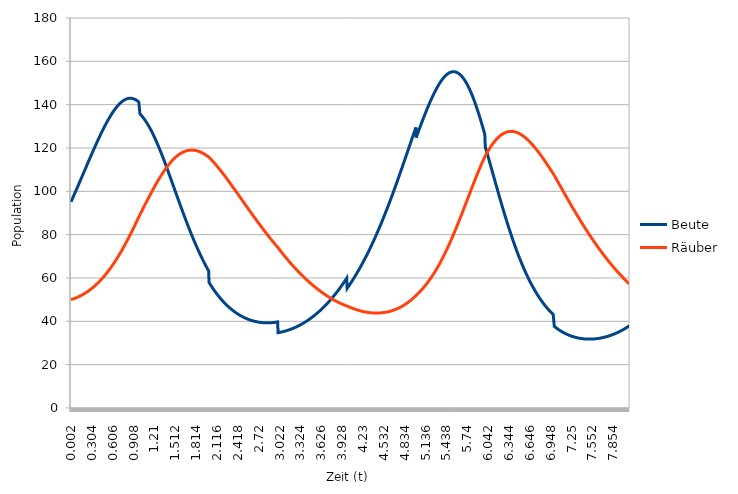
| Category | Beute | Räuber |
|---|---|---|
| 0.002 | 95.142 | 50.019 |
| 0.004 | 95.285 | 50.038 |
| 0.006 | 95.428 | 50.057 |
| 0.008 | 95.571 | 50.076 |
| 0.01 | 95.714 | 50.096 |
| 0.012 | 95.857 | 50.115 |
| 0.014 | 96 | 50.135 |
| 0.016 | 96.143 | 50.155 |
| 0.018 | 96.287 | 50.175 |
| 0.02 | 96.43 | 50.196 |
| 0.022 | 96.574 | 50.216 |
| 0.024 | 96.718 | 50.237 |
| 0.026 | 96.862 | 50.258 |
| 0.028 | 97.006 | 50.279 |
| 0.03 | 97.15 | 50.301 |
| 0.032 | 97.294 | 50.322 |
| 0.034 | 97.439 | 50.344 |
| 0.036 | 97.583 | 50.366 |
| 0.038 | 97.728 | 50.388 |
| 0.04 | 97.873 | 50.411 |
| 0.042 | 98.017 | 50.433 |
| 0.044 | 98.162 | 50.456 |
| 0.046 | 98.307 | 50.479 |
| 0.048 | 98.452 | 50.502 |
| 0.05 | 98.598 | 50.525 |
| 0.052 | 98.743 | 50.549 |
| 0.054 | 98.888 | 50.572 |
| 0.056 | 99.034 | 50.596 |
| 0.058 | 99.179 | 50.62 |
| 0.06 | 99.325 | 50.645 |
| 0.062 | 99.471 | 50.669 |
| 0.064 | 99.617 | 50.694 |
| 0.066 | 99.763 | 50.719 |
| 0.068 | 99.909 | 50.744 |
| 0.07 | 100.055 | 50.769 |
| 0.072 | 100.201 | 50.794 |
| 0.074 | 100.347 | 50.82 |
| 0.076 | 100.494 | 50.846 |
| 0.078 | 100.64 | 50.872 |
| 0.08 | 100.787 | 50.898 |
| 0.082 | 100.934 | 50.925 |
| 0.084 | 101.08 | 50.951 |
| 0.086 | 101.227 | 50.978 |
| 0.088 | 101.374 | 51.005 |
| 0.09 | 101.521 | 51.032 |
| 0.092 | 101.668 | 51.06 |
| 0.094 | 101.815 | 51.088 |
| 0.096 | 101.962 | 51.115 |
| 0.098 | 102.11 | 51.143 |
| 0.1 | 102.257 | 51.172 |
| 0.102 | 102.404 | 51.2 |
| 0.104 | 102.552 | 51.229 |
| 0.106 | 102.699 | 51.258 |
| 0.108 | 102.847 | 51.287 |
| 0.11 | 102.995 | 51.316 |
| 0.112 | 103.142 | 51.346 |
| 0.114 | 103.29 | 51.375 |
| 0.116 | 103.438 | 51.405 |
| 0.118 | 103.586 | 51.435 |
| 0.12 | 103.734 | 51.466 |
| 0.122 | 103.882 | 51.496 |
| 0.124 | 104.03 | 51.527 |
| 0.126 | 104.178 | 51.558 |
| 0.128 | 104.326 | 51.589 |
| 0.13 | 104.474 | 51.62 |
| 0.132 | 104.622 | 51.652 |
| 0.134 | 104.771 | 51.684 |
| 0.136 | 104.919 | 51.716 |
| 0.138 | 105.067 | 51.748 |
| 0.14 | 105.216 | 51.78 |
| 0.142 | 105.364 | 51.813 |
| 0.144 | 105.513 | 51.846 |
| 0.146 | 105.661 | 51.879 |
| 0.148 | 105.81 | 51.912 |
| 0.15 | 105.959 | 51.946 |
| 0.152 | 106.107 | 51.98 |
| 0.154 | 106.256 | 52.013 |
| 0.156 | 106.404 | 52.048 |
| 0.158 | 106.553 | 52.082 |
| 0.16 | 106.702 | 52.117 |
| 0.162 | 106.851 | 52.151 |
| 0.164 | 106.999 | 52.186 |
| 0.166 | 107.148 | 52.222 |
| 0.168 | 107.297 | 52.257 |
| 0.17 | 107.446 | 52.293 |
| 0.172 | 107.595 | 52.329 |
| 0.174 | 107.744 | 52.365 |
| 0.176 | 107.893 | 52.401 |
| 0.178 | 108.041 | 52.438 |
| 0.18 | 108.19 | 52.474 |
| 0.182 | 108.339 | 52.511 |
| 0.184 | 108.488 | 52.548 |
| 0.186 | 108.637 | 52.586 |
| 0.188 | 108.786 | 52.624 |
| 0.19 | 108.935 | 52.661 |
| 0.192 | 109.084 | 52.699 |
| 0.194 | 109.233 | 52.738 |
| 0.196 | 109.382 | 52.776 |
| 0.198 | 109.53 | 52.815 |
| 0.2 | 109.679 | 52.854 |
| 0.202 | 109.828 | 52.893 |
| 0.204 | 109.977 | 52.933 |
| 0.206 | 110.126 | 52.972 |
| 0.208 | 110.275 | 53.012 |
| 0.21 | 110.424 | 53.052 |
| 0.212 | 110.572 | 53.093 |
| 0.214 | 110.721 | 53.133 |
| 0.216 | 110.87 | 53.174 |
| 0.218 | 111.018 | 53.215 |
| 0.22 | 111.167 | 53.257 |
| 0.222 | 111.316 | 53.298 |
| 0.224 | 111.464 | 53.34 |
| 0.226 | 111.613 | 53.382 |
| 0.228 | 111.762 | 53.424 |
| 0.23 | 111.91 | 53.466 |
| 0.232 | 112.059 | 53.509 |
| 0.234 | 112.207 | 53.552 |
| 0.236 | 112.355 | 53.595 |
| 0.238 | 112.504 | 53.638 |
| 0.24 | 112.652 | 53.682 |
| 0.242 | 112.8 | 53.726 |
| 0.244 | 112.948 | 53.77 |
| 0.246 | 113.097 | 53.814 |
| 0.248 | 113.245 | 53.859 |
| 0.25 | 113.393 | 53.903 |
| 0.252 | 113.541 | 53.948 |
| 0.254 | 113.688 | 53.994 |
| 0.256 | 113.836 | 54.039 |
| 0.258 | 113.984 | 54.085 |
| 0.26 | 114.132 | 54.131 |
| 0.262 | 114.279 | 54.177 |
| 0.264 | 114.427 | 54.223 |
| 0.266 | 114.574 | 54.27 |
| 0.268 | 114.722 | 54.317 |
| 0.27 | 114.869 | 54.364 |
| 0.272 | 115.016 | 54.411 |
| 0.274 | 115.164 | 54.459 |
| 0.276 | 115.311 | 54.507 |
| 0.278 | 115.458 | 54.555 |
| 0.28 | 115.604 | 54.603 |
| 0.282 | 115.751 | 54.652 |
| 0.284 | 115.898 | 54.701 |
| 0.286 | 116.045 | 54.75 |
| 0.288 | 116.191 | 54.799 |
| 0.29 | 116.338 | 54.849 |
| 0.292 | 116.484 | 54.899 |
| 0.294 | 116.63 | 54.949 |
| 0.296 | 116.776 | 54.999 |
| 0.298 | 116.922 | 55.05 |
| 0.3 | 117.068 | 55.1 |
| 0.302 | 117.214 | 55.152 |
| 0.304 | 117.359 | 55.203 |
| 0.306 | 117.505 | 55.254 |
| 0.308 | 117.65 | 55.306 |
| 0.31 | 117.795 | 55.358 |
| 0.312 | 117.941 | 55.411 |
| 0.314 | 118.086 | 55.463 |
| 0.316 | 118.23 | 55.516 |
| 0.318 | 118.375 | 55.569 |
| 0.32 | 118.52 | 55.622 |
| 0.322 | 118.664 | 55.676 |
| 0.324 | 118.809 | 55.73 |
| 0.326 | 118.953 | 55.784 |
| 0.328 | 119.097 | 55.838 |
| 0.33 | 119.241 | 55.893 |
| 0.332 | 119.384 | 55.948 |
| 0.334 | 119.528 | 56.003 |
| 0.336 | 119.671 | 56.058 |
| 0.338 | 119.815 | 56.114 |
| 0.34 | 119.958 | 56.169 |
| 0.342 | 120.101 | 56.226 |
| 0.344 | 120.243 | 56.282 |
| 0.346 | 120.386 | 56.338 |
| 0.348 | 120.528 | 56.395 |
| 0.35 | 120.671 | 56.453 |
| 0.352 | 120.813 | 56.51 |
| 0.354 | 120.955 | 56.568 |
| 0.356 | 121.096 | 56.625 |
| 0.358 | 121.238 | 56.684 |
| 0.36 | 121.379 | 56.742 |
| 0.362 | 121.52 | 56.801 |
| 0.364 | 121.661 | 56.86 |
| 0.366 | 121.802 | 56.919 |
| 0.368 | 121.943 | 56.978 |
| 0.37 | 122.083 | 57.038 |
| 0.372 | 122.223 | 57.098 |
| 0.374 | 122.363 | 57.159 |
| 0.376 | 122.503 | 57.219 |
| 0.378 | 122.642 | 57.28 |
| 0.38 | 122.782 | 57.341 |
| 0.382 | 122.921 | 57.402 |
| 0.384 | 123.06 | 57.464 |
| 0.386 | 123.198 | 57.526 |
| 0.388 | 123.337 | 57.588 |
| 0.39 | 123.475 | 57.65 |
| 0.392 | 123.613 | 57.713 |
| 0.394 | 123.751 | 57.776 |
| 0.396 | 123.888 | 57.839 |
| 0.398 | 124.026 | 57.902 |
| 0.4 | 124.163 | 57.966 |
| 0.402 | 124.299 | 58.03 |
| 0.404 | 124.436 | 58.094 |
| 0.406 | 124.572 | 58.159 |
| 0.408 | 124.708 | 58.224 |
| 0.41 | 124.844 | 58.289 |
| 0.412 | 124.98 | 58.354 |
| 0.414 | 125.115 | 58.42 |
| 0.416 | 125.25 | 58.486 |
| 0.418 | 125.385 | 58.552 |
| 0.42 | 125.519 | 58.618 |
| 0.422 | 125.653 | 58.685 |
| 0.424 | 125.787 | 58.752 |
| 0.426 | 125.921 | 58.819 |
| 0.428 | 126.054 | 58.887 |
| 0.43 | 126.187 | 58.955 |
| 0.432 | 126.32 | 59.023 |
| 0.434 | 126.453 | 59.091 |
| 0.436 | 126.585 | 59.16 |
| 0.438 | 126.717 | 59.229 |
| 0.44 | 126.848 | 59.298 |
| 0.442 | 126.98 | 59.367 |
| 0.444 | 127.111 | 59.437 |
| 0.446 | 127.241 | 59.507 |
| 0.448 | 127.372 | 59.577 |
| 0.45 | 127.502 | 59.648 |
| 0.452 | 127.631 | 59.719 |
| 0.454 | 127.761 | 59.79 |
| 0.456 | 127.89 | 59.861 |
| 0.458 | 128.019 | 59.933 |
| 0.46 | 128.147 | 60.005 |
| 0.462 | 128.275 | 60.077 |
| 0.464 | 128.403 | 60.149 |
| 0.466 | 128.531 | 60.222 |
| 0.468 | 128.658 | 60.295 |
| 0.47 | 128.784 | 60.369 |
| 0.472 | 128.911 | 60.442 |
| 0.474 | 129.037 | 60.516 |
| 0.476 | 129.163 | 60.59 |
| 0.478 | 129.288 | 60.665 |
| 0.48 | 129.413 | 60.74 |
| 0.482 | 129.538 | 60.815 |
| 0.484 | 129.662 | 60.89 |
| 0.486 | 129.786 | 60.965 |
| 0.488 | 129.909 | 61.041 |
| 0.49 | 130.032 | 61.118 |
| 0.492 | 130.155 | 61.194 |
| 0.494 | 130.278 | 61.271 |
| 0.496 | 130.4 | 61.348 |
| 0.498 | 130.521 | 61.425 |
| 0.5 | 130.642 | 61.503 |
| 0.502 | 130.763 | 61.58 |
| 0.504 | 130.884 | 61.659 |
| 0.506 | 131.004 | 61.737 |
| 0.508 | 131.123 | 61.816 |
| 0.51 | 131.242 | 61.895 |
| 0.512 | 131.361 | 61.974 |
| 0.514 | 131.48 | 62.054 |
| 0.516 | 131.598 | 62.133 |
| 0.518 | 131.715 | 62.214 |
| 0.52 | 131.832 | 62.294 |
| 0.522 | 131.949 | 62.375 |
| 0.524 | 132.065 | 62.456 |
| 0.526 | 132.181 | 62.537 |
| 0.528 | 132.297 | 62.619 |
| 0.53 | 132.412 | 62.701 |
| 0.532 | 132.526 | 62.783 |
| 0.534 | 132.64 | 62.865 |
| 0.536 | 132.754 | 62.948 |
| 0.538 | 132.867 | 63.031 |
| 0.54 | 132.98 | 63.114 |
| 0.542 | 133.092 | 63.198 |
| 0.544 | 133.204 | 63.282 |
| 0.546 | 133.315 | 63.366 |
| 0.548 | 133.426 | 63.45 |
| 0.55 | 133.537 | 63.535 |
| 0.552 | 133.646 | 63.62 |
| 0.554 | 133.756 | 63.705 |
| 0.556 | 133.865 | 63.791 |
| 0.558 | 133.973 | 63.877 |
| 0.56 | 134.081 | 63.963 |
| 0.562 | 134.189 | 64.05 |
| 0.564 | 134.296 | 64.136 |
| 0.566 | 134.402 | 64.223 |
| 0.568 | 134.508 | 64.311 |
| 0.57 | 134.614 | 64.398 |
| 0.572 | 134.719 | 64.486 |
| 0.574 | 134.823 | 64.575 |
| 0.576 | 134.927 | 64.663 |
| 0.578 | 135.031 | 64.752 |
| 0.58 | 135.134 | 64.841 |
| 0.582 | 135.236 | 64.93 |
| 0.584 | 135.338 | 65.02 |
| 0.586 | 135.44 | 65.11 |
| 0.588 | 135.54 | 65.2 |
| 0.59 | 135.641 | 65.291 |
| 0.592 | 135.74 | 65.382 |
| 0.594 | 135.84 | 65.473 |
| 0.596 | 135.938 | 65.564 |
| 0.598 | 136.036 | 65.656 |
| 0.6 | 136.134 | 65.748 |
| 0.602 | 136.231 | 65.84 |
| 0.604 | 136.327 | 65.933 |
| 0.606 | 136.423 | 66.025 |
| 0.608 | 136.519 | 66.119 |
| 0.61 | 136.613 | 66.212 |
| 0.612 | 136.708 | 66.306 |
| 0.614 | 136.801 | 66.4 |
| 0.616 | 136.894 | 66.494 |
| 0.618 | 136.987 | 66.589 |
| 0.62 | 137.079 | 66.683 |
| 0.622 | 137.17 | 66.779 |
| 0.624 | 137.261 | 66.874 |
| 0.626 | 137.351 | 66.97 |
| 0.628 | 137.44 | 67.066 |
| 0.63 | 137.529 | 67.162 |
| 0.632 | 137.617 | 67.259 |
| 0.634 | 137.705 | 67.356 |
| 0.636 | 137.792 | 67.453 |
| 0.638 | 137.878 | 67.55 |
| 0.64 | 137.964 | 67.648 |
| 0.642 | 138.049 | 67.746 |
| 0.644 | 138.134 | 67.844 |
| 0.646 | 138.218 | 67.943 |
| 0.648 | 138.301 | 68.042 |
| 0.65 | 138.384 | 68.141 |
| 0.652 | 138.466 | 68.24 |
| 0.654 | 138.547 | 68.34 |
| 0.656 | 138.628 | 68.44 |
| 0.658 | 138.708 | 68.54 |
| 0.66 | 138.788 | 68.641 |
| 0.662 | 138.867 | 68.742 |
| 0.664 | 138.945 | 68.843 |
| 0.666 | 139.022 | 68.945 |
| 0.668 | 139.099 | 69.046 |
| 0.67 | 139.175 | 69.148 |
| 0.672 | 139.251 | 69.251 |
| 0.674 | 139.326 | 69.353 |
| 0.676 | 139.4 | 69.456 |
| 0.678 | 139.473 | 69.559 |
| 0.68 | 139.546 | 69.663 |
| 0.682 | 139.618 | 69.766 |
| 0.684 | 139.69 | 69.87 |
| 0.686 | 139.761 | 69.975 |
| 0.688 | 139.831 | 70.079 |
| 0.69 | 139.9 | 70.184 |
| 0.692 | 139.969 | 70.289 |
| 0.694 | 140.037 | 70.394 |
| 0.696 | 140.104 | 70.5 |
| 0.698 | 140.17 | 70.606 |
| 0.7 | 140.236 | 70.712 |
| 0.702 | 140.301 | 70.819 |
| 0.704 | 140.366 | 70.925 |
| 0.706 | 140.429 | 71.032 |
| 0.708 | 140.492 | 71.14 |
| 0.71 | 140.555 | 71.247 |
| 0.712 | 140.616 | 71.355 |
| 0.714 | 140.677 | 71.463 |
| 0.716 | 140.737 | 71.572 |
| 0.718 | 140.796 | 71.68 |
| 0.72 | 140.855 | 71.789 |
| 0.722 | 140.913 | 71.899 |
| 0.724 | 140.97 | 72.008 |
| 0.726 | 141.026 | 72.118 |
| 0.728 | 141.082 | 72.228 |
| 0.73 | 141.137 | 72.338 |
| 0.732 | 141.191 | 72.449 |
| 0.734 | 141.244 | 72.56 |
| 0.736 | 141.296 | 72.671 |
| 0.738 | 141.348 | 72.782 |
| 0.74 | 141.399 | 72.894 |
| 0.742 | 141.449 | 73.006 |
| 0.744 | 141.499 | 73.118 |
| 0.746 | 141.548 | 73.23 |
| 0.748 | 141.596 | 73.343 |
| 0.75 | 141.643 | 73.456 |
| 0.752 | 141.689 | 73.569 |
| 0.754 | 141.735 | 73.682 |
| 0.756 | 141.779 | 73.796 |
| 0.758 | 141.823 | 73.91 |
| 0.76 | 141.867 | 74.024 |
| 0.762 | 141.909 | 74.139 |
| 0.764 | 141.951 | 74.254 |
| 0.766 | 141.991 | 74.369 |
| 0.768 | 142.031 | 74.484 |
| 0.77 | 142.07 | 74.599 |
| 0.772 | 142.109 | 74.715 |
| 0.774 | 142.146 | 74.831 |
| 0.776 | 142.183 | 74.947 |
| 0.778 | 142.219 | 75.064 |
| 0.78 | 142.254 | 75.181 |
| 0.782 | 142.288 | 75.298 |
| 0.784 | 142.322 | 75.415 |
| 0.786 | 142.354 | 75.532 |
| 0.788 | 142.386 | 75.65 |
| 0.79 | 142.417 | 75.768 |
| 0.792 | 142.447 | 75.886 |
| 0.794 | 142.477 | 76.005 |
| 0.796 | 142.505 | 76.124 |
| 0.798 | 142.533 | 76.242 |
| 0.8 | 142.56 | 76.362 |
| 0.802 | 142.585 | 76.481 |
| 0.804 | 142.611 | 76.601 |
| 0.806 | 142.635 | 76.721 |
| 0.808 | 142.658 | 76.841 |
| 0.81 | 142.681 | 76.961 |
| 0.812 | 142.702 | 77.082 |
| 0.814 | 142.723 | 77.203 |
| 0.816 | 142.743 | 77.324 |
| 0.818 | 142.762 | 77.445 |
| 0.82 | 142.781 | 77.566 |
| 0.822 | 142.798 | 77.688 |
| 0.824 | 142.814 | 77.81 |
| 0.826 | 142.83 | 77.932 |
| 0.828 | 142.845 | 78.055 |
| 0.83 | 142.859 | 78.177 |
| 0.832 | 142.872 | 78.3 |
| 0.834 | 142.884 | 78.423 |
| 0.836 | 142.895 | 78.547 |
| 0.838 | 142.906 | 78.67 |
| 0.84 | 142.915 | 78.794 |
| 0.842 | 142.924 | 78.918 |
| 0.844 | 142.931 | 79.042 |
| 0.846 | 142.938 | 79.166 |
| 0.848 | 142.944 | 79.291 |
| 0.85 | 142.949 | 79.416 |
| 0.852 | 142.953 | 79.541 |
| 0.854 | 142.957 | 79.666 |
| 0.856 | 142.959 | 79.791 |
| 0.858 | 142.961 | 79.917 |
| 0.86 | 142.961 | 80.043 |
| 0.862 | 142.961 | 80.169 |
| 0.864 | 142.96 | 80.295 |
| 0.866 | 142.958 | 80.421 |
| 0.868 | 142.955 | 80.548 |
| 0.87 | 142.951 | 80.674 |
| 0.872 | 142.946 | 80.801 |
| 0.874 | 142.94 | 80.929 |
| 0.876 | 142.933 | 81.056 |
| 0.878 | 142.926 | 81.183 |
| 0.88 | 142.917 | 81.311 |
| 0.882 | 142.908 | 81.439 |
| 0.884 | 142.898 | 81.567 |
| 0.886 | 142.887 | 81.695 |
| 0.888 | 142.875 | 81.824 |
| 0.89 | 142.861 | 81.952 |
| 0.892 | 142.848 | 82.081 |
| 0.894 | 142.833 | 82.21 |
| 0.896 | 142.817 | 82.339 |
| 0.898 | 142.8 | 82.469 |
| 0.9 | 142.783 | 82.598 |
| 0.902 | 142.764 | 82.728 |
| 0.904 | 142.745 | 82.858 |
| 0.906 | 142.724 | 82.988 |
| 0.908 | 142.703 | 83.118 |
| 0.91 | 142.681 | 83.248 |
| 0.912 | 142.657 | 83.378 |
| 0.914 | 142.633 | 83.509 |
| 0.916 | 142.608 | 83.64 |
| 0.918 | 142.582 | 83.771 |
| 0.92 | 142.555 | 83.902 |
| 0.922 | 142.528 | 84.033 |
| 0.924 | 142.499 | 84.164 |
| 0.926 | 142.469 | 84.296 |
| 0.928 | 142.439 | 84.427 |
| 0.93 | 142.407 | 84.559 |
| 0.932 | 142.375 | 84.691 |
| 0.934 | 142.341 | 84.823 |
| 0.936 | 142.307 | 84.955 |
| 0.938 | 142.272 | 85.088 |
| 0.94 | 142.235 | 85.22 |
| 0.942 | 142.198 | 85.353 |
| 0.944 | 142.16 | 85.486 |
| 0.946 | 142.121 | 85.618 |
| 0.948 | 142.081 | 85.751 |
| 0.95 | 142.04 | 85.884 |
| 0.952 | 141.999 | 86.018 |
| 0.954 | 141.956 | 86.151 |
| 0.956 | 141.912 | 86.284 |
| 0.958 | 141.868 | 86.418 |
| 0.96 | 141.822 | 86.552 |
| 0.962 | 141.776 | 86.685 |
| 0.964 | 141.728 | 86.819 |
| 0.966 | 141.68 | 86.953 |
| 0.968 | 141.631 | 87.087 |
| 0.97 | 141.581 | 87.222 |
| 0.972 | 141.529 | 87.356 |
| 0.974 | 141.477 | 87.49 |
| 0.976 | 141.424 | 87.625 |
| 0.978 | 141.371 | 87.759 |
| 0.98 | 141.316 | 87.894 |
| 0.982 | 141.26 | 88.029 |
| 0.984 | 141.203 | 88.163 |
| 0.986 | 141.146 | 88.298 |
| 0.988 | 141.087 | 88.433 |
| 0.99 | 141.027 | 88.568 |
| 0.992 | 140.967 | 88.703 |
| 0.994 | 140.906 | 88.839 |
| 0.996 | 140.843 | 88.974 |
| 0.998 | 140.78 | 89.109 |
| 1.0 | 135.716 | 89.245 |
| 1.002 | 135.653 | 89.369 |
| 1.004 | 135.59 | 89.493 |
| 1.006 | 135.525 | 89.618 |
| 1.008 | 135.46 | 89.742 |
| 1.01 | 135.394 | 89.867 |
| 1.012 | 135.328 | 89.991 |
| 1.014 | 135.26 | 90.115 |
| 1.016 | 135.192 | 90.24 |
| 1.018 | 135.122 | 90.364 |
| 1.02 | 135.052 | 90.489 |
| 1.022 | 134.981 | 90.614 |
| 1.024 | 134.91 | 90.738 |
| 1.026 | 134.837 | 90.863 |
| 1.028 | 134.764 | 90.987 |
| 1.03 | 134.69 | 91.112 |
| 1.032 | 134.615 | 91.236 |
| 1.034 | 134.54 | 91.361 |
| 1.036 | 134.463 | 91.485 |
| 1.038 | 134.386 | 91.61 |
| 1.04 | 134.308 | 91.735 |
| 1.042 | 134.229 | 91.859 |
| 1.044 | 134.15 | 91.984 |
| 1.046 | 134.069 | 92.108 |
| 1.048 | 133.988 | 92.233 |
| 1.05 | 133.906 | 92.357 |
| 1.052 | 133.823 | 92.482 |
| 1.054 | 133.74 | 92.606 |
| 1.056 | 133.656 | 92.731 |
| 1.058 | 133.57 | 92.855 |
| 1.06 | 133.485 | 92.979 |
| 1.062 | 133.398 | 93.104 |
| 1.064 | 133.311 | 93.228 |
| 1.066 | 133.222 | 93.352 |
| 1.068 | 133.134 | 93.476 |
| 1.07 | 133.044 | 93.601 |
| 1.072 | 132.953 | 93.725 |
| 1.074 | 132.862 | 93.849 |
| 1.076 | 132.77 | 93.973 |
| 1.078 | 132.677 | 94.097 |
| 1.08 | 132.584 | 94.221 |
| 1.082 | 132.49 | 94.344 |
| 1.084 | 132.395 | 94.468 |
| 1.086 | 132.299 | 94.592 |
| 1.088 | 132.202 | 94.716 |
| 1.09 | 132.105 | 94.839 |
| 1.092 | 132.007 | 94.963 |
| 1.094 | 131.908 | 95.086 |
| 1.096 | 131.809 | 95.21 |
| 1.098 | 131.708 | 95.333 |
| 1.1 | 131.607 | 95.456 |
| 1.102 | 131.506 | 95.579 |
| 1.104 | 131.403 | 95.703 |
| 1.106 | 131.3 | 95.825 |
| 1.108 | 131.196 | 95.948 |
| 1.11 | 131.092 | 96.071 |
| 1.112 | 130.986 | 96.194 |
| 1.114 | 130.88 | 96.317 |
| 1.116 | 130.773 | 96.439 |
| 1.118 | 130.666 | 96.561 |
| 1.12 | 130.558 | 96.684 |
| 1.122 | 130.449 | 96.806 |
| 1.124 | 130.339 | 96.928 |
| 1.126 | 130.229 | 97.05 |
| 1.128 | 130.118 | 97.172 |
| 1.13 | 130.006 | 97.294 |
| 1.132 | 129.894 | 97.415 |
| 1.134 | 129.781 | 97.537 |
| 1.136 | 129.667 | 97.658 |
| 1.138 | 129.552 | 97.779 |
| 1.14 | 129.437 | 97.901 |
| 1.142 | 129.321 | 98.022 |
| 1.144 | 129.205 | 98.142 |
| 1.146 | 129.088 | 98.263 |
| 1.148 | 128.97 | 98.384 |
| 1.15 | 128.851 | 98.504 |
| 1.152 | 128.732 | 98.625 |
| 1.154 | 128.612 | 98.745 |
| 1.156 | 128.492 | 98.865 |
| 1.158 | 128.37 | 98.985 |
| 1.16 | 128.249 | 99.104 |
| 1.162 | 128.126 | 99.224 |
| 1.164 | 128.003 | 99.343 |
| 1.166 | 127.879 | 99.462 |
| 1.168 | 127.755 | 99.581 |
| 1.17 | 127.63 | 99.7 |
| 1.172 | 127.504 | 99.819 |
| 1.174 | 127.377 | 99.938 |
| 1.176 | 127.25 | 100.056 |
| 1.178 | 127.123 | 100.174 |
| 1.18 | 126.995 | 100.292 |
| 1.182 | 126.866 | 100.41 |
| 1.184 | 126.736 | 100.528 |
| 1.186 | 126.606 | 100.645 |
| 1.188 | 126.476 | 100.762 |
| 1.19 | 126.344 | 100.879 |
| 1.192 | 126.212 | 100.996 |
| 1.194 | 126.08 | 101.113 |
| 1.196 | 125.947 | 101.229 |
| 1.198 | 125.813 | 101.346 |
| 1.2 | 125.679 | 101.462 |
| 1.202 | 125.544 | 101.578 |
| 1.204 | 125.408 | 101.693 |
| 1.206 | 125.272 | 101.809 |
| 1.208 | 125.136 | 101.924 |
| 1.21 | 124.999 | 102.039 |
| 1.212 | 124.861 | 102.154 |
| 1.214 | 124.723 | 102.268 |
| 1.216 | 124.584 | 102.383 |
| 1.218 | 124.444 | 102.497 |
| 1.22 | 124.304 | 102.611 |
| 1.222 | 124.164 | 102.724 |
| 1.224 | 124.023 | 102.838 |
| 1.226 | 123.881 | 102.951 |
| 1.228 | 123.739 | 103.064 |
| 1.23 | 123.596 | 103.177 |
| 1.232 | 123.453 | 103.289 |
| 1.234 | 123.309 | 103.401 |
| 1.236 | 123.165 | 103.513 |
| 1.238 | 123.02 | 103.625 |
| 1.24 | 122.875 | 103.736 |
| 1.242 | 122.729 | 103.848 |
| 1.244 | 122.583 | 103.958 |
| 1.246 | 122.436 | 104.069 |
| 1.248 | 122.289 | 104.18 |
| 1.25 | 122.141 | 104.29 |
| 1.252 | 121.992 | 104.4 |
| 1.254 | 121.844 | 104.509 |
| 1.256 | 121.694 | 104.619 |
| 1.258 | 121.544 | 104.728 |
| 1.26 | 121.394 | 104.836 |
| 1.262 | 121.243 | 104.945 |
| 1.264 | 121.092 | 105.053 |
| 1.266 | 120.94 | 105.161 |
| 1.268 | 120.788 | 105.269 |
| 1.27 | 120.636 | 105.376 |
| 1.272 | 120.483 | 105.483 |
| 1.274 | 120.329 | 105.59 |
| 1.276 | 120.175 | 105.696 |
| 1.278 | 120.021 | 105.802 |
| 1.28 | 119.866 | 105.908 |
| 1.282 | 119.711 | 106.014 |
| 1.284 | 119.555 | 106.119 |
| 1.286 | 119.399 | 106.224 |
| 1.288 | 119.242 | 106.329 |
| 1.29 | 119.085 | 106.433 |
| 1.292 | 118.928 | 106.537 |
| 1.294 | 118.77 | 106.641 |
| 1.296 | 118.612 | 106.744 |
| 1.298 | 118.453 | 106.847 |
| 1.3 | 118.294 | 106.95 |
| 1.302 | 118.135 | 107.052 |
| 1.304 | 117.975 | 107.154 |
| 1.306 | 117.815 | 107.256 |
| 1.308 | 117.654 | 107.357 |
| 1.31 | 117.493 | 107.458 |
| 1.312 | 117.332 | 107.559 |
| 1.314 | 117.17 | 107.659 |
| 1.316 | 117.008 | 107.759 |
| 1.318 | 116.846 | 107.859 |
| 1.32 | 116.683 | 107.959 |
| 1.322 | 116.52 | 108.058 |
| 1.324 | 116.357 | 108.156 |
| 1.326 | 116.193 | 108.254 |
| 1.328 | 116.029 | 108.352 |
| 1.33 | 115.864 | 108.45 |
| 1.332 | 115.699 | 108.547 |
| 1.334 | 115.534 | 108.644 |
| 1.336 | 115.369 | 108.741 |
| 1.338 | 115.203 | 108.837 |
| 1.34 | 115.037 | 108.933 |
| 1.342 | 114.871 | 109.028 |
| 1.344 | 114.704 | 109.123 |
| 1.346 | 114.537 | 109.218 |
| 1.348 | 114.369 | 109.312 |
| 1.35 | 114.202 | 109.406 |
| 1.352 | 114.034 | 109.5 |
| 1.354 | 113.866 | 109.593 |
| 1.356 | 113.697 | 109.685 |
| 1.358 | 113.528 | 109.778 |
| 1.36 | 113.359 | 109.87 |
| 1.362 | 113.19 | 109.962 |
| 1.364 | 113.021 | 110.053 |
| 1.366 | 112.851 | 110.144 |
| 1.368 | 112.681 | 110.234 |
| 1.37 | 112.51 | 110.324 |
| 1.372 | 112.34 | 110.414 |
| 1.374 | 112.169 | 110.503 |
| 1.376 | 111.998 | 110.592 |
| 1.378 | 111.826 | 110.68 |
| 1.38 | 111.655 | 110.768 |
| 1.382 | 111.483 | 110.856 |
| 1.384 | 111.311 | 110.943 |
| 1.386 | 111.139 | 111.03 |
| 1.388 | 110.967 | 111.117 |
| 1.39 | 110.794 | 111.203 |
| 1.392 | 110.621 | 111.288 |
| 1.394 | 110.448 | 111.373 |
| 1.396 | 110.275 | 111.458 |
| 1.398 | 110.101 | 111.543 |
| 1.4 | 109.928 | 111.627 |
| 1.402 | 109.754 | 111.71 |
| 1.404 | 109.58 | 111.793 |
| 1.406 | 109.406 | 111.876 |
| 1.408 | 109.231 | 111.958 |
| 1.41 | 109.057 | 112.04 |
| 1.412 | 108.882 | 112.121 |
| 1.414 | 108.707 | 112.202 |
| 1.416 | 108.532 | 112.283 |
| 1.418 | 108.357 | 112.363 |
| 1.42 | 108.182 | 112.443 |
| 1.422 | 108.006 | 112.522 |
| 1.424 | 107.83 | 112.601 |
| 1.426 | 107.655 | 112.679 |
| 1.428 | 107.479 | 112.757 |
| 1.43 | 107.303 | 112.834 |
| 1.432 | 107.127 | 112.911 |
| 1.434 | 106.95 | 112.988 |
| 1.436 | 106.774 | 113.064 |
| 1.438 | 106.597 | 113.14 |
| 1.44 | 106.421 | 113.215 |
| 1.442 | 106.244 | 113.29 |
| 1.444 | 106.067 | 113.364 |
| 1.446 | 105.89 | 113.438 |
| 1.448 | 105.713 | 113.511 |
| 1.45 | 105.536 | 113.584 |
| 1.452 | 105.359 | 113.657 |
| 1.454 | 105.182 | 113.729 |
| 1.456 | 105.004 | 113.8 |
| 1.458 | 104.827 | 113.872 |
| 1.46 | 104.649 | 113.942 |
| 1.462 | 104.472 | 114.012 |
| 1.464 | 104.294 | 114.082 |
| 1.466 | 104.116 | 114.151 |
| 1.468 | 103.938 | 114.22 |
| 1.47 | 103.761 | 114.289 |
| 1.472 | 103.583 | 114.357 |
| 1.474 | 103.405 | 114.424 |
| 1.476 | 103.227 | 114.491 |
| 1.478 | 103.049 | 114.557 |
| 1.48 | 102.871 | 114.623 |
| 1.482 | 102.693 | 114.689 |
| 1.484 | 102.514 | 114.754 |
| 1.486 | 102.336 | 114.819 |
| 1.488 | 102.158 | 114.883 |
| 1.49 | 101.98 | 114.946 |
| 1.492 | 101.802 | 115.01 |
| 1.494 | 101.624 | 115.072 |
| 1.496 | 101.445 | 115.134 |
| 1.498 | 101.267 | 115.196 |
| 1.5 | 101.089 | 115.257 |
| 1.502 | 100.911 | 115.318 |
| 1.504 | 100.733 | 115.378 |
| 1.506 | 100.554 | 115.438 |
| 1.508 | 100.376 | 115.498 |
| 1.51 | 100.198 | 115.556 |
| 1.512 | 100.02 | 115.615 |
| 1.514 | 99.842 | 115.673 |
| 1.516 | 99.664 | 115.73 |
| 1.518 | 99.486 | 115.787 |
| 1.52 | 99.308 | 115.843 |
| 1.522 | 99.13 | 115.899 |
| 1.524 | 98.952 | 115.955 |
| 1.526 | 98.774 | 116.01 |
| 1.528 | 98.596 | 116.064 |
| 1.53 | 98.418 | 116.118 |
| 1.532 | 98.24 | 116.171 |
| 1.534 | 98.063 | 116.224 |
| 1.536 | 97.885 | 116.277 |
| 1.538 | 97.708 | 116.329 |
| 1.54 | 97.53 | 116.38 |
| 1.542 | 97.353 | 116.431 |
| 1.544 | 97.175 | 116.482 |
| 1.546 | 96.998 | 116.532 |
| 1.548 | 96.821 | 116.581 |
| 1.55 | 96.644 | 116.63 |
| 1.552 | 96.467 | 116.679 |
| 1.554 | 96.29 | 116.727 |
| 1.556 | 96.113 | 116.775 |
| 1.558 | 95.936 | 116.822 |
| 1.56 | 95.76 | 116.868 |
| 1.562 | 95.583 | 116.914 |
| 1.564 | 95.407 | 116.96 |
| 1.566 | 95.231 | 117.005 |
| 1.568 | 95.054 | 117.049 |
| 1.57 | 94.878 | 117.093 |
| 1.572 | 94.702 | 117.137 |
| 1.574 | 94.526 | 117.18 |
| 1.576 | 94.351 | 117.223 |
| 1.578 | 94.175 | 117.265 |
| 1.58 | 94 | 117.306 |
| 1.582 | 93.824 | 117.347 |
| 1.584 | 93.649 | 117.388 |
| 1.586 | 93.474 | 117.428 |
| 1.588 | 93.299 | 117.467 |
| 1.59 | 93.124 | 117.506 |
| 1.592 | 92.95 | 117.545 |
| 1.594 | 92.775 | 117.583 |
| 1.596 | 92.601 | 117.621 |
| 1.598 | 92.427 | 117.658 |
| 1.6 | 92.253 | 117.694 |
| 1.602 | 92.079 | 117.73 |
| 1.604 | 91.905 | 117.766 |
| 1.606 | 91.732 | 117.801 |
| 1.608 | 91.558 | 117.835 |
| 1.61 | 91.385 | 117.869 |
| 1.612 | 91.212 | 117.903 |
| 1.614 | 91.039 | 117.936 |
| 1.616 | 90.866 | 117.969 |
| 1.618 | 90.694 | 118.001 |
| 1.62 | 90.522 | 118.032 |
| 1.622 | 90.349 | 118.063 |
| 1.624 | 90.177 | 118.094 |
| 1.626 | 90.006 | 118.124 |
| 1.628 | 89.834 | 118.153 |
| 1.63 | 89.663 | 118.182 |
| 1.632 | 89.492 | 118.211 |
| 1.634 | 89.321 | 118.239 |
| 1.636 | 89.15 | 118.267 |
| 1.638 | 88.979 | 118.294 |
| 1.64 | 88.809 | 118.32 |
| 1.642 | 88.639 | 118.346 |
| 1.644 | 88.469 | 118.372 |
| 1.646 | 88.299 | 118.397 |
| 1.648 | 88.13 | 118.421 |
| 1.65 | 87.96 | 118.445 |
| 1.652 | 87.791 | 118.469 |
| 1.654 | 87.622 | 118.492 |
| 1.656 | 87.454 | 118.515 |
| 1.658 | 87.285 | 118.537 |
| 1.66 | 87.117 | 118.558 |
| 1.662 | 86.949 | 118.579 |
| 1.664 | 86.781 | 118.6 |
| 1.666 | 86.614 | 118.62 |
| 1.668 | 86.447 | 118.64 |
| 1.67 | 86.28 | 118.659 |
| 1.672 | 86.113 | 118.678 |
| 1.674 | 85.946 | 118.696 |
| 1.676 | 85.78 | 118.713 |
| 1.678 | 85.614 | 118.73 |
| 1.68 | 85.448 | 118.747 |
| 1.682 | 85.283 | 118.763 |
| 1.684 | 85.117 | 118.779 |
| 1.686 | 84.952 | 118.794 |
| 1.688 | 84.788 | 118.809 |
| 1.69 | 84.623 | 118.823 |
| 1.692 | 84.459 | 118.837 |
| 1.694 | 84.295 | 118.85 |
| 1.696 | 84.131 | 118.863 |
| 1.698 | 83.968 | 118.875 |
| 1.7 | 83.804 | 118.887 |
| 1.702 | 83.641 | 118.898 |
| 1.704 | 83.479 | 118.909 |
| 1.706 | 83.316 | 118.919 |
| 1.708 | 83.154 | 118.929 |
| 1.71 | 82.992 | 118.939 |
| 1.712 | 82.831 | 118.948 |
| 1.714 | 82.669 | 118.956 |
| 1.716 | 82.508 | 118.964 |
| 1.718 | 82.348 | 118.971 |
| 1.72 | 82.187 | 118.978 |
| 1.722 | 82.027 | 118.985 |
| 1.724 | 81.867 | 118.991 |
| 1.726 | 81.708 | 118.996 |
| 1.728 | 81.548 | 119.002 |
| 1.73 | 81.389 | 119.006 |
| 1.732 | 81.23 | 119.01 |
| 1.734 | 81.072 | 119.014 |
| 1.736 | 80.914 | 119.017 |
| 1.738 | 80.756 | 119.02 |
| 1.74 | 80.598 | 119.022 |
| 1.742 | 80.441 | 119.024 |
| 1.744 | 80.284 | 119.025 |
| 1.746 | 80.128 | 119.026 |
| 1.748 | 79.971 | 119.026 |
| 1.75 | 79.815 | 119.026 |
| 1.752 | 79.659 | 119.026 |
| 1.754 | 79.504 | 119.025 |
| 1.756 | 79.349 | 119.023 |
| 1.758 | 79.194 | 119.021 |
| 1.76 | 79.04 | 119.019 |
| 1.762 | 78.885 | 119.016 |
| 1.764 | 78.731 | 119.013 |
| 1.766 | 78.578 | 119.009 |
| 1.768 | 78.425 | 119.005 |
| 1.77 | 78.272 | 119 |
| 1.772 | 78.119 | 118.995 |
| 1.774 | 77.967 | 118.989 |
| 1.776 | 77.815 | 118.983 |
| 1.778 | 77.663 | 118.977 |
| 1.78 | 77.512 | 118.97 |
| 1.782 | 77.361 | 118.962 |
| 1.784 | 77.21 | 118.955 |
| 1.786 | 77.06 | 118.946 |
| 1.788 | 76.909 | 118.938 |
| 1.79 | 76.76 | 118.928 |
| 1.792 | 76.61 | 118.919 |
| 1.794 | 76.461 | 118.909 |
| 1.796 | 76.313 | 118.898 |
| 1.798 | 76.164 | 118.887 |
| 1.8 | 76.016 | 118.876 |
| 1.802 | 75.868 | 118.864 |
| 1.804 | 75.721 | 118.852 |
| 1.806 | 75.574 | 118.839 |
| 1.808 | 75.427 | 118.826 |
| 1.81 | 75.281 | 118.812 |
| 1.812 | 75.134 | 118.798 |
| 1.814 | 74.989 | 118.784 |
| 1.816 | 74.843 | 118.769 |
| 1.818 | 74.698 | 118.754 |
| 1.82 | 74.553 | 118.738 |
| 1.822 | 74.409 | 118.722 |
| 1.824 | 74.265 | 118.705 |
| 1.826 | 74.121 | 118.688 |
| 1.828 | 73.978 | 118.671 |
| 1.83 | 73.835 | 118.653 |
| 1.832 | 73.692 | 118.634 |
| 1.834 | 73.55 | 118.616 |
| 1.836 | 73.408 | 118.597 |
| 1.838 | 73.266 | 118.577 |
| 1.84 | 73.125 | 118.557 |
| 1.842 | 72.984 | 118.537 |
| 1.844 | 72.843 | 118.516 |
| 1.846 | 72.703 | 118.495 |
| 1.848 | 72.563 | 118.473 |
| 1.85 | 72.423 | 118.451 |
| 1.852 | 72.284 | 118.429 |
| 1.854 | 72.145 | 118.406 |
| 1.856 | 72.007 | 118.383 |
| 1.858 | 71.869 | 118.359 |
| 1.86 | 71.731 | 118.335 |
| 1.862 | 71.593 | 118.31 |
| 1.864 | 71.456 | 118.285 |
| 1.866 | 71.319 | 118.26 |
| 1.868 | 71.183 | 118.235 |
| 1.87 | 71.047 | 118.208 |
| 1.872 | 70.911 | 118.182 |
| 1.874 | 70.776 | 118.155 |
| 1.876 | 70.641 | 118.128 |
| 1.878 | 70.506 | 118.1 |
| 1.88 | 70.372 | 118.072 |
| 1.882 | 70.238 | 118.044 |
| 1.884 | 70.104 | 118.015 |
| 1.886 | 69.971 | 117.986 |
| 1.888 | 69.838 | 117.956 |
| 1.89 | 69.705 | 117.926 |
| 1.892 | 69.573 | 117.896 |
| 1.894 | 69.441 | 117.865 |
| 1.896 | 69.31 | 117.834 |
| 1.898 | 69.179 | 117.803 |
| 1.9 | 69.048 | 117.771 |
| 1.902 | 68.918 | 117.738 |
| 1.904 | 68.788 | 117.706 |
| 1.906 | 68.658 | 117.673 |
| 1.908 | 68.529 | 117.639 |
| 1.91 | 68.4 | 117.606 |
| 1.912 | 68.271 | 117.572 |
| 1.914 | 68.143 | 117.537 |
| 1.916 | 68.015 | 117.502 |
| 1.918 | 67.887 | 117.467 |
| 1.92 | 67.76 | 117.432 |
| 1.922 | 67.633 | 117.396 |
| 1.924 | 67.507 | 117.359 |
| 1.926 | 67.381 | 117.323 |
| 1.928 | 67.255 | 117.286 |
| 1.93 | 67.13 | 117.248 |
| 1.932 | 67.005 | 117.211 |
| 1.934 | 66.88 | 117.172 |
| 1.936 | 66.756 | 117.134 |
| 1.938 | 66.632 | 117.095 |
| 1.94 | 66.508 | 117.056 |
| 1.942 | 66.385 | 117.017 |
| 1.944 | 66.262 | 116.977 |
| 1.946 | 66.14 | 116.937 |
| 1.948 | 66.017 | 116.896 |
| 1.95 | 65.896 | 116.855 |
| 1.952 | 65.774 | 116.814 |
| 1.954 | 65.653 | 116.773 |
| 1.956 | 65.532 | 116.731 |
| 1.958 | 65.412 | 116.688 |
| 1.96 | 65.292 | 116.646 |
| 1.962 | 65.172 | 116.603 |
| 1.964 | 65.053 | 116.56 |
| 1.966 | 64.934 | 116.516 |
| 1.968 | 64.816 | 116.472 |
| 1.97 | 64.697 | 116.428 |
| 1.972 | 64.58 | 116.384 |
| 1.974 | 64.462 | 116.339 |
| 1.976 | 64.345 | 116.293 |
| 1.978 | 64.228 | 116.248 |
| 1.98 | 64.112 | 116.202 |
| 1.982 | 63.996 | 116.156 |
| 1.984 | 63.88 | 116.11 |
| 1.986 | 63.765 | 116.063 |
| 1.988 | 63.65 | 116.016 |
| 1.99 | 63.535 | 115.968 |
| 1.992 | 63.421 | 115.92 |
| 1.994 | 63.307 | 115.872 |
| 1.996 | 63.193 | 115.824 |
| 1.998 | 63.08 | 115.775 |
| 2.0 | 57.967 | 115.726 |
| 2.002 | 57.864 | 115.663 |
| 2.004 | 57.761 | 115.599 |
| 2.006 | 57.658 | 115.534 |
| 2.008 | 57.555 | 115.47 |
| 2.01 | 57.453 | 115.405 |
| 2.012 | 57.352 | 115.34 |
| 2.014 | 57.25 | 115.275 |
| 2.016 | 57.149 | 115.209 |
| 2.018 | 57.049 | 115.143 |
| 2.02 | 56.949 | 115.077 |
| 2.022 | 56.849 | 115.011 |
| 2.024 | 56.749 | 114.944 |
| 2.026 | 56.65 | 114.878 |
| 2.028 | 56.551 | 114.811 |
| 2.03 | 56.453 | 114.743 |
| 2.032 | 56.355 | 114.676 |
| 2.034 | 56.257 | 114.608 |
| 2.036 | 56.16 | 114.54 |
| 2.038 | 56.063 | 114.472 |
| 2.04 | 55.966 | 114.403 |
| 2.042 | 55.87 | 114.334 |
| 2.044 | 55.774 | 114.265 |
| 2.046 | 55.678 | 114.196 |
| 2.048 | 55.583 | 114.127 |
| 2.05 | 55.488 | 114.057 |
| 2.052 | 55.394 | 113.987 |
| 2.054 | 55.3 | 113.917 |
| 2.056 | 55.206 | 113.847 |
| 2.058 | 55.112 | 113.776 |
| 2.06 | 55.019 | 113.705 |
| 2.062 | 54.927 | 113.634 |
| 2.064 | 54.834 | 113.563 |
| 2.066 | 54.742 | 113.492 |
| 2.068 | 54.651 | 113.42 |
| 2.07 | 54.559 | 113.348 |
| 2.072 | 54.468 | 113.276 |
| 2.074 | 54.378 | 113.204 |
| 2.076 | 54.287 | 113.131 |
| 2.078 | 54.197 | 113.058 |
| 2.08 | 54.108 | 112.986 |
| 2.082 | 54.019 | 112.912 |
| 2.084 | 53.93 | 112.839 |
| 2.086 | 53.841 | 112.766 |
| 2.088 | 53.753 | 112.692 |
| 2.09 | 53.665 | 112.618 |
| 2.092 | 53.578 | 112.544 |
| 2.094 | 53.49 | 112.469 |
| 2.096 | 53.404 | 112.395 |
| 2.098 | 53.317 | 112.32 |
| 2.1 | 53.231 | 112.245 |
| 2.102 | 53.145 | 112.17 |
| 2.104 | 53.06 | 112.095 |
| 2.106 | 52.974 | 112.019 |
| 2.108 | 52.89 | 111.944 |
| 2.11 | 52.805 | 111.868 |
| 2.112 | 52.721 | 111.792 |
| 2.114 | 52.637 | 111.715 |
| 2.116 | 52.554 | 111.639 |
| 2.118 | 52.471 | 111.562 |
| 2.12 | 52.388 | 111.486 |
| 2.122 | 52.305 | 111.409 |
| 2.124 | 52.223 | 111.331 |
| 2.126 | 52.141 | 111.254 |
| 2.128 | 52.06 | 111.177 |
| 2.13 | 51.979 | 111.099 |
| 2.132 | 51.898 | 111.021 |
| 2.134 | 51.817 | 110.943 |
| 2.136 | 51.737 | 110.865 |
| 2.138 | 51.657 | 110.787 |
| 2.14 | 51.578 | 110.708 |
| 2.142 | 51.499 | 110.63 |
| 2.144 | 51.42 | 110.551 |
| 2.146 | 51.341 | 110.472 |
| 2.148 | 51.263 | 110.393 |
| 2.15 | 51.185 | 110.313 |
| 2.152 | 51.108 | 110.234 |
| 2.154 | 51.03 | 110.154 |
| 2.156 | 50.953 | 110.074 |
| 2.158 | 50.877 | 109.994 |
| 2.16 | 50.8 | 109.914 |
| 2.162 | 50.724 | 109.834 |
| 2.164 | 50.649 | 109.754 |
| 2.166 | 50.573 | 109.673 |
| 2.168 | 50.498 | 109.593 |
| 2.17 | 50.424 | 109.512 |
| 2.172 | 50.349 | 109.431 |
| 2.174 | 50.275 | 109.35 |
| 2.176 | 50.201 | 109.268 |
| 2.178 | 50.128 | 109.187 |
| 2.18 | 50.055 | 109.105 |
| 2.182 | 49.982 | 109.024 |
| 2.184 | 49.909 | 108.942 |
| 2.186 | 49.837 | 108.86 |
| 2.188 | 49.765 | 108.778 |
| 2.19 | 49.694 | 108.696 |
| 2.192 | 49.622 | 108.613 |
| 2.194 | 49.551 | 108.531 |
| 2.196 | 49.481 | 108.448 |
| 2.198 | 49.41 | 108.365 |
| 2.2 | 49.34 | 108.283 |
| 2.202 | 49.27 | 108.2 |
| 2.204 | 49.201 | 108.116 |
| 2.206 | 49.132 | 108.033 |
| 2.208 | 49.063 | 107.95 |
| 2.21 | 48.994 | 107.866 |
| 2.212 | 48.926 | 107.783 |
| 2.214 | 48.858 | 107.699 |
| 2.216 | 48.79 | 107.615 |
| 2.218 | 48.723 | 107.531 |
| 2.22 | 48.656 | 107.447 |
| 2.222 | 48.589 | 107.363 |
| 2.224 | 48.523 | 107.279 |
| 2.226 | 48.457 | 107.194 |
| 2.228 | 48.391 | 107.11 |
| 2.23 | 48.325 | 107.025 |
| 2.232 | 48.26 | 106.94 |
| 2.234 | 48.195 | 106.855 |
| 2.236 | 48.13 | 106.77 |
| 2.238 | 48.066 | 106.685 |
| 2.24 | 48.002 | 106.6 |
| 2.242 | 47.938 | 106.515 |
| 2.244 | 47.874 | 106.43 |
| 2.246 | 47.811 | 106.344 |
| 2.248 | 47.748 | 106.258 |
| 2.25 | 47.685 | 106.173 |
| 2.252 | 47.623 | 106.087 |
| 2.254 | 47.561 | 106.001 |
| 2.256 | 47.499 | 105.915 |
| 2.258 | 47.437 | 105.829 |
| 2.26 | 47.376 | 105.743 |
| 2.262 | 47.315 | 105.657 |
| 2.264 | 47.254 | 105.57 |
| 2.266 | 47.194 | 105.484 |
| 2.268 | 47.134 | 105.397 |
| 2.27 | 47.074 | 105.311 |
| 2.272 | 47.014 | 105.224 |
| 2.274 | 46.955 | 105.137 |
| 2.276 | 46.896 | 105.051 |
| 2.278 | 46.837 | 104.964 |
| 2.28 | 46.779 | 104.877 |
| 2.282 | 46.721 | 104.789 |
| 2.284 | 46.663 | 104.702 |
| 2.286 | 46.605 | 104.615 |
| 2.288 | 46.548 | 104.528 |
| 2.29 | 46.491 | 104.44 |
| 2.292 | 46.434 | 104.353 |
| 2.294 | 46.377 | 104.265 |
| 2.296 | 46.321 | 104.178 |
| 2.298 | 46.265 | 104.09 |
| 2.3 | 46.209 | 104.002 |
| 2.302 | 46.154 | 103.914 |
| 2.304 | 46.099 | 103.826 |
| 2.306 | 46.044 | 103.738 |
| 2.308 | 45.989 | 103.65 |
| 2.31 | 45.935 | 103.562 |
| 2.312 | 45.881 | 103.474 |
| 2.314 | 45.827 | 103.386 |
| 2.316 | 45.773 | 103.297 |
| 2.318 | 45.72 | 103.209 |
| 2.32 | 45.667 | 103.12 |
| 2.322 | 45.614 | 103.032 |
| 2.324 | 45.562 | 102.943 |
| 2.326 | 45.509 | 102.855 |
| 2.328 | 45.457 | 102.766 |
| 2.33 | 45.406 | 102.677 |
| 2.332 | 45.354 | 102.589 |
| 2.334 | 45.303 | 102.5 |
| 2.336 | 45.252 | 102.411 |
| 2.338 | 45.201 | 102.322 |
| 2.34 | 45.151 | 102.233 |
| 2.342 | 45.101 | 102.144 |
| 2.344 | 45.051 | 102.055 |
| 2.346 | 45.001 | 101.965 |
| 2.348 | 44.951 | 101.876 |
| 2.35 | 44.902 | 101.787 |
| 2.352 | 44.853 | 101.698 |
| 2.354 | 44.805 | 101.608 |
| 2.356 | 44.756 | 101.519 |
| 2.358 | 44.708 | 101.429 |
| 2.36 | 44.66 | 101.34 |
| 2.362 | 44.613 | 101.25 |
| 2.364 | 44.565 | 101.161 |
| 2.366 | 44.518 | 101.071 |
| 2.368 | 44.471 | 100.982 |
| 2.37 | 44.425 | 100.892 |
| 2.372 | 44.378 | 100.802 |
| 2.374 | 44.332 | 100.712 |
| 2.376 | 44.286 | 100.623 |
| 2.378 | 44.24 | 100.533 |
| 2.38 | 44.195 | 100.443 |
| 2.382 | 44.15 | 100.353 |
| 2.384 | 44.105 | 100.263 |
| 2.386 | 44.06 | 100.173 |
| 2.388 | 44.016 | 100.083 |
| 2.39 | 43.972 | 99.993 |
| 2.392 | 43.928 | 99.903 |
| 2.394 | 43.884 | 99.813 |
| 2.396 | 43.84 | 99.723 |
| 2.398 | 43.797 | 99.633 |
| 2.4 | 43.754 | 99.542 |
| 2.402 | 43.711 | 99.452 |
| 2.404 | 43.669 | 99.362 |
| 2.406 | 43.627 | 99.272 |
| 2.408 | 43.585 | 99.181 |
| 2.41 | 43.543 | 99.091 |
| 2.412 | 43.501 | 99.001 |
| 2.414 | 43.46 | 98.91 |
| 2.416 | 43.419 | 98.82 |
| 2.418 | 43.378 | 98.73 |
| 2.42 | 43.337 | 98.639 |
| 2.422 | 43.297 | 98.549 |
| 2.424 | 43.257 | 98.459 |
| 2.426 | 43.217 | 98.368 |
| 2.428 | 43.177 | 98.278 |
| 2.43 | 43.138 | 98.187 |
| 2.432 | 43.098 | 98.097 |
| 2.434 | 43.059 | 98.006 |
| 2.436 | 43.021 | 97.916 |
| 2.438 | 42.982 | 97.825 |
| 2.44 | 42.944 | 97.735 |
| 2.442 | 42.906 | 97.644 |
| 2.444 | 42.868 | 97.554 |
| 2.446 | 42.83 | 97.463 |
| 2.448 | 42.793 | 97.372 |
| 2.45 | 42.756 | 97.282 |
| 2.452 | 42.719 | 97.191 |
| 2.454 | 42.682 | 97.101 |
| 2.456 | 42.646 | 97.01 |
| 2.458 | 42.609 | 96.919 |
| 2.46 | 42.573 | 96.829 |
| 2.462 | 42.537 | 96.738 |
| 2.464 | 42.502 | 96.648 |
| 2.466 | 42.466 | 96.557 |
| 2.468 | 42.431 | 96.466 |
| 2.47 | 42.396 | 96.376 |
| 2.472 | 42.362 | 96.285 |
| 2.474 | 42.327 | 96.195 |
| 2.476 | 42.293 | 96.104 |
| 2.478 | 42.259 | 96.013 |
| 2.48 | 42.225 | 95.923 |
| 2.482 | 42.191 | 95.832 |
| 2.484 | 42.158 | 95.742 |
| 2.486 | 42.125 | 95.651 |
| 2.488 | 42.092 | 95.561 |
| 2.49 | 42.059 | 95.47 |
| 2.492 | 42.027 | 95.379 |
| 2.494 | 41.994 | 95.289 |
| 2.496 | 41.962 | 95.198 |
| 2.498 | 41.93 | 95.108 |
| 2.5 | 41.899 | 95.017 |
| 2.502 | 41.867 | 94.927 |
| 2.504 | 41.836 | 94.836 |
| 2.506 | 41.805 | 94.746 |
| 2.508 | 41.774 | 94.655 |
| 2.51 | 41.743 | 94.565 |
| 2.512 | 41.713 | 94.474 |
| 2.514 | 41.683 | 94.384 |
| 2.516 | 41.653 | 94.294 |
| 2.518 | 41.623 | 94.203 |
| 2.52 | 41.594 | 94.113 |
| 2.522 | 41.564 | 94.022 |
| 2.524 | 41.535 | 93.932 |
| 2.526 | 41.506 | 93.842 |
| 2.528 | 41.477 | 93.751 |
| 2.53 | 41.449 | 93.661 |
| 2.532 | 41.421 | 93.571 |
| 2.534 | 41.392 | 93.481 |
| 2.536 | 41.365 | 93.39 |
| 2.538 | 41.337 | 93.3 |
| 2.54 | 41.309 | 93.21 |
| 2.542 | 41.282 | 93.12 |
| 2.544 | 41.255 | 93.03 |
| 2.546 | 41.228 | 92.94 |
| 2.548 | 41.201 | 92.85 |
| 2.55 | 41.175 | 92.76 |
| 2.552 | 41.149 | 92.669 |
| 2.554 | 41.123 | 92.579 |
| 2.556 | 41.097 | 92.49 |
| 2.558 | 41.071 | 92.4 |
| 2.56 | 41.046 | 92.31 |
| 2.562 | 41.02 | 92.22 |
| 2.564 | 40.995 | 92.13 |
| 2.566 | 40.97 | 92.04 |
| 2.568 | 40.946 | 91.95 |
| 2.57 | 40.921 | 91.86 |
| 2.572 | 40.897 | 91.771 |
| 2.574 | 40.873 | 91.681 |
| 2.576 | 40.849 | 91.591 |
| 2.578 | 40.825 | 91.502 |
| 2.58 | 40.802 | 91.412 |
| 2.582 | 40.779 | 91.322 |
| 2.584 | 40.756 | 91.233 |
| 2.586 | 40.733 | 91.143 |
| 2.588 | 40.71 | 91.054 |
| 2.59 | 40.687 | 90.964 |
| 2.592 | 40.665 | 90.875 |
| 2.594 | 40.643 | 90.786 |
| 2.596 | 40.621 | 90.696 |
| 2.598 | 40.599 | 90.607 |
| 2.6 | 40.578 | 90.518 |
| 2.602 | 40.557 | 90.429 |
| 2.604 | 40.535 | 90.339 |
| 2.606 | 40.514 | 90.25 |
| 2.608 | 40.494 | 90.161 |
| 2.61 | 40.473 | 90.072 |
| 2.612 | 40.453 | 89.983 |
| 2.614 | 40.433 | 89.894 |
| 2.616 | 40.413 | 89.805 |
| 2.618 | 40.393 | 89.716 |
| 2.62 | 40.373 | 89.628 |
| 2.622 | 40.354 | 89.539 |
| 2.624 | 40.334 | 89.45 |
| 2.626 | 40.315 | 89.361 |
| 2.628 | 40.296 | 89.273 |
| 2.63 | 40.278 | 89.184 |
| 2.632 | 40.259 | 89.096 |
| 2.634 | 40.241 | 89.007 |
| 2.636 | 40.223 | 88.919 |
| 2.638 | 40.205 | 88.83 |
| 2.64 | 40.187 | 88.742 |
| 2.642 | 40.17 | 88.653 |
| 2.644 | 40.152 | 88.565 |
| 2.646 | 40.135 | 88.477 |
| 2.648 | 40.118 | 88.389 |
| 2.65 | 40.101 | 88.301 |
| 2.652 | 40.085 | 88.213 |
| 2.654 | 40.068 | 88.125 |
| 2.656 | 40.052 | 88.037 |
| 2.658 | 40.036 | 87.949 |
| 2.66 | 40.02 | 87.861 |
| 2.662 | 40.004 | 87.773 |
| 2.664 | 39.989 | 87.685 |
| 2.666 | 39.973 | 87.597 |
| 2.668 | 39.958 | 87.51 |
| 2.67 | 39.943 | 87.422 |
| 2.672 | 39.928 | 87.335 |
| 2.674 | 39.914 | 87.247 |
| 2.676 | 39.899 | 87.16 |
| 2.678 | 39.885 | 87.072 |
| 2.68 | 39.871 | 86.985 |
| 2.682 | 39.857 | 86.898 |
| 2.684 | 39.843 | 86.811 |
| 2.686 | 39.829 | 86.723 |
| 2.688 | 39.816 | 86.636 |
| 2.69 | 39.803 | 86.549 |
| 2.692 | 39.79 | 86.462 |
| 2.694 | 39.777 | 86.375 |
| 2.696 | 39.764 | 86.289 |
| 2.698 | 39.752 | 86.202 |
| 2.7 | 39.739 | 86.115 |
| 2.702 | 39.727 | 86.028 |
| 2.704 | 39.715 | 85.942 |
| 2.706 | 39.704 | 85.855 |
| 2.708 | 39.692 | 85.769 |
| 2.71 | 39.68 | 85.682 |
| 2.712 | 39.669 | 85.596 |
| 2.714 | 39.658 | 85.51 |
| 2.716 | 39.647 | 85.423 |
| 2.718 | 39.636 | 85.337 |
| 2.72 | 39.626 | 85.251 |
| 2.722 | 39.615 | 85.165 |
| 2.724 | 39.605 | 85.079 |
| 2.726 | 39.595 | 84.993 |
| 2.728 | 39.585 | 84.907 |
| 2.73 | 39.576 | 84.821 |
| 2.732 | 39.566 | 84.736 |
| 2.734 | 39.557 | 84.65 |
| 2.736 | 39.547 | 84.564 |
| 2.738 | 39.538 | 84.479 |
| 2.74 | 39.53 | 84.393 |
| 2.742 | 39.521 | 84.308 |
| 2.744 | 39.512 | 84.223 |
| 2.746 | 39.504 | 84.138 |
| 2.748 | 39.496 | 84.052 |
| 2.75 | 39.488 | 83.967 |
| 2.752 | 39.48 | 83.882 |
| 2.754 | 39.472 | 83.797 |
| 2.756 | 39.465 | 83.712 |
| 2.758 | 39.458 | 83.627 |
| 2.76 | 39.45 | 83.543 |
| 2.762 | 39.443 | 83.458 |
| 2.764 | 39.437 | 83.373 |
| 2.766 | 39.43 | 83.289 |
| 2.768 | 39.423 | 83.204 |
| 2.77 | 39.417 | 83.12 |
| 2.772 | 39.411 | 83.036 |
| 2.774 | 39.405 | 82.951 |
| 2.776 | 39.399 | 82.867 |
| 2.778 | 39.393 | 82.783 |
| 2.78 | 39.388 | 82.699 |
| 2.782 | 39.383 | 82.615 |
| 2.784 | 39.378 | 82.531 |
| 2.786 | 39.373 | 82.447 |
| 2.788 | 39.368 | 82.364 |
| 2.79 | 39.363 | 82.28 |
| 2.792 | 39.359 | 82.196 |
| 2.794 | 39.354 | 82.113 |
| 2.796 | 39.35 | 82.029 |
| 2.798 | 39.346 | 81.946 |
| 2.8 | 39.342 | 81.863 |
| 2.802 | 39.339 | 81.78 |
| 2.804 | 39.335 | 81.696 |
| 2.806 | 39.332 | 81.613 |
| 2.808 | 39.329 | 81.53 |
| 2.81 | 39.326 | 81.448 |
| 2.812 | 39.323 | 81.365 |
| 2.814 | 39.32 | 81.282 |
| 2.816 | 39.318 | 81.199 |
| 2.818 | 39.315 | 81.117 |
| 2.82 | 39.313 | 81.034 |
| 2.822 | 39.311 | 80.952 |
| 2.824 | 39.309 | 80.869 |
| 2.826 | 39.307 | 80.787 |
| 2.828 | 39.306 | 80.705 |
| 2.83 | 39.304 | 80.623 |
| 2.832 | 39.303 | 80.541 |
| 2.834 | 39.302 | 80.459 |
| 2.836 | 39.301 | 80.377 |
| 2.838 | 39.301 | 80.295 |
| 2.84 | 39.3 | 80.214 |
| 2.842 | 39.3 | 80.132 |
| 2.844 | 39.299 | 80.05 |
| 2.846 | 39.299 | 79.969 |
| 2.848 | 39.299 | 79.888 |
| 2.85 | 39.299 | 79.806 |
| 2.852 | 39.3 | 79.725 |
| 2.854 | 39.3 | 79.644 |
| 2.856 | 39.301 | 79.563 |
| 2.858 | 39.302 | 79.482 |
| 2.86 | 39.303 | 79.401 |
| 2.862 | 39.304 | 79.32 |
| 2.864 | 39.305 | 79.24 |
| 2.866 | 39.307 | 79.159 |
| 2.868 | 39.309 | 79.078 |
| 2.87 | 39.31 | 78.998 |
| 2.872 | 39.312 | 78.918 |
| 2.874 | 39.315 | 78.837 |
| 2.876 | 39.317 | 78.757 |
| 2.878 | 39.319 | 78.677 |
| 2.88 | 39.322 | 78.597 |
| 2.882 | 39.325 | 78.517 |
| 2.884 | 39.328 | 78.437 |
| 2.886 | 39.331 | 78.358 |
| 2.888 | 39.334 | 78.278 |
| 2.89 | 39.337 | 78.198 |
| 2.892 | 39.341 | 78.119 |
| 2.894 | 39.344 | 78.039 |
| 2.896 | 39.348 | 77.96 |
| 2.898 | 39.352 | 77.881 |
| 2.9 | 39.357 | 77.802 |
| 2.902 | 39.361 | 77.723 |
| 2.904 | 39.365 | 77.644 |
| 2.906 | 39.37 | 77.565 |
| 2.908 | 39.375 | 77.486 |
| 2.91 | 39.38 | 77.407 |
| 2.912 | 39.385 | 77.329 |
| 2.914 | 39.39 | 77.25 |
| 2.916 | 39.395 | 77.172 |
| 2.918 | 39.401 | 77.093 |
| 2.92 | 39.407 | 77.015 |
| 2.922 | 39.413 | 76.937 |
| 2.924 | 39.419 | 76.859 |
| 2.926 | 39.425 | 76.781 |
| 2.928 | 39.431 | 76.703 |
| 2.93 | 39.438 | 76.625 |
| 2.932 | 39.444 | 76.548 |
| 2.934 | 39.451 | 76.47 |
| 2.936 | 39.458 | 76.393 |
| 2.938 | 39.465 | 76.315 |
| 2.94 | 39.473 | 76.238 |
| 2.942 | 39.48 | 76.16 |
| 2.944 | 39.488 | 76.083 |
| 2.946 | 39.495 | 76.006 |
| 2.948 | 39.503 | 75.929 |
| 2.95 | 39.511 | 75.852 |
| 2.952 | 39.519 | 75.776 |
| 2.954 | 39.528 | 75.699 |
| 2.956 | 39.536 | 75.622 |
| 2.958 | 39.545 | 75.546 |
| 2.96 | 39.554 | 75.469 |
| 2.962 | 39.563 | 75.393 |
| 2.964 | 39.572 | 75.317 |
| 2.966 | 39.581 | 75.241 |
| 2.968 | 39.59 | 75.165 |
| 2.97 | 39.6 | 75.089 |
| 2.972 | 39.61 | 75.013 |
| 2.974 | 39.62 | 74.937 |
| 2.976 | 39.63 | 74.862 |
| 2.978 | 39.64 | 74.786 |
| 2.98 | 39.65 | 74.711 |
| 2.982 | 39.661 | 74.635 |
| 2.984 | 39.671 | 74.56 |
| 2.986 | 39.682 | 74.485 |
| 2.988 | 39.693 | 74.41 |
| 2.99 | 39.704 | 74.335 |
| 2.992 | 39.715 | 74.26 |
| 2.994 | 39.727 | 74.185 |
| 2.996 | 39.738 | 74.11 |
| 2.998 | 39.75 | 74.036 |
| 3.0 | 34.762 | 73.961 |
| 3.002 | 34.772 | 73.878 |
| 3.004 | 34.783 | 73.794 |
| 3.006 | 34.794 | 73.711 |
| 3.008 | 34.805 | 73.627 |
| 3.01 | 34.816 | 73.544 |
| 3.012 | 34.827 | 73.461 |
| 3.014 | 34.838 | 73.378 |
| 3.016 | 34.85 | 73.295 |
| 3.018 | 34.862 | 73.213 |
| 3.02 | 34.874 | 73.13 |
| 3.022 | 34.886 | 73.047 |
| 3.024 | 34.898 | 72.965 |
| 3.026 | 34.91 | 72.883 |
| 3.028 | 34.922 | 72.801 |
| 3.03 | 34.935 | 72.719 |
| 3.032 | 34.948 | 72.637 |
| 3.034 | 34.96 | 72.555 |
| 3.036 | 34.974 | 72.473 |
| 3.038 | 34.987 | 72.392 |
| 3.04 | 35 | 72.31 |
| 3.042 | 35.013 | 72.229 |
| 3.044 | 35.027 | 72.148 |
| 3.046 | 35.041 | 72.066 |
| 3.048 | 35.055 | 71.985 |
| 3.05 | 35.069 | 71.905 |
| 3.052 | 35.083 | 71.824 |
| 3.054 | 35.097 | 71.743 |
| 3.056 | 35.112 | 71.663 |
| 3.058 | 35.126 | 71.582 |
| 3.06 | 35.141 | 71.502 |
| 3.062 | 35.156 | 71.422 |
| 3.064 | 35.171 | 71.342 |
| 3.066 | 35.186 | 71.262 |
| 3.068 | 35.202 | 71.182 |
| 3.07 | 35.217 | 71.102 |
| 3.072 | 35.233 | 71.022 |
| 3.074 | 35.249 | 70.943 |
| 3.076 | 35.265 | 70.864 |
| 3.078 | 35.281 | 70.784 |
| 3.08 | 35.297 | 70.705 |
| 3.082 | 35.314 | 70.626 |
| 3.084 | 35.33 | 70.547 |
| 3.086 | 35.347 | 70.469 |
| 3.088 | 35.364 | 70.39 |
| 3.09 | 35.381 | 70.311 |
| 3.092 | 35.398 | 70.233 |
| 3.094 | 35.415 | 70.155 |
| 3.096 | 35.432 | 70.076 |
| 3.098 | 35.45 | 69.998 |
| 3.1 | 35.468 | 69.92 |
| 3.102 | 35.486 | 69.843 |
| 3.104 | 35.504 | 69.765 |
| 3.106 | 35.522 | 69.687 |
| 3.108 | 35.54 | 69.61 |
| 3.11 | 35.559 | 69.532 |
| 3.112 | 35.577 | 69.455 |
| 3.114 | 35.596 | 69.378 |
| 3.116 | 35.615 | 69.301 |
| 3.118 | 35.634 | 69.224 |
| 3.12 | 35.653 | 69.147 |
| 3.122 | 35.673 | 69.071 |
| 3.124 | 35.692 | 68.994 |
| 3.126 | 35.712 | 68.918 |
| 3.128 | 35.731 | 68.841 |
| 3.13 | 35.751 | 68.765 |
| 3.132 | 35.771 | 68.689 |
| 3.134 | 35.792 | 68.613 |
| 3.136 | 35.812 | 68.537 |
| 3.138 | 35.833 | 68.462 |
| 3.14 | 35.853 | 68.386 |
| 3.142 | 35.874 | 68.31 |
| 3.144 | 35.895 | 68.235 |
| 3.146 | 35.916 | 68.16 |
| 3.148 | 35.937 | 68.085 |
| 3.15 | 35.959 | 68.01 |
| 3.152 | 35.98 | 67.935 |
| 3.154 | 36.002 | 67.86 |
| 3.156 | 36.024 | 67.785 |
| 3.158 | 36.046 | 67.711 |
| 3.16 | 36.068 | 67.637 |
| 3.162 | 36.09 | 67.562 |
| 3.164 | 36.113 | 67.488 |
| 3.166 | 36.135 | 67.414 |
| 3.168 | 36.158 | 67.34 |
| 3.17 | 36.181 | 67.266 |
| 3.172 | 36.204 | 67.193 |
| 3.174 | 36.227 | 67.119 |
| 3.176 | 36.251 | 67.046 |
| 3.178 | 36.274 | 66.972 |
| 3.18 | 36.298 | 66.899 |
| 3.182 | 36.321 | 66.826 |
| 3.184 | 36.345 | 66.753 |
| 3.186 | 36.369 | 66.68 |
| 3.188 | 36.394 | 66.607 |
| 3.19 | 36.418 | 66.535 |
| 3.192 | 36.443 | 66.462 |
| 3.194 | 36.467 | 66.39 |
| 3.196 | 36.492 | 66.318 |
| 3.198 | 36.517 | 66.246 |
| 3.2 | 36.542 | 66.174 |
| 3.202 | 36.567 | 66.102 |
| 3.204 | 36.593 | 66.03 |
| 3.206 | 36.618 | 65.958 |
| 3.208 | 36.644 | 65.887 |
| 3.21 | 36.67 | 65.815 |
| 3.212 | 36.696 | 65.744 |
| 3.214 | 36.722 | 65.673 |
| 3.216 | 36.748 | 65.602 |
| 3.218 | 36.775 | 65.531 |
| 3.22 | 36.802 | 65.46 |
| 3.222 | 36.828 | 65.389 |
| 3.224 | 36.855 | 65.319 |
| 3.226 | 36.882 | 65.248 |
| 3.228 | 36.909 | 65.178 |
| 3.23 | 36.937 | 65.108 |
| 3.232 | 36.964 | 65.038 |
| 3.234 | 36.992 | 64.968 |
| 3.236 | 37.02 | 64.898 |
| 3.238 | 37.048 | 64.828 |
| 3.24 | 37.076 | 64.758 |
| 3.242 | 37.104 | 64.689 |
| 3.244 | 37.132 | 64.62 |
| 3.246 | 37.161 | 64.55 |
| 3.248 | 37.19 | 64.481 |
| 3.25 | 37.219 | 64.412 |
| 3.252 | 37.248 | 64.343 |
| 3.254 | 37.277 | 64.275 |
| 3.256 | 37.306 | 64.206 |
| 3.258 | 37.336 | 64.137 |
| 3.26 | 37.365 | 64.069 |
| 3.262 | 37.395 | 64.001 |
| 3.264 | 37.425 | 63.932 |
| 3.266 | 37.455 | 63.864 |
| 3.268 | 37.485 | 63.797 |
| 3.27 | 37.515 | 63.729 |
| 3.272 | 37.546 | 63.661 |
| 3.274 | 37.577 | 63.593 |
| 3.276 | 37.607 | 63.526 |
| 3.278 | 37.638 | 63.459 |
| 3.28 | 37.67 | 63.391 |
| 3.282 | 37.701 | 63.324 |
| 3.284 | 37.732 | 63.257 |
| 3.286 | 37.764 | 63.191 |
| 3.288 | 37.796 | 63.124 |
| 3.29 | 37.828 | 63.057 |
| 3.292 | 37.86 | 62.991 |
| 3.294 | 37.892 | 62.924 |
| 3.296 | 37.924 | 62.858 |
| 3.298 | 37.957 | 62.792 |
| 3.3 | 37.989 | 62.726 |
| 3.302 | 38.022 | 62.66 |
| 3.304 | 38.055 | 62.594 |
| 3.306 | 38.088 | 62.529 |
| 3.308 | 38.121 | 62.463 |
| 3.31 | 38.155 | 62.398 |
| 3.312 | 38.188 | 62.333 |
| 3.314 | 38.222 | 62.267 |
| 3.316 | 38.256 | 62.202 |
| 3.318 | 38.29 | 62.137 |
| 3.32 | 38.324 | 62.073 |
| 3.322 | 38.359 | 62.008 |
| 3.324 | 38.393 | 61.943 |
| 3.326 | 38.428 | 61.879 |
| 3.328 | 38.463 | 61.815 |
| 3.33 | 38.498 | 61.751 |
| 3.332 | 38.533 | 61.686 |
| 3.334 | 38.568 | 61.623 |
| 3.336 | 38.603 | 61.559 |
| 3.338 | 38.639 | 61.495 |
| 3.34 | 38.675 | 61.431 |
| 3.342 | 38.711 | 61.368 |
| 3.344 | 38.747 | 61.305 |
| 3.346 | 38.783 | 61.241 |
| 3.348 | 38.819 | 61.178 |
| 3.35 | 38.856 | 61.115 |
| 3.352 | 38.893 | 61.052 |
| 3.354 | 38.929 | 60.99 |
| 3.356 | 38.966 | 60.927 |
| 3.358 | 39.004 | 60.865 |
| 3.36 | 39.041 | 60.802 |
| 3.362 | 39.078 | 60.74 |
| 3.364 | 39.116 | 60.678 |
| 3.366 | 39.154 | 60.616 |
| 3.368 | 39.192 | 60.554 |
| 3.37 | 39.23 | 60.492 |
| 3.372 | 39.268 | 60.43 |
| 3.374 | 39.307 | 60.369 |
| 3.376 | 39.345 | 60.307 |
| 3.378 | 39.384 | 60.246 |
| 3.38 | 39.423 | 60.185 |
| 3.382 | 39.462 | 60.124 |
| 3.384 | 39.501 | 60.063 |
| 3.386 | 39.54 | 60.002 |
| 3.388 | 39.58 | 59.941 |
| 3.39 | 39.62 | 59.881 |
| 3.392 | 39.66 | 59.82 |
| 3.394 | 39.7 | 59.76 |
| 3.396 | 39.74 | 59.7 |
| 3.398 | 39.78 | 59.64 |
| 3.4 | 39.821 | 59.58 |
| 3.402 | 39.861 | 59.52 |
| 3.404 | 39.902 | 59.46 |
| 3.406 | 39.943 | 59.401 |
| 3.408 | 39.984 | 59.341 |
| 3.41 | 40.025 | 59.282 |
| 3.412 | 40.067 | 59.223 |
| 3.414 | 40.109 | 59.163 |
| 3.416 | 40.15 | 59.104 |
| 3.418 | 40.192 | 59.046 |
| 3.42 | 40.234 | 58.987 |
| 3.422 | 40.277 | 58.928 |
| 3.424 | 40.319 | 58.87 |
| 3.426 | 40.362 | 58.811 |
| 3.428 | 40.404 | 58.753 |
| 3.43 | 40.447 | 58.695 |
| 3.432 | 40.49 | 58.637 |
| 3.434 | 40.534 | 58.579 |
| 3.436 | 40.577 | 58.521 |
| 3.438 | 40.621 | 58.463 |
| 3.44 | 40.664 | 58.406 |
| 3.442 | 40.708 | 58.348 |
| 3.444 | 40.752 | 58.291 |
| 3.446 | 40.797 | 58.234 |
| 3.448 | 40.841 | 58.177 |
| 3.45 | 40.886 | 58.12 |
| 3.452 | 40.93 | 58.063 |
| 3.454 | 40.975 | 58.006 |
| 3.456 | 41.02 | 57.95 |
| 3.458 | 41.066 | 57.893 |
| 3.46 | 41.111 | 57.837 |
| 3.462 | 41.156 | 57.781 |
| 3.464 | 41.202 | 57.725 |
| 3.466 | 41.248 | 57.669 |
| 3.468 | 41.294 | 57.613 |
| 3.47 | 41.34 | 57.557 |
| 3.472 | 41.387 | 57.501 |
| 3.474 | 41.433 | 57.446 |
| 3.476 | 41.48 | 57.39 |
| 3.478 | 41.527 | 57.335 |
| 3.48 | 41.574 | 57.28 |
| 3.482 | 41.621 | 57.225 |
| 3.484 | 41.669 | 57.17 |
| 3.486 | 41.716 | 57.115 |
| 3.488 | 41.764 | 57.061 |
| 3.49 | 41.812 | 57.006 |
| 3.492 | 41.86 | 56.952 |
| 3.494 | 41.908 | 56.897 |
| 3.496 | 41.957 | 56.843 |
| 3.498 | 42.005 | 56.789 |
| 3.5 | 42.054 | 56.735 |
| 3.502 | 42.103 | 56.681 |
| 3.504 | 42.152 | 56.628 |
| 3.506 | 42.201 | 56.574 |
| 3.508 | 42.251 | 56.521 |
| 3.51 | 42.3 | 56.467 |
| 3.512 | 42.35 | 56.414 |
| 3.514 | 42.4 | 56.361 |
| 3.516 | 42.45 | 56.308 |
| 3.518 | 42.5 | 56.255 |
| 3.52 | 42.551 | 56.202 |
| 3.522 | 42.601 | 56.15 |
| 3.524 | 42.652 | 56.097 |
| 3.526 | 42.703 | 56.045 |
| 3.528 | 42.754 | 55.993 |
| 3.53 | 42.806 | 55.94 |
| 3.532 | 42.857 | 55.888 |
| 3.534 | 42.909 | 55.837 |
| 3.536 | 42.961 | 55.785 |
| 3.538 | 43.013 | 55.733 |
| 3.54 | 43.065 | 55.682 |
| 3.542 | 43.117 | 55.63 |
| 3.544 | 43.17 | 55.579 |
| 3.546 | 43.222 | 55.528 |
| 3.548 | 43.275 | 55.477 |
| 3.55 | 43.328 | 55.426 |
| 3.552 | 43.382 | 55.375 |
| 3.554 | 43.435 | 55.324 |
| 3.556 | 43.489 | 55.274 |
| 3.558 | 43.542 | 55.223 |
| 3.56 | 43.596 | 55.173 |
| 3.562 | 43.65 | 55.123 |
| 3.564 | 43.705 | 55.073 |
| 3.566 | 43.759 | 55.023 |
| 3.568 | 43.814 | 54.973 |
| 3.57 | 43.869 | 54.923 |
| 3.572 | 43.924 | 54.873 |
| 3.574 | 43.979 | 54.824 |
| 3.576 | 44.034 | 54.775 |
| 3.578 | 44.09 | 54.725 |
| 3.58 | 44.145 | 54.676 |
| 3.582 | 44.201 | 54.627 |
| 3.584 | 44.257 | 54.578 |
| 3.586 | 44.314 | 54.529 |
| 3.588 | 44.37 | 54.481 |
| 3.59 | 44.427 | 54.432 |
| 3.592 | 44.484 | 54.384 |
| 3.594 | 44.541 | 54.336 |
| 3.596 | 44.598 | 54.287 |
| 3.598 | 44.655 | 54.239 |
| 3.6 | 44.713 | 54.191 |
| 3.602 | 44.77 | 54.144 |
| 3.604 | 44.828 | 54.096 |
| 3.606 | 44.886 | 54.048 |
| 3.608 | 44.944 | 54.001 |
| 3.61 | 45.003 | 53.954 |
| 3.612 | 45.061 | 53.906 |
| 3.614 | 45.12 | 53.859 |
| 3.616 | 45.179 | 53.812 |
| 3.618 | 45.238 | 53.766 |
| 3.62 | 45.298 | 53.719 |
| 3.622 | 45.357 | 53.672 |
| 3.624 | 45.417 | 53.626 |
| 3.626 | 45.477 | 53.579 |
| 3.628 | 45.537 | 53.533 |
| 3.63 | 45.597 | 53.487 |
| 3.632 | 45.658 | 53.441 |
| 3.634 | 45.718 | 53.395 |
| 3.636 | 45.779 | 53.349 |
| 3.638 | 45.84 | 53.304 |
| 3.64 | 45.901 | 53.258 |
| 3.642 | 45.963 | 53.213 |
| 3.644 | 46.024 | 53.168 |
| 3.646 | 46.086 | 53.122 |
| 3.648 | 46.148 | 53.077 |
| 3.65 | 46.21 | 53.032 |
| 3.652 | 46.272 | 52.988 |
| 3.654 | 46.335 | 52.943 |
| 3.656 | 46.397 | 52.898 |
| 3.658 | 46.46 | 52.854 |
| 3.66 | 46.523 | 52.81 |
| 3.662 | 46.587 | 52.765 |
| 3.664 | 46.65 | 52.721 |
| 3.666 | 46.714 | 52.677 |
| 3.668 | 46.778 | 52.634 |
| 3.67 | 46.842 | 52.59 |
| 3.672 | 46.906 | 52.546 |
| 3.674 | 46.97 | 52.503 |
| 3.676 | 47.035 | 52.459 |
| 3.678 | 47.1 | 52.416 |
| 3.68 | 47.164 | 52.373 |
| 3.682 | 47.23 | 52.33 |
| 3.684 | 47.295 | 52.287 |
| 3.686 | 47.36 | 52.244 |
| 3.688 | 47.426 | 52.202 |
| 3.69 | 47.492 | 52.159 |
| 3.692 | 47.558 | 52.117 |
| 3.694 | 47.625 | 52.075 |
| 3.696 | 47.691 | 52.032 |
| 3.698 | 47.758 | 51.99 |
| 3.7 | 47.825 | 51.949 |
| 3.702 | 47.892 | 51.907 |
| 3.704 | 47.959 | 51.865 |
| 3.706 | 48.026 | 51.824 |
| 3.708 | 48.094 | 51.782 |
| 3.71 | 48.162 | 51.741 |
| 3.712 | 48.23 | 51.7 |
| 3.714 | 48.298 | 51.659 |
| 3.716 | 48.367 | 51.618 |
| 3.718 | 48.435 | 51.577 |
| 3.72 | 48.504 | 51.536 |
| 3.722 | 48.573 | 51.496 |
| 3.724 | 48.642 | 51.455 |
| 3.726 | 48.712 | 51.415 |
| 3.728 | 48.781 | 51.375 |
| 3.73 | 48.851 | 51.334 |
| 3.732 | 48.921 | 51.294 |
| 3.734 | 48.992 | 51.255 |
| 3.736 | 49.062 | 51.215 |
| 3.738 | 49.133 | 51.175 |
| 3.74 | 49.203 | 51.136 |
| 3.742 | 49.274 | 51.096 |
| 3.744 | 49.346 | 51.057 |
| 3.746 | 49.417 | 51.018 |
| 3.748 | 49.489 | 50.979 |
| 3.75 | 49.56 | 50.94 |
| 3.752 | 49.632 | 50.901 |
| 3.754 | 49.705 | 50.863 |
| 3.756 | 49.777 | 50.824 |
| 3.758 | 49.85 | 50.786 |
| 3.76 | 49.922 | 50.748 |
| 3.762 | 49.995 | 50.709 |
| 3.764 | 50.069 | 50.671 |
| 3.766 | 50.142 | 50.633 |
| 3.768 | 50.216 | 50.596 |
| 3.77 | 50.29 | 50.558 |
| 3.772 | 50.364 | 50.52 |
| 3.774 | 50.438 | 50.483 |
| 3.776 | 50.512 | 50.446 |
| 3.778 | 50.587 | 50.408 |
| 3.78 | 50.662 | 50.371 |
| 3.782 | 50.737 | 50.334 |
| 3.784 | 50.812 | 50.298 |
| 3.786 | 50.888 | 50.261 |
| 3.788 | 50.963 | 50.224 |
| 3.79 | 51.039 | 50.188 |
| 3.792 | 51.115 | 50.152 |
| 3.794 | 51.191 | 50.115 |
| 3.796 | 51.268 | 50.079 |
| 3.798 | 51.345 | 50.043 |
| 3.8 | 51.422 | 50.007 |
| 3.802 | 51.499 | 49.972 |
| 3.804 | 51.576 | 49.936 |
| 3.806 | 51.654 | 49.901 |
| 3.808 | 51.731 | 49.865 |
| 3.81 | 51.809 | 49.83 |
| 3.812 | 51.887 | 49.795 |
| 3.814 | 51.966 | 49.76 |
| 3.816 | 52.044 | 49.725 |
| 3.818 | 52.123 | 49.69 |
| 3.82 | 52.202 | 49.656 |
| 3.822 | 52.281 | 49.621 |
| 3.824 | 52.361 | 49.587 |
| 3.826 | 52.44 | 49.552 |
| 3.828 | 52.52 | 49.518 |
| 3.83 | 52.6 | 49.484 |
| 3.832 | 52.68 | 49.45 |
| 3.834 | 52.761 | 49.417 |
| 3.836 | 52.842 | 49.383 |
| 3.838 | 52.922 | 49.349 |
| 3.84 | 53.004 | 49.316 |
| 3.842 | 53.085 | 49.283 |
| 3.844 | 53.166 | 49.25 |
| 3.846 | 53.248 | 49.217 |
| 3.848 | 53.33 | 49.184 |
| 3.85 | 53.412 | 49.151 |
| 3.852 | 53.495 | 49.118 |
| 3.854 | 53.577 | 49.086 |
| 3.856 | 53.66 | 49.053 |
| 3.858 | 53.743 | 49.021 |
| 3.86 | 53.826 | 48.989 |
| 3.862 | 53.91 | 48.957 |
| 3.864 | 53.994 | 48.925 |
| 3.866 | 54.077 | 48.893 |
| 3.868 | 54.162 | 48.861 |
| 3.87 | 54.246 | 48.83 |
| 3.872 | 54.33 | 48.798 |
| 3.874 | 54.415 | 48.767 |
| 3.876 | 54.5 | 48.736 |
| 3.878 | 54.585 | 48.705 |
| 3.88 | 54.671 | 48.674 |
| 3.882 | 54.756 | 48.643 |
| 3.884 | 54.842 | 48.612 |
| 3.886 | 54.928 | 48.582 |
| 3.888 | 55.015 | 48.551 |
| 3.89 | 55.101 | 48.521 |
| 3.892 | 55.188 | 48.491 |
| 3.894 | 55.275 | 48.461 |
| 3.896 | 55.362 | 48.431 |
| 3.898 | 55.449 | 48.401 |
| 3.9 | 55.537 | 48.371 |
| 3.902 | 55.625 | 48.341 |
| 3.904 | 55.713 | 48.312 |
| 3.906 | 55.801 | 48.283 |
| 3.908 | 55.89 | 48.253 |
| 3.91 | 55.978 | 48.224 |
| 3.912 | 56.067 | 48.195 |
| 3.914 | 56.156 | 48.167 |
| 3.916 | 56.246 | 48.138 |
| 3.918 | 56.335 | 48.109 |
| 3.92 | 56.425 | 48.081 |
| 3.922 | 56.515 | 48.052 |
| 3.924 | 56.606 | 48.024 |
| 3.926 | 56.696 | 47.996 |
| 3.928 | 56.787 | 47.968 |
| 3.93 | 56.878 | 47.94 |
| 3.932 | 56.969 | 47.913 |
| 3.934 | 57.06 | 47.885 |
| 3.936 | 57.152 | 47.858 |
| 3.938 | 57.244 | 47.83 |
| 3.94 | 57.336 | 47.803 |
| 3.942 | 57.428 | 47.776 |
| 3.944 | 57.521 | 47.749 |
| 3.946 | 57.613 | 47.722 |
| 3.948 | 57.706 | 47.695 |
| 3.95 | 57.8 | 47.669 |
| 3.952 | 57.893 | 47.642 |
| 3.954 | 57.987 | 47.616 |
| 3.956 | 58.081 | 47.59 |
| 3.958 | 58.175 | 47.564 |
| 3.96 | 58.269 | 47.538 |
| 3.962 | 58.364 | 47.512 |
| 3.964 | 58.458 | 47.486 |
| 3.966 | 58.553 | 47.461 |
| 3.968 | 58.649 | 47.435 |
| 3.97 | 58.744 | 47.41 |
| 3.972 | 58.84 | 47.385 |
| 3.974 | 58.936 | 47.36 |
| 3.976 | 59.032 | 47.335 |
| 3.978 | 59.129 | 47.31 |
| 3.98 | 59.225 | 47.285 |
| 3.982 | 59.322 | 47.261 |
| 3.984 | 59.419 | 47.236 |
| 3.986 | 59.516 | 47.212 |
| 3.988 | 59.614 | 47.188 |
| 3.99 | 59.712 | 47.164 |
| 3.992 | 59.81 | 47.14 |
| 3.994 | 59.908 | 47.116 |
| 3.996 | 60.007 | 47.092 |
| 3.998 | 60.105 | 47.069 |
| 4.0 | 55.204 | 47.045 |
| 4.002 | 55.295 | 47.016 |
| 4.004 | 55.387 | 46.987 |
| 4.006 | 55.478 | 46.958 |
| 4.008 | 55.57 | 46.93 |
| 4.01 | 55.661 | 46.901 |
| 4.012 | 55.754 | 46.872 |
| 4.014 | 55.846 | 46.844 |
| 4.016 | 55.939 | 46.816 |
| 4.018 | 56.031 | 46.788 |
| 4.02 | 56.124 | 46.759 |
| 4.022 | 56.218 | 46.732 |
| 4.024 | 56.311 | 46.704 |
| 4.026 | 56.405 | 46.676 |
| 4.028 | 56.499 | 46.649 |
| 4.03 | 56.593 | 46.621 |
| 4.032 | 56.688 | 46.594 |
| 4.034 | 56.782 | 46.567 |
| 4.036 | 56.877 | 46.54 |
| 4.038 | 56.972 | 46.513 |
| 4.04 | 57.068 | 46.486 |
| 4.042 | 57.163 | 46.459 |
| 4.044 | 57.259 | 46.433 |
| 4.046 | 57.355 | 46.406 |
| 4.048 | 57.452 | 46.38 |
| 4.05 | 57.548 | 46.354 |
| 4.052 | 57.645 | 46.328 |
| 4.054 | 57.742 | 46.302 |
| 4.056 | 57.839 | 46.276 |
| 4.058 | 57.937 | 46.251 |
| 4.06 | 58.035 | 46.225 |
| 4.062 | 58.133 | 46.2 |
| 4.064 | 58.231 | 46.175 |
| 4.066 | 58.329 | 46.149 |
| 4.068 | 58.428 | 46.124 |
| 4.07 | 58.527 | 46.1 |
| 4.072 | 58.626 | 46.075 |
| 4.074 | 58.726 | 46.05 |
| 4.076 | 58.825 | 46.026 |
| 4.078 | 58.925 | 46.001 |
| 4.08 | 59.026 | 45.977 |
| 4.082 | 59.126 | 45.953 |
| 4.084 | 59.227 | 45.929 |
| 4.086 | 59.327 | 45.905 |
| 4.088 | 59.429 | 45.881 |
| 4.09 | 59.53 | 45.858 |
| 4.092 | 59.632 | 45.834 |
| 4.094 | 59.734 | 45.811 |
| 4.096 | 59.836 | 45.788 |
| 4.098 | 59.938 | 45.765 |
| 4.1 | 60.041 | 45.742 |
| 4.102 | 60.143 | 45.719 |
| 4.104 | 60.247 | 45.696 |
| 4.106 | 60.35 | 45.674 |
| 4.108 | 60.453 | 45.651 |
| 4.11 | 60.557 | 45.629 |
| 4.112 | 60.661 | 45.607 |
| 4.114 | 60.766 | 45.585 |
| 4.116 | 60.87 | 45.563 |
| 4.118 | 60.975 | 45.541 |
| 4.12 | 61.08 | 45.519 |
| 4.122 | 61.185 | 45.498 |
| 4.124 | 61.291 | 45.476 |
| 4.126 | 61.397 | 45.455 |
| 4.128 | 61.503 | 45.434 |
| 4.13 | 61.609 | 45.413 |
| 4.132 | 61.716 | 45.392 |
| 4.134 | 61.822 | 45.371 |
| 4.136 | 61.929 | 45.351 |
| 4.138 | 62.037 | 45.33 |
| 4.14 | 62.144 | 45.31 |
| 4.142 | 62.252 | 45.29 |
| 4.144 | 62.36 | 45.27 |
| 4.146 | 62.468 | 45.25 |
| 4.148 | 62.577 | 45.23 |
| 4.15 | 62.686 | 45.21 |
| 4.152 | 62.795 | 45.191 |
| 4.154 | 62.904 | 45.171 |
| 4.156 | 63.014 | 45.152 |
| 4.158 | 63.123 | 45.133 |
| 4.16 | 63.233 | 45.114 |
| 4.162 | 63.344 | 45.095 |
| 4.164 | 63.454 | 45.076 |
| 4.166 | 63.565 | 45.057 |
| 4.168 | 63.676 | 45.039 |
| 4.17 | 63.787 | 45.02 |
| 4.172 | 63.899 | 45.002 |
| 4.174 | 64.011 | 44.984 |
| 4.176 | 64.123 | 44.966 |
| 4.178 | 64.235 | 44.948 |
| 4.18 | 64.348 | 44.93 |
| 4.182 | 64.461 | 44.913 |
| 4.184 | 64.574 | 44.895 |
| 4.186 | 64.687 | 44.878 |
| 4.188 | 64.801 | 44.861 |
| 4.19 | 64.915 | 44.844 |
| 4.192 | 65.029 | 44.827 |
| 4.194 | 65.143 | 44.81 |
| 4.196 | 65.258 | 44.794 |
| 4.198 | 65.372 | 44.777 |
| 4.2 | 65.488 | 44.761 |
| 4.202 | 65.603 | 44.744 |
| 4.204 | 65.719 | 44.728 |
| 4.206 | 65.835 | 44.712 |
| 4.208 | 65.951 | 44.697 |
| 4.21 | 66.067 | 44.681 |
| 4.212 | 66.184 | 44.665 |
| 4.214 | 66.301 | 44.65 |
| 4.216 | 66.418 | 44.635 |
| 4.218 | 66.535 | 44.619 |
| 4.22 | 66.653 | 44.604 |
| 4.222 | 66.771 | 44.589 |
| 4.224 | 66.889 | 44.575 |
| 4.226 | 67.008 | 44.56 |
| 4.228 | 67.126 | 44.546 |
| 4.23 | 67.245 | 44.531 |
| 4.232 | 67.365 | 44.517 |
| 4.234 | 67.484 | 44.503 |
| 4.236 | 67.604 | 44.489 |
| 4.238 | 67.724 | 44.475 |
| 4.24 | 67.844 | 44.462 |
| 4.242 | 67.965 | 44.448 |
| 4.244 | 68.086 | 44.435 |
| 4.246 | 68.207 | 44.422 |
| 4.248 | 68.328 | 44.408 |
| 4.25 | 68.45 | 44.396 |
| 4.252 | 68.572 | 44.383 |
| 4.254 | 68.694 | 44.37 |
| 4.256 | 68.816 | 44.357 |
| 4.258 | 68.939 | 44.345 |
| 4.26 | 69.062 | 44.333 |
| 4.262 | 69.185 | 44.321 |
| 4.264 | 69.308 | 44.309 |
| 4.266 | 69.432 | 44.297 |
| 4.268 | 69.556 | 44.285 |
| 4.27 | 69.68 | 44.274 |
| 4.272 | 69.804 | 44.262 |
| 4.274 | 69.929 | 44.251 |
| 4.276 | 70.054 | 44.24 |
| 4.278 | 70.179 | 44.229 |
| 4.28 | 70.305 | 44.218 |
| 4.282 | 70.431 | 44.207 |
| 4.284 | 70.557 | 44.197 |
| 4.286 | 70.683 | 44.186 |
| 4.288 | 70.81 | 44.176 |
| 4.29 | 70.937 | 44.166 |
| 4.292 | 71.064 | 44.156 |
| 4.294 | 71.191 | 44.146 |
| 4.296 | 71.319 | 44.136 |
| 4.298 | 71.446 | 44.127 |
| 4.3 | 71.575 | 44.117 |
| 4.302 | 71.703 | 44.108 |
| 4.304 | 71.832 | 44.099 |
| 4.306 | 71.961 | 44.09 |
| 4.308 | 72.09 | 44.081 |
| 4.31 | 72.219 | 44.072 |
| 4.312 | 72.349 | 44.064 |
| 4.314 | 72.479 | 44.055 |
| 4.316 | 72.609 | 44.047 |
| 4.318 | 72.74 | 44.039 |
| 4.32 | 72.871 | 44.031 |
| 4.322 | 73.002 | 44.023 |
| 4.324 | 73.133 | 44.015 |
| 4.326 | 73.265 | 44.008 |
| 4.328 | 73.396 | 44 |
| 4.33 | 73.529 | 43.993 |
| 4.332 | 73.661 | 43.986 |
| 4.334 | 73.794 | 43.979 |
| 4.336 | 73.927 | 43.972 |
| 4.338 | 74.06 | 43.965 |
| 4.34 | 74.193 | 43.959 |
| 4.342 | 74.327 | 43.952 |
| 4.344 | 74.461 | 43.946 |
| 4.346 | 74.595 | 43.94 |
| 4.348 | 74.73 | 43.934 |
| 4.35 | 74.864 | 43.928 |
| 4.352 | 74.999 | 43.923 |
| 4.354 | 75.135 | 43.917 |
| 4.356 | 75.27 | 43.912 |
| 4.358 | 75.406 | 43.907 |
| 4.36 | 75.542 | 43.902 |
| 4.362 | 75.678 | 43.897 |
| 4.364 | 75.815 | 43.892 |
| 4.366 | 75.952 | 43.887 |
| 4.368 | 76.089 | 43.883 |
| 4.37 | 76.226 | 43.879 |
| 4.372 | 76.364 | 43.875 |
| 4.374 | 76.502 | 43.871 |
| 4.376 | 76.64 | 43.867 |
| 4.378 | 76.779 | 43.863 |
| 4.38 | 76.917 | 43.859 |
| 4.382 | 77.056 | 43.856 |
| 4.384 | 77.196 | 43.853 |
| 4.386 | 77.335 | 43.85 |
| 4.388 | 77.475 | 43.847 |
| 4.39 | 77.615 | 43.844 |
| 4.392 | 77.755 | 43.842 |
| 4.394 | 77.896 | 43.839 |
| 4.396 | 78.037 | 43.837 |
| 4.398 | 78.178 | 43.835 |
| 4.4 | 78.319 | 43.833 |
| 4.402 | 78.461 | 43.831 |
| 4.404 | 78.603 | 43.829 |
| 4.406 | 78.745 | 43.828 |
| 4.408 | 78.887 | 43.826 |
| 4.41 | 79.03 | 43.825 |
| 4.412 | 79.173 | 43.824 |
| 4.414 | 79.316 | 43.823 |
| 4.416 | 79.46 | 43.822 |
| 4.418 | 79.603 | 43.822 |
| 4.42 | 79.747 | 43.821 |
| 4.422 | 79.892 | 43.821 |
| 4.424 | 80.036 | 43.821 |
| 4.426 | 80.181 | 43.821 |
| 4.428 | 80.326 | 43.821 |
| 4.43 | 80.471 | 43.821 |
| 4.432 | 80.617 | 43.822 |
| 4.434 | 80.763 | 43.823 |
| 4.436 | 80.909 | 43.823 |
| 4.438 | 81.055 | 43.824 |
| 4.44 | 81.202 | 43.826 |
| 4.442 | 81.349 | 43.827 |
| 4.444 | 81.496 | 43.828 |
| 4.446 | 81.643 | 43.83 |
| 4.448 | 81.791 | 43.832 |
| 4.45 | 81.939 | 43.834 |
| 4.452 | 82.087 | 43.836 |
| 4.454 | 82.235 | 43.838 |
| 4.456 | 82.384 | 43.841 |
| 4.458 | 82.533 | 43.843 |
| 4.46 | 82.682 | 43.846 |
| 4.462 | 82.832 | 43.849 |
| 4.464 | 82.981 | 43.852 |
| 4.466 | 83.131 | 43.855 |
| 4.468 | 83.282 | 43.859 |
| 4.47 | 83.432 | 43.862 |
| 4.472 | 83.583 | 43.866 |
| 4.474 | 83.734 | 43.87 |
| 4.476 | 83.885 | 43.874 |
| 4.478 | 84.037 | 43.878 |
| 4.48 | 84.188 | 43.883 |
| 4.482 | 84.34 | 43.887 |
| 4.484 | 84.493 | 43.892 |
| 4.486 | 84.645 | 43.897 |
| 4.488 | 84.798 | 43.902 |
| 4.49 | 84.951 | 43.907 |
| 4.492 | 85.104 | 43.913 |
| 4.494 | 85.258 | 43.919 |
| 4.496 | 85.412 | 43.924 |
| 4.498 | 85.566 | 43.93 |
| 4.5 | 85.72 | 43.936 |
| 4.502 | 85.875 | 43.943 |
| 4.504 | 86.029 | 43.949 |
| 4.506 | 86.185 | 43.956 |
| 4.508 | 86.34 | 43.963 |
| 4.51 | 86.495 | 43.969 |
| 4.512 | 86.651 | 43.977 |
| 4.514 | 86.807 | 43.984 |
| 4.516 | 86.964 | 43.991 |
| 4.518 | 87.12 | 43.999 |
| 4.52 | 87.277 | 44.007 |
| 4.522 | 87.434 | 44.015 |
| 4.524 | 87.591 | 44.023 |
| 4.526 | 87.749 | 44.031 |
| 4.528 | 87.907 | 44.04 |
| 4.53 | 88.065 | 44.049 |
| 4.532 | 88.223 | 44.058 |
| 4.534 | 88.382 | 44.067 |
| 4.536 | 88.541 | 44.076 |
| 4.538 | 88.7 | 44.085 |
| 4.54 | 88.859 | 44.095 |
| 4.542 | 89.018 | 44.105 |
| 4.544 | 89.178 | 44.115 |
| 4.546 | 89.338 | 44.125 |
| 4.548 | 89.498 | 44.135 |
| 4.55 | 89.659 | 44.145 |
| 4.552 | 89.82 | 44.156 |
| 4.554 | 89.981 | 44.167 |
| 4.556 | 90.142 | 44.178 |
| 4.558 | 90.303 | 44.189 |
| 4.56 | 90.465 | 44.201 |
| 4.562 | 90.627 | 44.212 |
| 4.564 | 90.789 | 44.224 |
| 4.566 | 90.951 | 44.236 |
| 4.568 | 91.114 | 44.248 |
| 4.57 | 91.277 | 44.26 |
| 4.572 | 91.44 | 44.273 |
| 4.574 | 91.603 | 44.285 |
| 4.576 | 91.767 | 44.298 |
| 4.578 | 91.931 | 44.311 |
| 4.58 | 92.095 | 44.324 |
| 4.582 | 92.259 | 44.338 |
| 4.584 | 92.424 | 44.351 |
| 4.586 | 92.588 | 44.365 |
| 4.588 | 92.753 | 44.379 |
| 4.59 | 92.919 | 44.393 |
| 4.592 | 93.084 | 44.408 |
| 4.594 | 93.25 | 44.422 |
| 4.596 | 93.416 | 44.437 |
| 4.598 | 93.582 | 44.452 |
| 4.6 | 93.748 | 44.467 |
| 4.602 | 93.915 | 44.482 |
| 4.604 | 94.081 | 44.498 |
| 4.606 | 94.248 | 44.513 |
| 4.608 | 94.416 | 44.529 |
| 4.61 | 94.583 | 44.545 |
| 4.612 | 94.751 | 44.561 |
| 4.614 | 94.919 | 44.578 |
| 4.616 | 95.087 | 44.595 |
| 4.618 | 95.255 | 44.611 |
| 4.62 | 95.424 | 44.628 |
| 4.622 | 95.592 | 44.646 |
| 4.624 | 95.761 | 44.663 |
| 4.626 | 95.93 | 44.681 |
| 4.628 | 96.1 | 44.698 |
| 4.63 | 96.27 | 44.716 |
| 4.632 | 96.439 | 44.735 |
| 4.634 | 96.609 | 44.753 |
| 4.636 | 96.78 | 44.772 |
| 4.638 | 96.95 | 44.79 |
| 4.64 | 97.121 | 44.809 |
| 4.642 | 97.292 | 44.828 |
| 4.644 | 97.463 | 44.848 |
| 4.646 | 97.634 | 44.867 |
| 4.648 | 97.806 | 44.887 |
| 4.65 | 97.977 | 44.907 |
| 4.652 | 98.149 | 44.927 |
| 4.654 | 98.321 | 44.948 |
| 4.656 | 98.494 | 44.968 |
| 4.658 | 98.666 | 44.989 |
| 4.66 | 98.839 | 45.01 |
| 4.662 | 99.012 | 45.031 |
| 4.664 | 99.185 | 45.053 |
| 4.666 | 99.358 | 45.074 |
| 4.668 | 99.532 | 45.096 |
| 4.67 | 99.705 | 45.118 |
| 4.672 | 99.879 | 45.14 |
| 4.674 | 100.053 | 45.163 |
| 4.676 | 100.228 | 45.185 |
| 4.678 | 100.402 | 45.208 |
| 4.68 | 100.577 | 45.231 |
| 4.682 | 100.752 | 45.255 |
| 4.684 | 100.927 | 45.278 |
| 4.686 | 101.102 | 45.302 |
| 4.688 | 101.277 | 45.326 |
| 4.69 | 101.453 | 45.35 |
| 4.692 | 101.629 | 45.374 |
| 4.694 | 101.805 | 45.399 |
| 4.696 | 101.981 | 45.423 |
| 4.698 | 102.157 | 45.448 |
| 4.7 | 102.334 | 45.474 |
| 4.702 | 102.51 | 45.499 |
| 4.704 | 102.687 | 45.525 |
| 4.706 | 102.864 | 45.55 |
| 4.708 | 103.041 | 45.576 |
| 4.71 | 103.219 | 45.603 |
| 4.712 | 103.396 | 45.629 |
| 4.714 | 103.574 | 45.656 |
| 4.716 | 103.752 | 45.683 |
| 4.718 | 103.93 | 45.71 |
| 4.72 | 104.108 | 45.737 |
| 4.722 | 104.286 | 45.765 |
| 4.724 | 104.465 | 45.793 |
| 4.726 | 104.643 | 45.821 |
| 4.728 | 104.822 | 45.849 |
| 4.73 | 105.001 | 45.877 |
| 4.732 | 105.18 | 45.906 |
| 4.734 | 105.36 | 45.935 |
| 4.736 | 105.539 | 45.964 |
| 4.738 | 105.719 | 45.993 |
| 4.74 | 105.899 | 46.023 |
| 4.742 | 106.078 | 46.053 |
| 4.744 | 106.258 | 46.083 |
| 4.746 | 106.439 | 46.113 |
| 4.748 | 106.619 | 46.143 |
| 4.75 | 106.8 | 46.174 |
| 4.752 | 106.98 | 46.205 |
| 4.754 | 107.161 | 46.236 |
| 4.756 | 107.342 | 46.268 |
| 4.758 | 107.523 | 46.299 |
| 4.76 | 107.704 | 46.331 |
| 4.762 | 107.885 | 46.363 |
| 4.764 | 108.067 | 46.395 |
| 4.766 | 108.248 | 46.428 |
| 4.768 | 108.43 | 46.461 |
| 4.77 | 108.612 | 46.494 |
| 4.772 | 108.794 | 46.527 |
| 4.774 | 108.976 | 46.561 |
| 4.776 | 109.158 | 46.594 |
| 4.778 | 109.34 | 46.628 |
| 4.78 | 109.523 | 46.663 |
| 4.782 | 109.705 | 46.697 |
| 4.784 | 109.888 | 46.732 |
| 4.786 | 110.071 | 46.767 |
| 4.788 | 110.254 | 46.802 |
| 4.79 | 110.437 | 46.837 |
| 4.792 | 110.62 | 46.873 |
| 4.794 | 110.803 | 46.909 |
| 4.796 | 110.987 | 46.945 |
| 4.798 | 111.17 | 46.981 |
| 4.8 | 111.354 | 47.018 |
| 4.802 | 111.537 | 47.055 |
| 4.804 | 111.721 | 47.092 |
| 4.806 | 111.905 | 47.129 |
| 4.808 | 112.089 | 47.167 |
| 4.81 | 112.273 | 47.204 |
| 4.812 | 112.457 | 47.243 |
| 4.814 | 112.641 | 47.281 |
| 4.816 | 112.825 | 47.319 |
| 4.818 | 113.01 | 47.358 |
| 4.82 | 113.194 | 47.397 |
| 4.822 | 113.379 | 47.437 |
| 4.824 | 113.563 | 47.476 |
| 4.826 | 113.748 | 47.516 |
| 4.828 | 113.933 | 47.556 |
| 4.83 | 114.117 | 47.597 |
| 4.832 | 114.302 | 47.637 |
| 4.834 | 114.487 | 47.678 |
| 4.836 | 114.672 | 47.719 |
| 4.838 | 114.857 | 47.76 |
| 4.84 | 115.042 | 47.802 |
| 4.842 | 115.228 | 47.844 |
| 4.844 | 115.413 | 47.886 |
| 4.846 | 115.598 | 47.928 |
| 4.848 | 115.784 | 47.971 |
| 4.85 | 115.969 | 48.014 |
| 4.852 | 116.155 | 48.057 |
| 4.854 | 116.34 | 48.101 |
| 4.856 | 116.526 | 48.144 |
| 4.858 | 116.711 | 48.188 |
| 4.86 | 116.897 | 48.233 |
| 4.862 | 117.083 | 48.277 |
| 4.864 | 117.268 | 48.322 |
| 4.866 | 117.454 | 48.367 |
| 4.868 | 117.64 | 48.412 |
| 4.87 | 117.826 | 48.458 |
| 4.872 | 118.011 | 48.504 |
| 4.874 | 118.197 | 48.55 |
| 4.876 | 118.383 | 48.596 |
| 4.878 | 118.569 | 48.643 |
| 4.88 | 118.755 | 48.689 |
| 4.882 | 118.941 | 48.737 |
| 4.884 | 119.127 | 48.784 |
| 4.886 | 119.313 | 48.832 |
| 4.888 | 119.499 | 48.88 |
| 4.89 | 119.685 | 48.928 |
| 4.892 | 119.87 | 48.977 |
| 4.894 | 120.056 | 49.025 |
| 4.896 | 120.242 | 49.075 |
| 4.898 | 120.428 | 49.124 |
| 4.9 | 120.614 | 49.174 |
| 4.902 | 120.8 | 49.223 |
| 4.904 | 120.986 | 49.274 |
| 4.906 | 121.172 | 49.324 |
| 4.908 | 121.358 | 49.375 |
| 4.91 | 121.544 | 49.426 |
| 4.912 | 121.729 | 49.477 |
| 4.914 | 121.915 | 49.529 |
| 4.916 | 122.101 | 49.581 |
| 4.918 | 122.287 | 49.633 |
| 4.92 | 122.472 | 49.686 |
| 4.922 | 122.658 | 49.738 |
| 4.924 | 122.843 | 49.791 |
| 4.926 | 123.029 | 49.845 |
| 4.928 | 123.215 | 49.898 |
| 4.93 | 123.4 | 49.952 |
| 4.932 | 123.585 | 50.006 |
| 4.934 | 123.771 | 50.061 |
| 4.936 | 123.956 | 50.116 |
| 4.938 | 124.141 | 50.171 |
| 4.94 | 124.326 | 50.226 |
| 4.942 | 124.511 | 50.282 |
| 4.944 | 124.696 | 50.338 |
| 4.946 | 124.881 | 50.394 |
| 4.948 | 125.066 | 50.45 |
| 4.95 | 125.251 | 50.507 |
| 4.952 | 125.436 | 50.564 |
| 4.954 | 125.62 | 50.622 |
| 4.956 | 125.805 | 50.68 |
| 4.958 | 125.989 | 50.738 |
| 4.96 | 126.174 | 50.796 |
| 4.962 | 126.358 | 50.855 |
| 4.964 | 126.542 | 50.914 |
| 4.966 | 126.726 | 50.973 |
| 4.968 | 126.91 | 51.032 |
| 4.97 | 127.094 | 51.092 |
| 4.972 | 127.277 | 51.152 |
| 4.974 | 127.461 | 51.213 |
| 4.976 | 127.645 | 51.274 |
| 4.978 | 127.828 | 51.335 |
| 4.98 | 128.011 | 51.396 |
| 4.982 | 128.194 | 51.458 |
| 4.984 | 128.377 | 51.52 |
| 4.986 | 128.56 | 51.582 |
| 4.988 | 128.743 | 51.645 |
| 4.99 | 128.925 | 51.708 |
| 4.992 | 129.107 | 51.771 |
| 4.994 | 129.29 | 51.834 |
| 4.996 | 129.472 | 51.898 |
| 4.998 | 129.654 | 51.962 |
| 5.0 | 124.835 | 52.027 |
| 5.002 | 125.01 | 52.085 |
| 5.004 | 125.185 | 52.144 |
| 5.006 | 125.359 | 52.203 |
| 5.008 | 125.533 | 52.262 |
| 5.01 | 125.707 | 52.321 |
| 5.012 | 125.881 | 52.381 |
| 5.014 | 126.055 | 52.441 |
| 5.016 | 126.229 | 52.502 |
| 5.018 | 126.402 | 52.562 |
| 5.02 | 126.576 | 52.623 |
| 5.022 | 126.749 | 52.685 |
| 5.024 | 126.922 | 52.746 |
| 5.026 | 127.095 | 52.808 |
| 5.028 | 127.268 | 52.87 |
| 5.03 | 127.44 | 52.933 |
| 5.032 | 127.613 | 52.996 |
| 5.034 | 127.785 | 53.059 |
| 5.036 | 127.957 | 53.122 |
| 5.038 | 128.129 | 53.186 |
| 5.04 | 128.301 | 53.25 |
| 5.042 | 128.473 | 53.314 |
| 5.044 | 128.644 | 53.379 |
| 5.046 | 128.815 | 53.443 |
| 5.048 | 128.986 | 53.509 |
| 5.05 | 129.157 | 53.574 |
| 5.052 | 129.328 | 53.64 |
| 5.054 | 129.498 | 53.706 |
| 5.056 | 129.669 | 53.773 |
| 5.058 | 129.839 | 53.839 |
| 5.06 | 130.009 | 53.907 |
| 5.062 | 130.178 | 53.974 |
| 5.064 | 130.348 | 54.042 |
| 5.066 | 130.517 | 54.11 |
| 5.068 | 130.686 | 54.178 |
| 5.07 | 130.854 | 54.247 |
| 5.072 | 131.023 | 54.316 |
| 5.074 | 131.191 | 54.385 |
| 5.076 | 131.359 | 54.455 |
| 5.078 | 131.527 | 54.524 |
| 5.08 | 131.695 | 54.595 |
| 5.082 | 131.862 | 54.665 |
| 5.084 | 132.029 | 54.736 |
| 5.086 | 132.196 | 54.807 |
| 5.088 | 132.362 | 54.879 |
| 5.09 | 132.528 | 54.951 |
| 5.092 | 132.694 | 55.023 |
| 5.094 | 132.86 | 55.095 |
| 5.096 | 133.026 | 55.168 |
| 5.098 | 133.191 | 55.241 |
| 5.1 | 133.356 | 55.315 |
| 5.102 | 133.52 | 55.388 |
| 5.104 | 133.684 | 55.463 |
| 5.106 | 133.848 | 55.537 |
| 5.108 | 134.012 | 55.612 |
| 5.11 | 134.176 | 55.687 |
| 5.112 | 134.339 | 55.762 |
| 5.114 | 134.502 | 55.838 |
| 5.116 | 134.664 | 55.914 |
| 5.118 | 134.826 | 55.991 |
| 5.12 | 134.988 | 56.067 |
| 5.122 | 135.15 | 56.144 |
| 5.124 | 135.311 | 56.222 |
| 5.126 | 135.472 | 56.3 |
| 5.128 | 135.632 | 56.378 |
| 5.13 | 135.792 | 56.456 |
| 5.132 | 135.952 | 56.535 |
| 5.134 | 136.112 | 56.614 |
| 5.136 | 136.271 | 56.693 |
| 5.138 | 136.43 | 56.773 |
| 5.14 | 136.588 | 56.853 |
| 5.142 | 136.746 | 56.934 |
| 5.144 | 136.904 | 57.014 |
| 5.146 | 137.061 | 57.095 |
| 5.148 | 137.218 | 57.177 |
| 5.15 | 137.375 | 57.259 |
| 5.152 | 137.531 | 57.341 |
| 5.154 | 137.687 | 57.423 |
| 5.156 | 137.842 | 57.506 |
| 5.158 | 137.997 | 57.589 |
| 5.16 | 138.152 | 57.673 |
| 5.162 | 138.306 | 57.757 |
| 5.164 | 138.46 | 57.841 |
| 5.166 | 138.613 | 57.925 |
| 5.168 | 138.766 | 58.01 |
| 5.17 | 138.919 | 58.095 |
| 5.172 | 139.071 | 58.181 |
| 5.174 | 139.223 | 58.267 |
| 5.176 | 139.374 | 58.353 |
| 5.178 | 139.525 | 58.44 |
| 5.18 | 139.675 | 58.527 |
| 5.182 | 139.825 | 58.614 |
| 5.184 | 139.975 | 58.702 |
| 5.186 | 140.124 | 58.79 |
| 5.188 | 140.273 | 58.878 |
| 5.19 | 140.421 | 58.967 |
| 5.192 | 140.568 | 59.056 |
| 5.194 | 140.716 | 59.145 |
| 5.196 | 140.862 | 59.235 |
| 5.198 | 141.009 | 59.325 |
| 5.2 | 141.154 | 59.416 |
| 5.202 | 141.3 | 59.507 |
| 5.204 | 141.444 | 59.598 |
| 5.206 | 141.589 | 59.689 |
| 5.208 | 141.732 | 59.781 |
| 5.21 | 141.876 | 59.873 |
| 5.212 | 142.019 | 59.966 |
| 5.214 | 142.161 | 60.059 |
| 5.216 | 142.303 | 60.152 |
| 5.218 | 142.444 | 60.246 |
| 5.22 | 142.584 | 60.34 |
| 5.222 | 142.725 | 60.435 |
| 5.224 | 142.864 | 60.529 |
| 5.226 | 143.003 | 60.624 |
| 5.228 | 143.142 | 60.72 |
| 5.23 | 143.28 | 60.816 |
| 5.232 | 143.417 | 60.912 |
| 5.234 | 143.554 | 61.009 |
| 5.236 | 143.69 | 61.105 |
| 5.238 | 143.826 | 61.203 |
| 5.24 | 143.961 | 61.3 |
| 5.242 | 144.096 | 61.398 |
| 5.244 | 144.23 | 61.497 |
| 5.246 | 144.363 | 61.596 |
| 5.248 | 144.496 | 61.695 |
| 5.25 | 144.629 | 61.794 |
| 5.252 | 144.76 | 61.894 |
| 5.254 | 144.891 | 61.994 |
| 5.256 | 145.022 | 62.095 |
| 5.258 | 145.152 | 62.196 |
| 5.26 | 145.281 | 62.297 |
| 5.262 | 145.409 | 62.399 |
| 5.264 | 145.537 | 62.501 |
| 5.266 | 145.665 | 62.603 |
| 5.268 | 145.791 | 62.706 |
| 5.27 | 145.917 | 62.809 |
| 5.272 | 146.043 | 62.913 |
| 5.274 | 146.168 | 63.016 |
| 5.276 | 146.292 | 63.121 |
| 5.278 | 146.415 | 63.225 |
| 5.28 | 146.538 | 63.33 |
| 5.282 | 146.66 | 63.436 |
| 5.284 | 146.782 | 63.541 |
| 5.286 | 146.902 | 63.647 |
| 5.288 | 147.022 | 63.754 |
| 5.29 | 147.142 | 63.861 |
| 5.292 | 147.261 | 63.968 |
| 5.294 | 147.379 | 64.075 |
| 5.296 | 147.496 | 64.183 |
| 5.298 | 147.613 | 64.292 |
| 5.3 | 147.729 | 64.4 |
| 5.302 | 147.844 | 64.509 |
| 5.304 | 147.958 | 64.619 |
| 5.306 | 148.072 | 64.729 |
| 5.308 | 148.185 | 64.839 |
| 5.31 | 148.298 | 64.949 |
| 5.312 | 148.409 | 65.06 |
| 5.314 | 148.52 | 65.171 |
| 5.316 | 148.63 | 65.283 |
| 5.318 | 148.74 | 65.395 |
| 5.32 | 148.848 | 65.507 |
| 5.322 | 148.956 | 65.62 |
| 5.324 | 149.063 | 65.733 |
| 5.326 | 149.169 | 65.847 |
| 5.328 | 149.275 | 65.961 |
| 5.33 | 149.38 | 66.075 |
| 5.332 | 149.484 | 66.19 |
| 5.334 | 149.587 | 66.305 |
| 5.336 | 149.689 | 66.42 |
| 5.338 | 149.791 | 66.536 |
| 5.34 | 149.892 | 66.652 |
| 5.342 | 149.992 | 66.768 |
| 5.344 | 150.091 | 66.885 |
| 5.346 | 150.19 | 67.002 |
| 5.348 | 150.287 | 67.12 |
| 5.35 | 150.384 | 67.238 |
| 5.352 | 150.48 | 67.356 |
| 5.354 | 150.575 | 67.475 |
| 5.356 | 150.669 | 67.594 |
| 5.358 | 150.763 | 67.713 |
| 5.36 | 150.855 | 67.833 |
| 5.362 | 150.947 | 67.953 |
| 5.364 | 151.038 | 68.074 |
| 5.366 | 151.128 | 68.195 |
| 5.368 | 151.217 | 68.316 |
| 5.37 | 151.306 | 68.437 |
| 5.372 | 151.393 | 68.559 |
| 5.374 | 151.48 | 68.682 |
| 5.376 | 151.566 | 68.805 |
| 5.378 | 151.65 | 68.928 |
| 5.38 | 151.734 | 69.051 |
| 5.382 | 151.817 | 69.175 |
| 5.384 | 151.9 | 69.299 |
| 5.386 | 151.981 | 69.424 |
| 5.388 | 152.061 | 69.549 |
| 5.39 | 152.141 | 69.674 |
| 5.392 | 152.219 | 69.8 |
| 5.394 | 152.297 | 69.926 |
| 5.396 | 152.374 | 70.052 |
| 5.398 | 152.449 | 70.179 |
| 5.4 | 152.524 | 70.306 |
| 5.402 | 152.598 | 70.433 |
| 5.404 | 152.671 | 70.561 |
| 5.406 | 152.743 | 70.689 |
| 5.408 | 152.814 | 70.818 |
| 5.41 | 152.885 | 70.947 |
| 5.412 | 152.954 | 71.076 |
| 5.414 | 153.022 | 71.206 |
| 5.416 | 153.089 | 71.336 |
| 5.418 | 153.156 | 71.466 |
| 5.42 | 153.221 | 71.597 |
| 5.422 | 153.285 | 71.728 |
| 5.424 | 153.349 | 71.859 |
| 5.426 | 153.411 | 71.991 |
| 5.428 | 153.473 | 72.123 |
| 5.43 | 153.533 | 72.256 |
| 5.432 | 153.592 | 72.388 |
| 5.434 | 153.651 | 72.522 |
| 5.436 | 153.708 | 72.655 |
| 5.438 | 153.765 | 72.789 |
| 5.44 | 153.82 | 72.923 |
| 5.442 | 153.875 | 73.058 |
| 5.444 | 153.928 | 73.193 |
| 5.446 | 153.98 | 73.328 |
| 5.448 | 154.032 | 73.464 |
| 5.45 | 154.082 | 73.6 |
| 5.452 | 154.131 | 73.736 |
| 5.454 | 154.18 | 73.873 |
| 5.456 | 154.227 | 74.01 |
| 5.458 | 154.273 | 74.147 |
| 5.46 | 154.318 | 74.285 |
| 5.462 | 154.362 | 74.423 |
| 5.464 | 154.405 | 74.561 |
| 5.466 | 154.447 | 74.7 |
| 5.468 | 154.488 | 74.839 |
| 5.47 | 154.528 | 74.978 |
| 5.472 | 154.567 | 75.118 |
| 5.474 | 154.605 | 75.258 |
| 5.476 | 154.641 | 75.398 |
| 5.478 | 154.677 | 75.539 |
| 5.48 | 154.712 | 75.68 |
| 5.482 | 154.745 | 75.821 |
| 5.484 | 154.777 | 75.963 |
| 5.486 | 154.809 | 76.105 |
| 5.488 | 154.839 | 76.247 |
| 5.49 | 154.868 | 76.39 |
| 5.492 | 154.896 | 76.533 |
| 5.494 | 154.923 | 76.676 |
| 5.496 | 154.948 | 76.82 |
| 5.498 | 154.973 | 76.964 |
| 5.5 | 154.996 | 77.108 |
| 5.502 | 155.019 | 77.253 |
| 5.504 | 155.04 | 77.397 |
| 5.506 | 155.06 | 77.543 |
| 5.508 | 155.079 | 77.688 |
| 5.51 | 155.097 | 77.834 |
| 5.512 | 155.114 | 77.98 |
| 5.514 | 155.13 | 78.127 |
| 5.516 | 155.144 | 78.273 |
| 5.518 | 155.158 | 78.42 |
| 5.52 | 155.17 | 78.568 |
| 5.522 | 155.181 | 78.715 |
| 5.524 | 155.191 | 78.863 |
| 5.526 | 155.2 | 79.011 |
| 5.528 | 155.208 | 79.16 |
| 5.53 | 155.214 | 79.309 |
| 5.532 | 155.219 | 79.458 |
| 5.534 | 155.224 | 79.607 |
| 5.536 | 155.227 | 79.757 |
| 5.538 | 155.229 | 79.907 |
| 5.54 | 155.229 | 80.057 |
| 5.542 | 155.229 | 80.208 |
| 5.544 | 155.227 | 80.359 |
| 5.546 | 155.224 | 80.51 |
| 5.548 | 155.22 | 80.661 |
| 5.55 | 155.215 | 80.813 |
| 5.552 | 155.209 | 80.965 |
| 5.554 | 155.202 | 81.117 |
| 5.556 | 155.193 | 81.27 |
| 5.558 | 155.183 | 81.423 |
| 5.56 | 155.172 | 81.576 |
| 5.562 | 155.16 | 81.729 |
| 5.564 | 155.146 | 81.882 |
| 5.566 | 155.132 | 82.036 |
| 5.568 | 155.116 | 82.19 |
| 5.57 | 155.099 | 82.345 |
| 5.572 | 155.081 | 82.499 |
| 5.574 | 155.061 | 82.654 |
| 5.576 | 155.041 | 82.809 |
| 5.578 | 155.019 | 82.965 |
| 5.58 | 154.996 | 83.12 |
| 5.582 | 154.972 | 83.276 |
| 5.584 | 154.947 | 83.432 |
| 5.586 | 154.92 | 83.588 |
| 5.588 | 154.892 | 83.745 |
| 5.59 | 154.863 | 83.902 |
| 5.592 | 154.833 | 84.059 |
| 5.594 | 154.801 | 84.216 |
| 5.596 | 154.769 | 84.374 |
| 5.598 | 154.735 | 84.531 |
| 5.6 | 154.7 | 84.689 |
| 5.602 | 154.664 | 84.847 |
| 5.604 | 154.626 | 85.006 |
| 5.606 | 154.588 | 85.164 |
| 5.608 | 154.548 | 85.323 |
| 5.61 | 154.506 | 85.482 |
| 5.612 | 154.464 | 85.641 |
| 5.614 | 154.421 | 85.801 |
| 5.616 | 154.376 | 85.96 |
| 5.618 | 154.33 | 86.12 |
| 5.62 | 154.283 | 86.28 |
| 5.622 | 154.234 | 86.441 |
| 5.624 | 154.184 | 86.601 |
| 5.626 | 154.134 | 86.762 |
| 5.628 | 154.081 | 86.922 |
| 5.63 | 154.028 | 87.083 |
| 5.632 | 153.974 | 87.245 |
| 5.634 | 153.918 | 87.406 |
| 5.636 | 153.861 | 87.567 |
| 5.638 | 153.803 | 87.729 |
| 5.64 | 153.743 | 87.891 |
| 5.642 | 153.682 | 88.053 |
| 5.644 | 153.621 | 88.215 |
| 5.646 | 153.557 | 88.378 |
| 5.648 | 153.493 | 88.54 |
| 5.65 | 153.428 | 88.703 |
| 5.652 | 153.361 | 88.866 |
| 5.654 | 153.293 | 89.029 |
| 5.656 | 153.224 | 89.192 |
| 5.658 | 153.153 | 89.355 |
| 5.66 | 153.082 | 89.518 |
| 5.662 | 153.009 | 89.682 |
| 5.664 | 152.935 | 89.846 |
| 5.666 | 152.859 | 90.009 |
| 5.668 | 152.783 | 90.173 |
| 5.67 | 152.705 | 90.337 |
| 5.672 | 152.626 | 90.502 |
| 5.674 | 152.546 | 90.666 |
| 5.676 | 152.465 | 90.83 |
| 5.678 | 152.382 | 90.995 |
| 5.68 | 152.298 | 91.16 |
| 5.682 | 152.213 | 91.324 |
| 5.684 | 152.127 | 91.489 |
| 5.686 | 152.04 | 91.654 |
| 5.688 | 151.951 | 91.819 |
| 5.69 | 151.861 | 91.984 |
| 5.692 | 151.77 | 92.15 |
| 5.694 | 151.678 | 92.315 |
| 5.696 | 151.585 | 92.481 |
| 5.698 | 151.49 | 92.646 |
| 5.7 | 151.394 | 92.812 |
| 5.702 | 151.297 | 92.977 |
| 5.704 | 151.199 | 93.143 |
| 5.706 | 151.1 | 93.309 |
| 5.708 | 150.999 | 93.475 |
| 5.71 | 150.898 | 93.641 |
| 5.712 | 150.795 | 93.807 |
| 5.714 | 150.691 | 93.973 |
| 5.716 | 150.585 | 94.139 |
| 5.718 | 150.479 | 94.305 |
| 5.72 | 150.371 | 94.471 |
| 5.722 | 150.263 | 94.637 |
| 5.724 | 150.153 | 94.803 |
| 5.726 | 150.041 | 94.97 |
| 5.728 | 149.929 | 95.136 |
| 5.73 | 149.816 | 95.302 |
| 5.732 | 149.701 | 95.469 |
| 5.734 | 149.585 | 95.635 |
| 5.736 | 149.468 | 95.801 |
| 5.738 | 149.35 | 95.968 |
| 5.74 | 149.231 | 96.134 |
| 5.742 | 149.111 | 96.3 |
| 5.744 | 148.989 | 96.467 |
| 5.746 | 148.866 | 96.633 |
| 5.748 | 148.743 | 96.8 |
| 5.75 | 148.618 | 96.966 |
| 5.752 | 148.492 | 97.132 |
| 5.754 | 148.364 | 97.299 |
| 5.756 | 148.236 | 97.465 |
| 5.758 | 148.107 | 97.631 |
| 5.76 | 147.976 | 97.797 |
| 5.762 | 147.844 | 97.964 |
| 5.764 | 147.712 | 98.13 |
| 5.766 | 147.578 | 98.296 |
| 5.768 | 147.443 | 98.462 |
| 5.77 | 147.307 | 98.628 |
| 5.772 | 147.169 | 98.794 |
| 5.774 | 147.031 | 98.96 |
| 5.776 | 146.892 | 99.126 |
| 5.778 | 146.751 | 99.291 |
| 5.78 | 146.61 | 99.457 |
| 5.782 | 146.467 | 99.623 |
| 5.784 | 146.323 | 99.788 |
| 5.786 | 146.179 | 99.954 |
| 5.788 | 146.033 | 100.119 |
| 5.79 | 145.886 | 100.284 |
| 5.792 | 145.738 | 100.45 |
| 5.794 | 145.589 | 100.615 |
| 5.796 | 145.439 | 100.78 |
| 5.798 | 145.288 | 100.944 |
| 5.8 | 145.136 | 101.109 |
| 5.802 | 144.982 | 101.274 |
| 5.804 | 144.828 | 101.438 |
| 5.806 | 144.673 | 101.603 |
| 5.808 | 144.517 | 101.767 |
| 5.81 | 144.359 | 101.931 |
| 5.812 | 144.201 | 102.095 |
| 5.814 | 144.042 | 102.259 |
| 5.816 | 143.881 | 102.423 |
| 5.818 | 143.72 | 102.586 |
| 5.82 | 143.558 | 102.75 |
| 5.822 | 143.394 | 102.913 |
| 5.824 | 143.23 | 103.076 |
| 5.826 | 143.065 | 103.239 |
| 5.828 | 142.899 | 103.402 |
| 5.83 | 142.731 | 103.564 |
| 5.832 | 142.563 | 103.727 |
| 5.834 | 142.394 | 103.889 |
| 5.836 | 142.224 | 104.051 |
| 5.838 | 142.053 | 104.213 |
| 5.84 | 141.881 | 104.375 |
| 5.842 | 141.708 | 104.536 |
| 5.844 | 141.534 | 104.697 |
| 5.846 | 141.36 | 104.858 |
| 5.848 | 141.184 | 105.019 |
| 5.85 | 141.007 | 105.18 |
| 5.852 | 140.83 | 105.34 |
| 5.854 | 140.651 | 105.501 |
| 5.856 | 140.472 | 105.661 |
| 5.858 | 140.292 | 105.82 |
| 5.86 | 140.111 | 105.98 |
| 5.862 | 139.929 | 106.139 |
| 5.864 | 139.746 | 106.298 |
| 5.866 | 139.562 | 106.457 |
| 5.868 | 139.377 | 106.615 |
| 5.87 | 139.192 | 106.774 |
| 5.872 | 139.006 | 106.932 |
| 5.874 | 138.818 | 107.089 |
| 5.876 | 138.63 | 107.247 |
| 5.878 | 138.441 | 107.404 |
| 5.88 | 138.252 | 107.561 |
| 5.882 | 138.061 | 107.718 |
| 5.884 | 137.87 | 107.874 |
| 5.886 | 137.678 | 108.03 |
| 5.888 | 137.485 | 108.186 |
| 5.89 | 137.291 | 108.341 |
| 5.892 | 137.097 | 108.496 |
| 5.894 | 136.901 | 108.651 |
| 5.896 | 136.705 | 108.806 |
| 5.898 | 136.508 | 108.96 |
| 5.9 | 136.31 | 109.114 |
| 5.902 | 136.112 | 109.268 |
| 5.904 | 135.913 | 109.421 |
| 5.906 | 135.713 | 109.574 |
| 5.908 | 135.512 | 109.727 |
| 5.91 | 135.311 | 109.879 |
| 5.912 | 135.109 | 110.031 |
| 5.914 | 134.906 | 110.182 |
| 5.916 | 134.702 | 110.334 |
| 5.918 | 134.498 | 110.484 |
| 5.92 | 134.293 | 110.635 |
| 5.922 | 134.087 | 110.785 |
| 5.924 | 133.881 | 110.935 |
| 5.926 | 133.674 | 111.084 |
| 5.928 | 133.466 | 111.233 |
| 5.93 | 133.258 | 111.382 |
| 5.932 | 133.048 | 111.53 |
| 5.934 | 132.839 | 111.678 |
| 5.936 | 132.628 | 111.826 |
| 5.938 | 132.417 | 111.973 |
| 5.94 | 132.206 | 112.12 |
| 5.942 | 131.993 | 112.266 |
| 5.944 | 131.78 | 112.412 |
| 5.946 | 131.567 | 112.557 |
| 5.948 | 131.353 | 112.703 |
| 5.95 | 131.138 | 112.847 |
| 5.952 | 130.922 | 112.992 |
| 5.954 | 130.706 | 113.135 |
| 5.956 | 130.49 | 113.279 |
| 5.958 | 130.273 | 113.422 |
| 5.96 | 130.055 | 113.564 |
| 5.962 | 129.837 | 113.706 |
| 5.964 | 129.618 | 113.848 |
| 5.966 | 129.399 | 113.989 |
| 5.968 | 129.179 | 114.13 |
| 5.97 | 128.958 | 114.27 |
| 5.972 | 128.737 | 114.41 |
| 5.974 | 128.516 | 114.55 |
| 5.976 | 128.294 | 114.689 |
| 5.978 | 128.071 | 114.827 |
| 5.98 | 127.848 | 114.965 |
| 5.982 | 127.625 | 115.103 |
| 5.984 | 127.401 | 115.24 |
| 5.986 | 127.176 | 115.376 |
| 5.988 | 126.951 | 115.512 |
| 5.99 | 126.726 | 115.648 |
| 5.992 | 126.5 | 115.783 |
| 5.994 | 126.274 | 115.918 |
| 5.996 | 126.047 | 116.052 |
| 5.998 | 125.82 | 116.185 |
| 6.0 | 120.592 | 116.318 |
| 6.002 | 120.373 | 116.436 |
| 6.004 | 120.154 | 116.554 |
| 6.006 | 119.934 | 116.671 |
| 6.008 | 119.714 | 116.787 |
| 6.01 | 119.494 | 116.903 |
| 6.012 | 119.274 | 117.019 |
| 6.014 | 119.053 | 117.134 |
| 6.016 | 118.832 | 117.248 |
| 6.018 | 118.61 | 117.362 |
| 6.02 | 118.389 | 117.475 |
| 6.022 | 118.167 | 117.588 |
| 6.024 | 117.945 | 117.7 |
| 6.026 | 117.723 | 117.812 |
| 6.028 | 117.5 | 117.923 |
| 6.03 | 117.277 | 118.033 |
| 6.032 | 117.054 | 118.143 |
| 6.034 | 116.831 | 118.253 |
| 6.036 | 116.608 | 118.362 |
| 6.038 | 116.384 | 118.47 |
| 6.04 | 116.16 | 118.578 |
| 6.042 | 115.936 | 118.685 |
| 6.044 | 115.712 | 118.792 |
| 6.046 | 115.487 | 118.898 |
| 6.048 | 115.263 | 119.003 |
| 6.05 | 115.038 | 119.108 |
| 6.052 | 114.813 | 119.212 |
| 6.054 | 114.588 | 119.316 |
| 6.056 | 114.363 | 119.419 |
| 6.058 | 114.137 | 119.522 |
| 6.06 | 113.912 | 119.624 |
| 6.062 | 113.686 | 119.725 |
| 6.064 | 113.46 | 119.826 |
| 6.066 | 113.234 | 119.926 |
| 6.068 | 113.008 | 120.026 |
| 6.07 | 112.782 | 120.125 |
| 6.072 | 112.556 | 120.224 |
| 6.074 | 112.329 | 120.321 |
| 6.076 | 112.103 | 120.419 |
| 6.078 | 111.876 | 120.515 |
| 6.08 | 111.65 | 120.611 |
| 6.082 | 111.423 | 120.707 |
| 6.084 | 111.196 | 120.802 |
| 6.086 | 110.969 | 120.896 |
| 6.088 | 110.742 | 120.989 |
| 6.09 | 110.516 | 121.082 |
| 6.092 | 110.289 | 121.175 |
| 6.094 | 110.061 | 121.267 |
| 6.096 | 109.834 | 121.358 |
| 6.098 | 109.607 | 121.448 |
| 6.1 | 109.38 | 121.538 |
| 6.102 | 109.153 | 121.627 |
| 6.104 | 108.926 | 121.716 |
| 6.106 | 108.699 | 121.804 |
| 6.108 | 108.471 | 121.891 |
| 6.11 | 108.244 | 121.978 |
| 6.112 | 108.017 | 122.064 |
| 6.114 | 107.79 | 122.15 |
| 6.116 | 107.563 | 122.235 |
| 6.118 | 107.335 | 122.319 |
| 6.12 | 107.108 | 122.402 |
| 6.122 | 106.881 | 122.485 |
| 6.124 | 106.654 | 122.568 |
| 6.126 | 106.427 | 122.649 |
| 6.128 | 106.2 | 122.73 |
| 6.13 | 105.973 | 122.811 |
| 6.132 | 105.746 | 122.891 |
| 6.134 | 105.52 | 122.97 |
| 6.136 | 105.293 | 123.048 |
| 6.138 | 105.066 | 123.126 |
| 6.14 | 104.84 | 123.203 |
| 6.142 | 104.613 | 123.28 |
| 6.144 | 104.387 | 123.355 |
| 6.146 | 104.161 | 123.431 |
| 6.148 | 103.934 | 123.505 |
| 6.15 | 103.708 | 123.579 |
| 6.152 | 103.482 | 123.652 |
| 6.154 | 103.257 | 123.725 |
| 6.156 | 103.031 | 123.797 |
| 6.158 | 102.805 | 123.868 |
| 6.16 | 102.58 | 123.939 |
| 6.162 | 102.354 | 124.009 |
| 6.164 | 102.129 | 124.078 |
| 6.166 | 101.904 | 124.147 |
| 6.168 | 101.679 | 124.215 |
| 6.17 | 101.454 | 124.282 |
| 6.172 | 101.23 | 124.349 |
| 6.174 | 101.005 | 124.415 |
| 6.176 | 100.781 | 124.48 |
| 6.178 | 100.557 | 124.545 |
| 6.18 | 100.333 | 124.609 |
| 6.182 | 100.109 | 124.672 |
| 6.184 | 99.885 | 124.735 |
| 6.186 | 99.662 | 124.797 |
| 6.188 | 99.439 | 124.858 |
| 6.19 | 99.216 | 124.919 |
| 6.192 | 98.993 | 124.979 |
| 6.194 | 98.77 | 125.038 |
| 6.19600000000001 | 98.548 | 125.097 |
| 6.19800000000001 | 98.326 | 125.155 |
| 6.20000000000001 | 98.104 | 125.212 |
| 6.20200000000001 | 97.882 | 125.269 |
| 6.20400000000001 | 97.66 | 125.325 |
| 6.20600000000001 | 97.439 | 125.38 |
| 6.20800000000001 | 97.218 | 125.435 |
| 6.21000000000001 | 96.997 | 125.489 |
| 6.21200000000001 | 96.776 | 125.542 |
| 6.21400000000001 | 96.556 | 125.595 |
| 6.21600000000001 | 96.336 | 125.647 |
| 6.21800000000001 | 96.116 | 125.698 |
| 6.22000000000001 | 95.896 | 125.749 |
| 6.22200000000001 | 95.677 | 125.799 |
| 6.22400000000001 | 95.458 | 125.848 |
| 6.22600000000002 | 95.239 | 125.897 |
| 6.22800000000002 | 95.021 | 125.945 |
| 6.23000000000002 | 94.802 | 125.992 |
| 6.23200000000002 | 94.584 | 126.038 |
| 6.23400000000002 | 94.367 | 126.084 |
| 6.23600000000002 | 94.149 | 126.13 |
| 6.23800000000002 | 93.932 | 126.174 |
| 6.24000000000002 | 93.715 | 126.218 |
| 6.24200000000002 | 93.499 | 126.262 |
| 6.24400000000002 | 93.282 | 126.304 |
| 6.24600000000002 | 93.066 | 126.346 |
| 6.24800000000002 | 92.851 | 126.387 |
| 6.25000000000002 | 92.635 | 126.428 |
| 6.25200000000002 | 92.42 | 126.468 |
| 6.25400000000002 | 92.206 | 126.507 |
| 6.25600000000003 | 91.991 | 126.546 |
| 6.25800000000003 | 91.777 | 126.584 |
| 6.26000000000003 | 91.563 | 126.621 |
| 6.26200000000003 | 91.35 | 126.658 |
| 6.26400000000003 | 91.137 | 126.694 |
| 6.26600000000003 | 90.924 | 126.729 |
| 6.26800000000003 | 90.712 | 126.763 |
| 6.27000000000003 | 90.499 | 126.797 |
| 6.27200000000003 | 90.288 | 126.831 |
| 6.27400000000003 | 90.076 | 126.863 |
| 6.27600000000003 | 89.865 | 126.895 |
| 6.27800000000003 | 89.655 | 126.927 |
| 6.28000000000003 | 89.444 | 126.957 |
| 6.28200000000003 | 89.234 | 126.987 |
| 6.28400000000003 | 89.025 | 127.016 |
| 6.28600000000004 | 88.815 | 127.045 |
| 6.28800000000004 | 88.606 | 127.073 |
| 6.29000000000004 | 88.398 | 127.1 |
| 6.29200000000004 | 88.19 | 127.127 |
| 6.29400000000004 | 87.982 | 127.153 |
| 6.29600000000004 | 87.774 | 127.179 |
| 6.29800000000004 | 87.567 | 127.203 |
| 6.30000000000004 | 87.361 | 127.227 |
| 6.30200000000004 | 87.154 | 127.251 |
| 6.30400000000004 | 86.948 | 127.273 |
| 6.30600000000004 | 86.743 | 127.296 |
| 6.30800000000004 | 86.538 | 127.317 |
| 6.31000000000004 | 86.333 | 127.338 |
| 6.31200000000004 | 86.129 | 127.358 |
| 6.31400000000004 | 85.925 | 127.378 |
| 6.31600000000005 | 85.721 | 127.396 |
| 6.31800000000005 | 85.518 | 127.415 |
| 6.32000000000005 | 85.315 | 127.432 |
| 6.32200000000005 | 85.113 | 127.449 |
| 6.32400000000005 | 84.911 | 127.465 |
| 6.32600000000005 | 84.71 | 127.481 |
| 6.32800000000005 | 84.508 | 127.496 |
| 6.33000000000005 | 84.308 | 127.51 |
| 6.33200000000005 | 84.107 | 127.524 |
| 6.33400000000005 | 83.908 | 127.537 |
| 6.33600000000005 | 83.708 | 127.55 |
| 6.33800000000005 | 83.509 | 127.562 |
| 6.34000000000005 | 83.311 | 127.573 |
| 6.34200000000005 | 83.112 | 127.583 |
| 6.34400000000005 | 82.915 | 127.593 |
| 6.34600000000006 | 82.717 | 127.603 |
| 6.34800000000006 | 82.52 | 127.611 |
| 6.35000000000006 | 82.324 | 127.619 |
| 6.35200000000006 | 82.128 | 127.627 |
| 6.35400000000006 | 81.932 | 127.633 |
| 6.35600000000006 | 81.737 | 127.64 |
| 6.35800000000006 | 81.543 | 127.645 |
| 6.36000000000006 | 81.348 | 127.65 |
| 6.36200000000006 | 81.155 | 127.654 |
| 6.36400000000006 | 80.961 | 127.658 |
| 6.36600000000006 | 80.768 | 127.661 |
| 6.36800000000006 | 80.576 | 127.664 |
| 6.37000000000006 | 80.384 | 127.665 |
| 6.37200000000006 | 80.192 | 127.667 |
| 6.37400000000006 | 80.001 | 127.667 |
| 6.37600000000007 | 79.81 | 127.667 |
| 6.37800000000007 | 79.62 | 127.667 |
| 6.38000000000007 | 79.43 | 127.665 |
| 6.38200000000007 | 79.241 | 127.664 |
| 6.38400000000007 | 79.052 | 127.661 |
| 6.38600000000007 | 78.864 | 127.658 |
| 6.38800000000007 | 78.676 | 127.655 |
| 6.39000000000007 | 78.488 | 127.65 |
| 6.39200000000007 | 78.301 | 127.646 |
| 6.39400000000007 | 78.115 | 127.64 |
| 6.39600000000007 | 77.929 | 127.634 |
| 6.39800000000007 | 77.743 | 127.627 |
| 6.40000000000007 | 77.558 | 127.62 |
| 6.40200000000007 | 77.373 | 127.612 |
| 6.40400000000007 | 77.189 | 127.604 |
| 6.40600000000008 | 77.006 | 127.595 |
| 6.40800000000008 | 76.822 | 127.586 |
| 6.41000000000008 | 76.64 | 127.575 |
| 6.41200000000008 | 76.457 | 127.565 |
| 6.41400000000008 | 76.275 | 127.553 |
| 6.41600000000008 | 76.094 | 127.542 |
| 6.41800000000008 | 75.913 | 127.529 |
| 6.42000000000008 | 75.733 | 127.516 |
| 6.42200000000008 | 75.553 | 127.502 |
| 6.42400000000008 | 75.373 | 127.488 |
| 6.42600000000008 | 75.194 | 127.474 |
| 6.42800000000008 | 75.016 | 127.458 |
| 6.43000000000008 | 74.838 | 127.442 |
| 6.43200000000008 | 74.66 | 127.426 |
| 6.43400000000008 | 74.483 | 127.409 |
| 6.43600000000009 | 74.307 | 127.391 |
| 6.43800000000009 | 74.131 | 127.373 |
| 6.44000000000009 | 73.955 | 127.354 |
| 6.44200000000009 | 73.78 | 127.335 |
| 6.44400000000009 | 73.605 | 127.315 |
| 6.44600000000009 | 73.431 | 127.295 |
| 6.44800000000009 | 73.258 | 127.274 |
| 6.45000000000009 | 73.084 | 127.253 |
| 6.45200000000009 | 72.912 | 127.231 |
| 6.45400000000009 | 72.74 | 127.208 |
| 6.45600000000009 | 72.568 | 127.185 |
| 6.45800000000009 | 72.397 | 127.161 |
| 6.46000000000009 | 72.226 | 127.137 |
| 6.46200000000009 | 72.056 | 127.113 |
| 6.46400000000009 | 71.886 | 127.087 |
| 6.4660000000001 | 71.717 | 127.062 |
| 6.4680000000001 | 71.548 | 127.035 |
| 6.4700000000001 | 71.38 | 127.008 |
| 6.4720000000001 | 71.212 | 126.981 |
| 6.4740000000001 | 71.045 | 126.953 |
| 6.4760000000001 | 70.878 | 126.925 |
| 6.4780000000001 | 70.712 | 126.896 |
| 6.4800000000001 | 70.546 | 126.866 |
| 6.4820000000001 | 70.38 | 126.836 |
| 6.4840000000001 | 70.216 | 126.806 |
| 6.4860000000001 | 70.051 | 126.775 |
| 6.4880000000001 | 69.888 | 126.743 |
| 6.4900000000001 | 69.724 | 126.711 |
| 6.4920000000001 | 69.561 | 126.679 |
| 6.4940000000001 | 69.399 | 126.646 |
| 6.49600000000011 | 69.237 | 126.612 |
| 6.49800000000011 | 69.076 | 126.578 |
| 6.50000000000011 | 68.915 | 126.543 |
| 6.50200000000011 | 68.754 | 126.508 |
| 6.50400000000011 | 68.595 | 126.473 |
| 6.50600000000011 | 68.435 | 126.437 |
| 6.50800000000011 | 68.276 | 126.4 |
| 6.51000000000011 | 68.118 | 126.363 |
| 6.51200000000011 | 67.96 | 126.326 |
| 6.51400000000011 | 67.803 | 126.288 |
| 6.51600000000011 | 67.646 | 126.249 |
| 6.51800000000011 | 67.489 | 126.21 |
| 6.52000000000011 | 67.333 | 126.171 |
| 6.52200000000011 | 67.178 | 126.131 |
| 6.52400000000011 | 67.023 | 126.09 |
| 6.52600000000012 | 66.868 | 126.049 |
| 6.52800000000012 | 66.715 | 126.008 |
| 6.53000000000012 | 66.561 | 125.966 |
| 6.53200000000012 | 66.408 | 125.924 |
| 6.53400000000012 | 66.256 | 125.881 |
| 6.53600000000012 | 66.104 | 125.838 |
| 6.53800000000012 | 65.952 | 125.794 |
| 6.54000000000012 | 65.801 | 125.75 |
| 6.54200000000012 | 65.651 | 125.705 |
| 6.54400000000012 | 65.501 | 125.66 |
| 6.54600000000012 | 65.351 | 125.615 |
| 6.54800000000012 | 65.202 | 125.569 |
| 6.55000000000012 | 65.053 | 125.522 |
| 6.55200000000012 | 64.905 | 125.475 |
| 6.55400000000012 | 64.758 | 125.428 |
| 6.55600000000013 | 64.611 | 125.38 |
| 6.55800000000013 | 64.464 | 125.332 |
| 6.56000000000013 | 64.318 | 125.283 |
| 6.56200000000013 | 64.172 | 125.234 |
| 6.56400000000013 | 64.027 | 125.184 |
| 6.56600000000013 | 63.883 | 125.134 |
| 6.56800000000013 | 63.738 | 125.084 |
| 6.57000000000013 | 63.595 | 125.033 |
| 6.57200000000013 | 63.451 | 124.982 |
| 6.57400000000013 | 63.309 | 124.93 |
| 6.57600000000013 | 63.167 | 124.878 |
| 6.57800000000013 | 63.025 | 124.825 |
| 6.58000000000013 | 62.884 | 124.773 |
| 6.58200000000013 | 62.743 | 124.719 |
| 6.58400000000013 | 62.602 | 124.665 |
| 6.58600000000014 | 62.463 | 124.611 |
| 6.58800000000014 | 62.323 | 124.556 |
| 6.59000000000014 | 62.185 | 124.501 |
| 6.59200000000014 | 62.046 | 124.446 |
| 6.59400000000014 | 61.908 | 124.39 |
| 6.59600000000014 | 61.771 | 124.334 |
| 6.59800000000014 | 61.634 | 124.277 |
| 6.60000000000014 | 61.497 | 124.22 |
| 6.60200000000014 | 61.362 | 124.163 |
| 6.60400000000014 | 61.226 | 124.105 |
| 6.60600000000014 | 61.091 | 124.047 |
| 6.60800000000014 | 60.956 | 123.988 |
| 6.61000000000014 | 60.822 | 123.929 |
| 6.61200000000014 | 60.689 | 123.869 |
| 6.61400000000014 | 60.556 | 123.81 |
| 6.61600000000015 | 60.423 | 123.749 |
| 6.61800000000015 | 60.291 | 123.689 |
| 6.62000000000015 | 60.159 | 123.628 |
| 6.62200000000015 | 60.028 | 123.567 |
| 6.62400000000015 | 59.897 | 123.505 |
| 6.62600000000015 | 59.767 | 123.443 |
| 6.62800000000015 | 59.637 | 123.38 |
| 6.63000000000015 | 59.508 | 123.318 |
| 6.63200000000015 | 59.379 | 123.254 |
| 6.63400000000015 | 59.25 | 123.191 |
| 6.63600000000015 | 59.122 | 123.127 |
| 6.63800000000015 | 58.995 | 123.063 |
| 6.64000000000015 | 58.868 | 122.998 |
| 6.64200000000015 | 58.741 | 122.933 |
| 6.64400000000016 | 58.615 | 122.868 |
| 6.64600000000016 | 58.49 | 122.802 |
| 6.64800000000016 | 58.364 | 122.736 |
| 6.65000000000016 | 58.24 | 122.67 |
| 6.65200000000016 | 58.115 | 122.603 |
| 6.65400000000016 | 57.992 | 122.536 |
| 6.65600000000016 | 57.868 | 122.468 |
| 6.65800000000016 | 57.745 | 122.401 |
| 6.66000000000016 | 57.623 | 122.333 |
| 6.66200000000016 | 57.501 | 122.264 |
| 6.66400000000016 | 57.38 | 122.195 |
| 6.66600000000016 | 57.259 | 122.126 |
| 6.66800000000016 | 57.138 | 122.057 |
| 6.67000000000016 | 57.018 | 121.987 |
| 6.67200000000016 | 56.898 | 121.917 |
| 6.67400000000017 | 56.779 | 121.847 |
| 6.67600000000017 | 56.66 | 121.776 |
| 6.67800000000017 | 56.542 | 121.705 |
| 6.68000000000017 | 56.424 | 121.633 |
| 6.68200000000017 | 56.306 | 121.562 |
| 6.68400000000017 | 56.189 | 121.49 |
| 6.68600000000017 | 56.073 | 121.417 |
| 6.68800000000017 | 55.957 | 121.345 |
| 6.69000000000017 | 55.841 | 121.272 |
| 6.69200000000017 | 55.726 | 121.199 |
| 6.69400000000017 | 55.611 | 121.125 |
| 6.69600000000017 | 55.497 | 121.051 |
| 6.69800000000017 | 55.383 | 120.977 |
| 6.70000000000017 | 55.269 | 120.903 |
| 6.70200000000017 | 55.156 | 120.828 |
| 6.70400000000018 | 55.044 | 120.753 |
| 6.70600000000018 | 54.931 | 120.677 |
| 6.70800000000018 | 54.82 | 120.602 |
| 6.71000000000018 | 54.708 | 120.526 |
| 6.71200000000018 | 54.598 | 120.45 |
| 6.71400000000018 | 54.487 | 120.373 |
| 6.71600000000018 | 54.377 | 120.296 |
| 6.71800000000018 | 54.268 | 120.219 |
| 6.72000000000018 | 54.158 | 120.142 |
| 6.72200000000018 | 54.05 | 120.064 |
| 6.72400000000018 | 53.941 | 119.987 |
| 6.72600000000018 | 53.834 | 119.908 |
| 6.72800000000018 | 53.726 | 119.83 |
| 6.73000000000018 | 53.619 | 119.751 |
| 6.73200000000018 | 53.513 | 119.672 |
| 6.73400000000019 | 53.406 | 119.593 |
| 6.73600000000019 | 53.301 | 119.513 |
| 6.73800000000019 | 53.195 | 119.434 |
| 6.74000000000019 | 53.091 | 119.354 |
| 6.74200000000019 | 52.986 | 119.273 |
| 6.74400000000019 | 52.882 | 119.193 |
| 6.74600000000019 | 52.778 | 119.112 |
| 6.74800000000019 | 52.675 | 119.031 |
| 6.75000000000019 | 52.572 | 118.95 |
| 6.75200000000019 | 52.47 | 118.868 |
| 6.75400000000019 | 52.368 | 118.786 |
| 6.75600000000019 | 52.266 | 118.704 |
| 6.75800000000019 | 52.165 | 118.622 |
| 6.76000000000019 | 52.065 | 118.539 |
| 6.76200000000019 | 51.964 | 118.457 |
| 6.7640000000002 | 51.864 | 118.374 |
| 6.7660000000002 | 51.765 | 118.29 |
| 6.7680000000002 | 51.666 | 118.207 |
| 6.7700000000002 | 51.567 | 118.123 |
| 6.7720000000002 | 51.469 | 118.039 |
| 6.7740000000002 | 51.371 | 117.955 |
| 6.7760000000002 | 51.273 | 117.87 |
| 6.7780000000002 | 51.176 | 117.786 |
| 6.7800000000002 | 51.08 | 117.701 |
| 6.7820000000002 | 50.983 | 117.616 |
| 6.7840000000002 | 50.887 | 117.531 |
| 6.7860000000002 | 50.792 | 117.445 |
| 6.7880000000002 | 50.697 | 117.359 |
| 6.7900000000002 | 50.602 | 117.273 |
| 6.7920000000002 | 50.508 | 117.187 |
| 6.79400000000021 | 50.414 | 117.101 |
| 6.79600000000021 | 50.32 | 117.014 |
| 6.79800000000021 | 50.227 | 116.927 |
| 6.80000000000021 | 50.135 | 116.84 |
| 6.80200000000021 | 50.042 | 116.753 |
| 6.80400000000021 | 49.95 | 116.666 |
| 6.80600000000021 | 49.859 | 116.578 |
| 6.80800000000021 | 49.767 | 116.49 |
| 6.81000000000021 | 49.677 | 116.402 |
| 6.81200000000021 | 49.586 | 116.314 |
| 6.81400000000021 | 49.496 | 116.225 |
| 6.81600000000021 | 49.407 | 116.137 |
| 6.81800000000021 | 49.317 | 116.048 |
| 6.82000000000021 | 49.228 | 115.959 |
| 6.82200000000021 | 49.14 | 115.87 |
| 6.82400000000022 | 49.052 | 115.78 |
| 6.82600000000022 | 48.964 | 115.691 |
| 6.82800000000022 | 48.877 | 115.601 |
| 6.83000000000022 | 48.79 | 115.511 |
| 6.83200000000022 | 48.703 | 115.421 |
| 6.83400000000022 | 48.617 | 115.331 |
| 6.83600000000022 | 48.531 | 115.24 |
| 6.83800000000022 | 48.445 | 115.149 |
| 6.84000000000022 | 48.36 | 115.059 |
| 6.84200000000022 | 48.275 | 114.968 |
| 6.84400000000022 | 48.191 | 114.876 |
| 6.84600000000022 | 48.107 | 114.785 |
| 6.84800000000022 | 48.023 | 114.693 |
| 6.85000000000022 | 47.94 | 114.602 |
| 6.85200000000022 | 47.857 | 114.51 |
| 6.85400000000023 | 47.774 | 114.418 |
| 6.85600000000023 | 47.692 | 114.326 |
| 6.85800000000023 | 47.61 | 114.233 |
| 6.86000000000023 | 47.529 | 114.141 |
| 6.86200000000023 | 47.448 | 114.048 |
| 6.86400000000023 | 47.367 | 113.955 |
| 6.86600000000023 | 47.287 | 113.862 |
| 6.86800000000023 | 47.207 | 113.769 |
| 6.87000000000023 | 47.127 | 113.676 |
| 6.87200000000023 | 47.047 | 113.583 |
| 6.87400000000023 | 46.968 | 113.489 |
| 6.87600000000023 | 46.89 | 113.395 |
| 6.87800000000023 | 46.812 | 113.301 |
| 6.88000000000023 | 46.734 | 113.207 |
| 6.88200000000023 | 46.656 | 113.113 |
| 6.88400000000024 | 46.579 | 113.019 |
| 6.88600000000024 | 46.502 | 112.925 |
| 6.88800000000024 | 46.425 | 112.83 |
| 6.89000000000024 | 46.349 | 112.735 |
| 6.89200000000024 | 46.273 | 112.64 |
| 6.89400000000024 | 46.198 | 112.545 |
| 6.89600000000024 | 46.123 | 112.45 |
| 6.89800000000024 | 46.048 | 112.355 |
| 6.90000000000024 | 45.973 | 112.26 |
| 6.90200000000024 | 45.899 | 112.164 |
| 6.90400000000024 | 45.825 | 112.069 |
| 6.90600000000024 | 45.752 | 111.973 |
| 6.90800000000024 | 45.679 | 111.877 |
| 6.91000000000024 | 45.606 | 111.781 |
| 6.91200000000024 | 45.533 | 111.685 |
| 6.91400000000025 | 45.461 | 111.589 |
| 6.91600000000025 | 45.389 | 111.492 |
| 6.91800000000025 | 45.318 | 111.396 |
| 6.92000000000025 | 45.247 | 111.299 |
| 6.92200000000025 | 45.176 | 111.203 |
| 6.92400000000025 | 45.106 | 111.106 |
| 6.92600000000025 | 45.035 | 111.009 |
| 6.92800000000025 | 44.966 | 110.912 |
| 6.93000000000025 | 44.896 | 110.815 |
| 6.93200000000025 | 44.827 | 110.717 |
| 6.93400000000025 | 44.758 | 110.62 |
| 6.93600000000025 | 44.689 | 110.523 |
| 6.93800000000025 | 44.621 | 110.425 |
| 6.94000000000025 | 44.553 | 110.327 |
| 6.94200000000025 | 44.486 | 110.23 |
| 6.94400000000026 | 44.419 | 110.132 |
| 6.94600000000026 | 44.352 | 110.034 |
| 6.94800000000026 | 44.285 | 109.936 |
| 6.95000000000026 | 44.219 | 109.838 |
| 6.95200000000026 | 44.153 | 109.739 |
| 6.95400000000026 | 44.087 | 109.641 |
| 6.95600000000026 | 44.022 | 109.543 |
| 6.95800000000026 | 43.957 | 109.444 |
| 6.96000000000026 | 43.892 | 109.345 |
| 6.96200000000026 | 43.828 | 109.247 |
| 6.96400000000026 | 43.764 | 109.148 |
| 6.96600000000026 | 43.7 | 109.049 |
| 6.96800000000026 | 43.636 | 108.95 |
| 6.97000000000026 | 43.573 | 108.851 |
| 6.97200000000026 | 43.51 | 108.752 |
| 6.97400000000027 | 43.448 | 108.653 |
| 6.97600000000027 | 43.386 | 108.553 |
| 6.97800000000027 | 43.324 | 108.454 |
| 6.98000000000027 | 43.262 | 108.355 |
| 6.98200000000027 | 43.201 | 108.255 |
| 6.98400000000027 | 43.14 | 108.155 |
| 6.98600000000027 | 43.079 | 108.056 |
| 6.98800000000027 | 43.018 | 107.956 |
| 6.99000000000027 | 42.958 | 107.856 |
| 6.99200000000027 | 42.898 | 107.756 |
| 6.99400000000027 | 42.839 | 107.656 |
| 6.99600000000027 | 42.78 | 107.556 |
| 6.99800000000027 | 42.721 | 107.456 |
| 7.00000000000027 | 37.662 | 107.356 |
| 7.00200000000027 | 37.611 | 107.243 |
| 7.00400000000028 | 37.559 | 107.129 |
| 7.00600000000028 | 37.508 | 107.015 |
| 7.00800000000028 | 37.458 | 106.902 |
| 7.01000000000028 | 37.407 | 106.788 |
| 7.01200000000028 | 37.357 | 106.674 |
| 7.01400000000028 | 37.307 | 106.56 |
| 7.01600000000028 | 37.258 | 106.447 |
| 7.01800000000028 | 37.209 | 106.333 |
| 7.02000000000028 | 37.16 | 106.219 |
| 7.02200000000028 | 37.111 | 106.105 |
| 7.02400000000028 | 37.062 | 105.992 |
| 7.02600000000028 | 37.014 | 105.878 |
| 7.02800000000028 | 36.966 | 105.764 |
| 7.03000000000028 | 36.919 | 105.65 |
| 7.03200000000028 | 36.871 | 105.537 |
| 7.03400000000029 | 36.824 | 105.423 |
| 7.03600000000029 | 36.778 | 105.309 |
| 7.03800000000029 | 36.731 | 105.195 |
| 7.04000000000029 | 36.685 | 105.081 |
| 7.04200000000029 | 36.639 | 104.968 |
| 7.04400000000029 | 36.593 | 104.854 |
| 7.04600000000029 | 36.548 | 104.74 |
| 7.04800000000029 | 36.502 | 104.626 |
| 7.05000000000029 | 36.457 | 104.512 |
| 7.05200000000029 | 36.413 | 104.399 |
| 7.05400000000029 | 36.368 | 104.285 |
| 7.05600000000029 | 36.324 | 104.171 |
| 7.05800000000029 | 36.28 | 104.057 |
| 7.06000000000029 | 36.237 | 103.944 |
| 7.06200000000029 | 36.193 | 103.83 |
| 7.0640000000003 | 36.15 | 103.716 |
| 7.0660000000003 | 36.107 | 103.603 |
| 7.0680000000003 | 36.065 | 103.489 |
| 7.0700000000003 | 36.022 | 103.375 |
| 7.0720000000003 | 35.98 | 103.262 |
| 7.0740000000003 | 35.938 | 103.148 |
| 7.0760000000003 | 35.897 | 103.034 |
| 7.0780000000003 | 35.855 | 102.921 |
| 7.0800000000003 | 35.814 | 102.807 |
| 7.0820000000003 | 35.773 | 102.694 |
| 7.0840000000003 | 35.733 | 102.58 |
| 7.0860000000003 | 35.692 | 102.466 |
| 7.0880000000003 | 35.652 | 102.353 |
| 7.0900000000003 | 35.613 | 102.239 |
| 7.0920000000003 | 35.573 | 102.126 |
| 7.09400000000031 | 35.534 | 102.013 |
| 7.09600000000031 | 35.494 | 101.899 |
| 7.09800000000031 | 35.456 | 101.786 |
| 7.10000000000031 | 35.417 | 101.672 |
| 7.10200000000031 | 35.379 | 101.559 |
| 7.10400000000031 | 35.34 | 101.446 |
| 7.10600000000031 | 35.303 | 101.333 |
| 7.10800000000031 | 35.265 | 101.219 |
| 7.11000000000031 | 35.228 | 101.106 |
| 7.11200000000031 | 35.19 | 100.993 |
| 7.11400000000031 | 35.153 | 100.88 |
| 7.11600000000031 | 35.117 | 100.767 |
| 7.11800000000031 | 35.08 | 100.654 |
| 7.12000000000031 | 35.044 | 100.541 |
| 7.12200000000031 | 35.008 | 100.428 |
| 7.12400000000032 | 34.972 | 100.315 |
| 7.12600000000032 | 34.937 | 100.202 |
| 7.12800000000032 | 34.901 | 100.089 |
| 7.13000000000032 | 34.866 | 99.976 |
| 7.13200000000032 | 34.832 | 99.863 |
| 7.13400000000032 | 34.797 | 99.75 |
| 7.13600000000032 | 34.763 | 99.638 |
| 7.13800000000032 | 34.728 | 99.525 |
| 7.14000000000032 | 34.695 | 99.412 |
| 7.14200000000032 | 34.661 | 99.3 |
| 7.14400000000032 | 34.627 | 99.187 |
| 7.14600000000032 | 34.594 | 99.075 |
| 7.14800000000032 | 34.561 | 98.962 |
| 7.15000000000032 | 34.528 | 98.85 |
| 7.15200000000032 | 34.496 | 98.737 |
| 7.15400000000033 | 34.464 | 98.625 |
| 7.15600000000033 | 34.432 | 98.513 |
| 7.15800000000033 | 34.4 | 98.401 |
| 7.16000000000033 | 34.368 | 98.288 |
| 7.16200000000033 | 34.337 | 98.176 |
| 7.16400000000033 | 34.305 | 98.064 |
| 7.16600000000033 | 34.274 | 97.952 |
| 7.16800000000033 | 34.244 | 97.84 |
| 7.17000000000033 | 34.213 | 97.728 |
| 7.17200000000033 | 34.183 | 97.616 |
| 7.17400000000033 | 34.153 | 97.505 |
| 7.17600000000033 | 34.123 | 97.393 |
| 7.17800000000033 | 34.093 | 97.281 |
| 7.18000000000033 | 34.064 | 97.17 |
| 7.18200000000033 | 34.034 | 97.058 |
| 7.18400000000034 | 34.005 | 96.946 |
| 7.18600000000034 | 33.977 | 96.835 |
| 7.18800000000034 | 33.948 | 96.724 |
| 7.19000000000034 | 33.92 | 96.612 |
| 7.19200000000034 | 33.891 | 96.501 |
| 7.19400000000034 | 33.863 | 96.39 |
| 7.19600000000034 | 33.836 | 96.278 |
| 7.19800000000034 | 33.808 | 96.167 |
| 7.20000000000034 | 33.781 | 96.056 |
| 7.20200000000034 | 33.754 | 95.945 |
| 7.20400000000034 | 33.727 | 95.834 |
| 7.20600000000034 | 33.7 | 95.724 |
| 7.20800000000034 | 33.674 | 95.613 |
| 7.21000000000034 | 33.647 | 95.502 |
| 7.21200000000034 | 33.621 | 95.391 |
| 7.21400000000035 | 33.595 | 95.281 |
| 7.21600000000035 | 33.57 | 95.17 |
| 7.21800000000035 | 33.544 | 95.06 |
| 7.22000000000035 | 33.519 | 94.949 |
| 7.22200000000035 | 33.494 | 94.839 |
| 7.22400000000035 | 33.469 | 94.729 |
| 7.22600000000035 | 33.444 | 94.619 |
| 7.22800000000035 | 33.42 | 94.508 |
| 7.23000000000035 | 33.396 | 94.398 |
| 7.23200000000035 | 33.372 | 94.288 |
| 7.23400000000035 | 33.348 | 94.178 |
| 7.23600000000035 | 33.324 | 94.069 |
| 7.23800000000035 | 33.301 | 93.959 |
| 7.24000000000035 | 33.277 | 93.849 |
| 7.24200000000035 | 33.254 | 93.739 |
| 7.24400000000036 | 33.232 | 93.63 |
| 7.24600000000036 | 33.209 | 93.52 |
| 7.24800000000036 | 33.186 | 93.411 |
| 7.25000000000036 | 33.164 | 93.302 |
| 7.25200000000036 | 33.142 | 93.193 |
| 7.25400000000036 | 33.12 | 93.083 |
| 7.25600000000036 | 33.099 | 92.974 |
| 7.25800000000036 | 33.077 | 92.865 |
| 7.26000000000036 | 33.056 | 92.756 |
| 7.26200000000036 | 33.035 | 92.647 |
| 7.26400000000036 | 33.014 | 92.539 |
| 7.26600000000036 | 32.993 | 92.43 |
| 7.26800000000036 | 32.973 | 92.321 |
| 7.27000000000036 | 32.952 | 92.213 |
| 7.27200000000036 | 32.932 | 92.104 |
| 7.27400000000037 | 32.912 | 91.996 |
| 7.27600000000037 | 32.893 | 91.888 |
| 7.27800000000037 | 32.873 | 91.779 |
| 7.28000000000037 | 32.854 | 91.671 |
| 7.28200000000037 | 32.835 | 91.563 |
| 7.28400000000037 | 32.816 | 91.455 |
| 7.28600000000037 | 32.797 | 91.347 |
| 7.28800000000037 | 32.778 | 91.24 |
| 7.29000000000037 | 32.76 | 91.132 |
| 7.29200000000037 | 32.741 | 91.024 |
| 7.29400000000037 | 32.723 | 90.917 |
| 7.29600000000037 | 32.706 | 90.809 |
| 7.29800000000037 | 32.688 | 90.702 |
| 7.30000000000037 | 32.67 | 90.595 |
| 7.30200000000037 | 32.653 | 90.487 |
| 7.30400000000038 | 32.636 | 90.38 |
| 7.30600000000038 | 32.619 | 90.273 |
| 7.30800000000038 | 32.602 | 90.166 |
| 7.31000000000038 | 32.586 | 90.06 |
| 7.31200000000038 | 32.569 | 89.953 |
| 7.31400000000038 | 32.553 | 89.846 |
| 7.31600000000038 | 32.537 | 89.74 |
| 7.31800000000038 | 32.521 | 89.633 |
| 7.32000000000038 | 32.506 | 89.527 |
| 7.32200000000038 | 32.49 | 89.42 |
| 7.32400000000038 | 32.475 | 89.314 |
| 7.32600000000038 | 32.46 | 89.208 |
| 7.32800000000038 | 32.445 | 89.102 |
| 7.33000000000038 | 32.43 | 88.996 |
| 7.33200000000038 | 32.415 | 88.89 |
| 7.33400000000039 | 32.401 | 88.785 |
| 7.33600000000039 | 32.387 | 88.679 |
| 7.33800000000039 | 32.373 | 88.573 |
| 7.34000000000039 | 32.359 | 88.468 |
| 7.34200000000039 | 32.345 | 88.362 |
| 7.34400000000039 | 32.332 | 88.257 |
| 7.34600000000039 | 32.318 | 88.152 |
| 7.34800000000039 | 32.305 | 88.047 |
| 7.35000000000039 | 32.292 | 87.942 |
| 7.35200000000039 | 32.279 | 87.837 |
| 7.35400000000039 | 32.267 | 87.732 |
| 7.35600000000039 | 32.254 | 87.628 |
| 7.35800000000039 | 32.242 | 87.523 |
| 7.36000000000039 | 32.23 | 87.418 |
| 7.36200000000039 | 32.218 | 87.314 |
| 7.3640000000004 | 32.206 | 87.21 |
| 7.3660000000004 | 32.194 | 87.106 |
| 7.3680000000004 | 32.183 | 87.001 |
| 7.3700000000004 | 32.172 | 86.897 |
| 7.3720000000004 | 32.161 | 86.794 |
| 7.3740000000004 | 32.15 | 86.69 |
| 7.3760000000004 | 32.139 | 86.586 |
| 7.3780000000004 | 32.128 | 86.482 |
| 7.3800000000004 | 32.118 | 86.379 |
| 7.3820000000004 | 32.108 | 86.276 |
| 7.3840000000004 | 32.098 | 86.172 |
| 7.3860000000004 | 32.088 | 86.069 |
| 7.3880000000004 | 32.078 | 85.966 |
| 7.3900000000004 | 32.068 | 85.863 |
| 7.3920000000004 | 32.059 | 85.76 |
| 7.39400000000041 | 32.05 | 85.657 |
| 7.39600000000041 | 32.041 | 85.555 |
| 7.39800000000041 | 32.032 | 85.452 |
| 7.40000000000041 | 32.023 | 85.35 |
| 7.40200000000041 | 32.014 | 85.247 |
| 7.40400000000041 | 32.006 | 85.145 |
| 7.40600000000041 | 31.998 | 85.043 |
| 7.40800000000041 | 31.99 | 84.941 |
| 7.41000000000041 | 31.982 | 84.839 |
| 7.41200000000041 | 31.974 | 84.737 |
| 7.41400000000041 | 31.967 | 84.635 |
| 7.41600000000041 | 31.959 | 84.534 |
| 7.41800000000041 | 31.952 | 84.432 |
| 7.42000000000041 | 31.945 | 84.331 |
| 7.42200000000041 | 31.938 | 84.229 |
| 7.42400000000042 | 31.931 | 84.128 |
| 7.42600000000042 | 31.925 | 84.027 |
| 7.42800000000042 | 31.918 | 83.926 |
| 7.43000000000042 | 31.912 | 83.825 |
| 7.43200000000042 | 31.906 | 83.724 |
| 7.43400000000042 | 31.9 | 83.624 |
| 7.43600000000042 | 31.894 | 83.523 |
| 7.43800000000042 | 31.888 | 83.423 |
| 7.44000000000042 | 31.883 | 83.322 |
| 7.44200000000042 | 31.878 | 83.222 |
| 7.44400000000042 | 31.873 | 83.122 |
| 7.44600000000042 | 31.868 | 83.022 |
| 7.44800000000042 | 31.863 | 82.922 |
| 7.45000000000042 | 31.858 | 82.822 |
| 7.45200000000042 | 31.854 | 82.723 |
| 7.45400000000043 | 31.849 | 82.623 |
| 7.45600000000043 | 31.845 | 82.524 |
| 7.45800000000043 | 31.841 | 82.424 |
| 7.46000000000043 | 31.837 | 82.325 |
| 7.46200000000043 | 31.833 | 82.226 |
| 7.46400000000043 | 31.83 | 82.127 |
| 7.46600000000043 | 31.827 | 82.028 |
| 7.46800000000043 | 31.823 | 81.929 |
| 7.47000000000043 | 31.82 | 81.83 |
| 7.47200000000043 | 31.817 | 81.732 |
| 7.47400000000043 | 31.815 | 81.633 |
| 7.47600000000043 | 31.812 | 81.535 |
| 7.47800000000043 | 31.81 | 81.437 |
| 7.48000000000043 | 31.807 | 81.339 |
| 7.48200000000043 | 31.805 | 81.241 |
| 7.48400000000044 | 31.803 | 81.143 |
| 7.48600000000044 | 31.801 | 81.045 |
| 7.48800000000044 | 31.8 | 80.947 |
| 7.49000000000044 | 31.798 | 80.85 |
| 7.49200000000044 | 31.797 | 80.752 |
| 7.49400000000044 | 31.796 | 80.655 |
| 7.49600000000044 | 31.795 | 80.558 |
| 7.49800000000044 | 31.794 | 80.461 |
| 7.50000000000044 | 31.793 | 80.364 |
| 7.50200000000044 | 31.792 | 80.267 |
| 7.50400000000044 | 31.792 | 80.17 |
| 7.50600000000044 | 31.792 | 80.074 |
| 7.50800000000044 | 31.792 | 79.977 |
| 7.51000000000044 | 31.792 | 79.881 |
| 7.51200000000044 | 31.792 | 79.785 |
| 7.51400000000045 | 31.792 | 79.688 |
| 7.51600000000045 | 31.793 | 79.592 |
| 7.51800000000045 | 31.793 | 79.496 |
| 7.52000000000045 | 31.794 | 79.401 |
| 7.52200000000045 | 31.795 | 79.305 |
| 7.52400000000045 | 31.796 | 79.209 |
| 7.52600000000045 | 31.797 | 79.114 |
| 7.52800000000045 | 31.799 | 79.019 |
| 7.53000000000045 | 31.8 | 78.923 |
| 7.53200000000045 | 31.802 | 78.828 |
| 7.53400000000045 | 31.804 | 78.733 |
| 7.53600000000045 | 31.806 | 78.638 |
| 7.53800000000045 | 31.808 | 78.544 |
| 7.54000000000045 | 31.81 | 78.449 |
| 7.54200000000045 | 31.813 | 78.355 |
| 7.54400000000046 | 31.816 | 78.26 |
| 7.54600000000046 | 31.818 | 78.166 |
| 7.54800000000046 | 31.821 | 78.072 |
| 7.55000000000046 | 31.824 | 77.978 |
| 7.55200000000046 | 31.827 | 77.884 |
| 7.55400000000046 | 31.831 | 77.79 |
| 7.55600000000046 | 31.834 | 77.696 |
| 7.55800000000046 | 31.838 | 77.603 |
| 7.56000000000046 | 31.842 | 77.509 |
| 7.56200000000046 | 31.846 | 77.416 |
| 7.56400000000046 | 31.85 | 77.323 |
| 7.56600000000046 | 31.854 | 77.23 |
| 7.56800000000046 | 31.859 | 77.137 |
| 7.57000000000046 | 31.863 | 77.044 |
| 7.57200000000046 | 31.868 | 76.951 |
| 7.57400000000047 | 31.873 | 76.859 |
| 7.57600000000047 | 31.878 | 76.766 |
| 7.57800000000047 | 31.883 | 76.674 |
| 7.58000000000047 | 31.888 | 76.582 |
| 7.58200000000047 | 31.894 | 76.489 |
| 7.58400000000047 | 31.899 | 76.397 |
| 7.58600000000047 | 31.905 | 76.306 |
| 7.58800000000047 | 31.911 | 76.214 |
| 7.59000000000047 | 31.917 | 76.122 |
| 7.59200000000047 | 31.923 | 76.031 |
| 7.59400000000047 | 31.929 | 75.939 |
| 7.59600000000047 | 31.936 | 75.848 |
| 7.59800000000047 | 31.943 | 75.757 |
| 7.60000000000047 | 31.949 | 75.666 |
| 7.60200000000047 | 31.956 | 75.575 |
| 7.60400000000048 | 31.963 | 75.484 |
| 7.60600000000048 | 31.971 | 75.394 |
| 7.60800000000048 | 31.978 | 75.303 |
| 7.61000000000048 | 31.985 | 75.213 |
| 7.61200000000048 | 31.993 | 75.122 |
| 7.61400000000048 | 32.001 | 75.032 |
| 7.61600000000048 | 32.009 | 74.942 |
| 7.61800000000048 | 32.017 | 74.852 |
| 7.62000000000048 | 32.025 | 74.762 |
| 7.62200000000048 | 32.034 | 74.673 |
| 7.62400000000048 | 32.042 | 74.583 |
| 7.62600000000048 | 32.051 | 74.494 |
| 7.62800000000048 | 32.06 | 74.404 |
| 7.63000000000048 | 32.069 | 74.315 |
| 7.63200000000048 | 32.078 | 74.226 |
| 7.63400000000049 | 32.087 | 74.137 |
| 7.63600000000049 | 32.096 | 74.049 |
| 7.63800000000049 | 32.106 | 73.96 |
| 7.64000000000049 | 32.116 | 73.871 |
| 7.64200000000049 | 32.125 | 73.783 |
| 7.64400000000049 | 32.135 | 73.695 |
| 7.64600000000049 | 32.146 | 73.606 |
| 7.64800000000049 | 32.156 | 73.518 |
| 7.65000000000049 | 32.166 | 73.43 |
| 7.65200000000049 | 32.177 | 73.343 |
| 7.65400000000049 | 32.188 | 73.255 |
| 7.65600000000049 | 32.198 | 73.167 |
| 7.65800000000049 | 32.209 | 73.08 |
| 7.66000000000049 | 32.221 | 72.993 |
| 7.66200000000049 | 32.232 | 72.905 |
| 7.6640000000005 | 32.243 | 72.818 |
| 7.6660000000005 | 32.255 | 72.731 |
| 7.6680000000005 | 32.267 | 72.645 |
| 7.6700000000005 | 32.278 | 72.558 |
| 7.6720000000005 | 32.29 | 72.471 |
| 7.6740000000005 | 32.303 | 72.385 |
| 7.6760000000005 | 32.315 | 72.299 |
| 7.6780000000005 | 32.327 | 72.212 |
| 7.6800000000005 | 32.34 | 72.126 |
| 7.6820000000005 | 32.353 | 72.04 |
| 7.6840000000005 | 32.366 | 71.955 |
| 7.6860000000005 | 32.379 | 71.869 |
| 7.6880000000005 | 32.392 | 71.783 |
| 7.6900000000005 | 32.405 | 71.698 |
| 7.6920000000005 | 32.418 | 71.613 |
| 7.69400000000051 | 32.432 | 71.527 |
| 7.69600000000051 | 32.446 | 71.442 |
| 7.69800000000051 | 32.46 | 71.357 |
| 7.70000000000051 | 32.474 | 71.273 |
| 7.70200000000051 | 32.488 | 71.188 |
| 7.70400000000051 | 32.502 | 71.103 |
| 7.70600000000051 | 32.517 | 71.019 |
| 7.70800000000051 | 32.531 | 70.935 |
| 7.71000000000051 | 32.546 | 70.85 |
| 7.71200000000051 | 32.561 | 70.766 |
| 7.71400000000051 | 32.576 | 70.682 |
| 7.71600000000051 | 32.591 | 70.599 |
| 7.71800000000051 | 32.606 | 70.515 |
| 7.72000000000051 | 32.622 | 70.431 |
| 7.72200000000052 | 32.638 | 70.348 |
| 7.72400000000052 | 32.653 | 70.265 |
| 7.72600000000052 | 32.669 | 70.182 |
| 7.72800000000052 | 32.685 | 70.098 |
| 7.73000000000052 | 32.701 | 70.016 |
| 7.73200000000052 | 32.718 | 69.933 |
| 7.73400000000052 | 32.734 | 69.85 |
| 7.73600000000052 | 32.751 | 69.768 |
| 7.73800000000052 | 32.768 | 69.685 |
| 7.74000000000052 | 32.784 | 69.603 |
| 7.74200000000052 | 32.801 | 69.521 |
| 7.74400000000052 | 32.819 | 69.439 |
| 7.74600000000052 | 32.836 | 69.357 |
| 7.74800000000052 | 32.853 | 69.275 |
| 7.75000000000052 | 32.871 | 69.193 |
| 7.75200000000053 | 32.889 | 69.112 |
| 7.75400000000053 | 32.907 | 69.03 |
| 7.75600000000053 | 32.925 | 68.949 |
| 7.75800000000053 | 32.943 | 68.868 |
| 7.76000000000053 | 32.961 | 68.787 |
| 7.76200000000053 | 32.98 | 68.706 |
| 7.76400000000053 | 32.998 | 68.625 |
| 7.76600000000053 | 33.017 | 68.545 |
| 7.76800000000053 | 33.036 | 68.464 |
| 7.77000000000053 | 33.055 | 68.384 |
| 7.77200000000053 | 33.074 | 68.304 |
| 7.77400000000053 | 33.094 | 68.223 |
| 7.77600000000053 | 33.113 | 68.143 |
| 7.77800000000053 | 33.133 | 68.064 |
| 7.78000000000053 | 33.153 | 67.984 |
| 7.78200000000054 | 33.173 | 67.904 |
| 7.78400000000054 | 33.193 | 67.825 |
| 7.78600000000054 | 33.213 | 67.745 |
| 7.78800000000054 | 33.233 | 67.666 |
| 7.79000000000054 | 33.254 | 67.587 |
| 7.79200000000054 | 33.274 | 67.508 |
| 7.79400000000054 | 33.295 | 67.429 |
| 7.79600000000054 | 33.316 | 67.35 |
| 7.79800000000054 | 33.337 | 67.272 |
| 7.80000000000054 | 33.358 | 67.193 |
| 7.80200000000054 | 33.38 | 67.115 |
| 7.80400000000054 | 33.401 | 67.037 |
| 7.80600000000054 | 33.423 | 66.959 |
| 7.80800000000054 | 33.445 | 66.881 |
| 7.81000000000054 | 33.467 | 66.803 |
| 7.81200000000055 | 33.489 | 66.725 |
| 7.81400000000055 | 33.511 | 66.647 |
| 7.81600000000055 | 33.533 | 66.57 |
| 7.81800000000055 | 33.556 | 66.493 |
| 7.82000000000055 | 33.578 | 66.416 |
| 7.82200000000055 | 33.601 | 66.338 |
| 7.82400000000055 | 33.624 | 66.261 |
| 7.82600000000055 | 33.647 | 66.185 |
| 7.82800000000055 | 33.67 | 66.108 |
| 7.83000000000055 | 33.694 | 66.031 |
| 7.83200000000055 | 33.717 | 65.955 |
| 7.83400000000055 | 33.741 | 65.879 |
| 7.83600000000055 | 33.765 | 65.802 |
| 7.83800000000055 | 33.789 | 65.726 |
| 7.84000000000055 | 33.813 | 65.65 |
| 7.84200000000056 | 33.837 | 65.575 |
| 7.84400000000056 | 33.862 | 65.499 |
| 7.84600000000056 | 33.886 | 65.423 |
| 7.84800000000056 | 33.911 | 65.348 |
| 7.85000000000056 | 33.936 | 65.273 |
| 7.85200000000056 | 33.961 | 65.198 |
| 7.85400000000056 | 33.986 | 65.122 |
| 7.85600000000056 | 34.011 | 65.048 |
| 7.85800000000056 | 34.037 | 64.973 |
| 7.86000000000056 | 34.062 | 64.898 |
| 7.86200000000056 | 34.088 | 64.824 |
| 7.86400000000056 | 34.114 | 64.749 |
| 7.86600000000056 | 34.14 | 64.675 |
| 7.86800000000056 | 34.166 | 64.601 |
| 7.87000000000056 | 34.192 | 64.527 |
| 7.87200000000057 | 34.219 | 64.453 |
| 7.87400000000057 | 34.245 | 64.379 |
| 7.87600000000057 | 34.272 | 64.305 |
| 7.87800000000057 | 34.299 | 64.232 |
| 7.88000000000057 | 34.326 | 64.159 |
| 7.88200000000057 | 34.353 | 64.085 |
| 7.88400000000057 | 34.38 | 64.012 |
| 7.88600000000057 | 34.408 | 63.939 |
| 7.88800000000057 | 34.436 | 63.866 |
| 7.89000000000057 | 34.463 | 63.794 |
| 7.89200000000057 | 34.491 | 63.721 |
| 7.89400000000057 | 34.519 | 63.648 |
| 7.89600000000057 | 34.548 | 63.576 |
| 7.89800000000057 | 34.576 | 63.504 |
| 7.90000000000057 | 34.604 | 63.432 |
| 7.90200000000058 | 34.633 | 63.36 |
| 7.90400000000058 | 34.662 | 63.288 |
| 7.90600000000058 | 34.691 | 63.216 |
| 7.90800000000058 | 34.72 | 63.144 |
| 7.91000000000058 | 34.749 | 63.073 |
| 7.91200000000058 | 34.779 | 63.002 |
| 7.91400000000058 | 34.808 | 62.93 |
| 7.91600000000058 | 34.838 | 62.859 |
| 7.91800000000058 | 34.868 | 62.788 |
| 7.92000000000058 | 34.898 | 62.718 |
| 7.92200000000058 | 34.928 | 62.647 |
| 7.92400000000058 | 34.958 | 62.576 |
| 7.92600000000058 | 34.989 | 62.506 |
| 7.92800000000058 | 35.019 | 62.435 |
| 7.93000000000058 | 35.05 | 62.365 |
| 7.93200000000059 | 35.081 | 62.295 |
| 7.93400000000059 | 35.112 | 62.225 |
| 7.93600000000059 | 35.143 | 62.155 |
| 7.93800000000059 | 35.175 | 62.086 |
| 7.94000000000059 | 35.206 | 62.016 |
| 7.94200000000059 | 35.238 | 61.947 |
| 7.94400000000059 | 35.27 | 61.877 |
| 7.94600000000059 | 35.302 | 61.808 |
| 7.94800000000059 | 35.334 | 61.739 |
| 7.95000000000059 | 35.366 | 61.67 |
| 7.95200000000059 | 35.398 | 61.601 |
| 7.95400000000059 | 35.431 | 61.533 |
| 7.95600000000059 | 35.464 | 61.464 |
| 7.95800000000059 | 35.496 | 61.396 |
| 7.96000000000059 | 35.53 | 61.327 |
| 7.9620000000006 | 35.563 | 61.259 |
| 7.9640000000006 | 35.596 | 61.191 |
| 7.9660000000006 | 35.629 | 61.123 |
| 7.9680000000006 | 35.663 | 61.055 |
| 7.9700000000006 | 35.697 | 60.988 |
| 7.9720000000006 | 35.731 | 60.92 |
| 7.9740000000006 | 35.765 | 60.853 |
| 7.9760000000006 | 35.799 | 60.785 |
| 7.9780000000006 | 35.834 | 60.718 |
| 7.9800000000006 | 35.868 | 60.651 |
| 7.9820000000006 | 35.903 | 60.584 |
| 7.9840000000006 | 35.938 | 60.517 |
| 7.9860000000006 | 35.973 | 60.451 |
| 7.9880000000006 | 36.008 | 60.384 |
| 7.9900000000006 | 36.043 | 60.318 |
| 7.99200000000061 | 36.079 | 60.252 |
| 7.99400000000061 | 36.114 | 60.185 |
| 7.99600000000061 | 36.15 | 60.119 |
| 7.99800000000061 | 36.186 | 60.053 |
| 8.00000000000061 | 36.222 | 59.988 |
| 8.00200000000061 | 36.258 | 59.922 |
| 8.00400000000061 | 36.295 | 59.856 |
| 8.00600000000061 | 36.331 | 59.791 |
| 8.00800000000061 | 36.368 | 59.726 |
| 8.01000000000061 | 36.405 | 59.661 |
| 8.01200000000061 | 36.442 | 59.596 |
| 8.01400000000061 | 36.479 | 59.531 |
| 8.01600000000061 | 36.516 | 59.466 |
| 8.01800000000061 | 36.554 | 59.401 |
| 8.02000000000061 | 36.591 | 59.337 |
| 8.02200000000062 | 36.629 | 59.272 |
| 8.02400000000062 | 36.667 | 59.208 |
| 8.02600000000062 | 36.705 | 59.144 |
| 8.02800000000062 | 36.744 | 59.08 |
| 8.03000000000062 | 36.782 | 59.016 |
| 8.03200000000062 | 36.821 | 58.952 |
| 8.03400000000062 | 36.859 | 58.889 |
| 8.03600000000062 | 36.898 | 58.825 |
| 8.03800000000062 | 36.937 | 58.762 |
| 8.04000000000062 | 36.977 | 58.699 |
| 8.04200000000062 | 37.016 | 58.635 |
| 8.04400000000062 | 37.056 | 58.572 |
| 8.04600000000062 | 37.095 | 58.51 |
| 8.04800000000062 | 37.135 | 58.447 |
| 8.05000000000062 | 37.175 | 58.384 |
| 8.05200000000063 | 37.215 | 58.322 |
| 8.05400000000063 | 37.256 | 58.259 |
| 8.05600000000063 | 37.296 | 58.197 |
| 8.05800000000063 | 37.337 | 58.135 |
| 8.06000000000063 | 37.378 | 58.073 |
| 8.06200000000063 | 37.419 | 58.011 |
| 8.06400000000063 | 37.46 | 57.949 |
| 8.06600000000063 | 37.501 | 57.888 |
| 8.06800000000063 | 37.543 | 57.826 |
| 8.07000000000063 | 37.584 | 57.765 |
| 8.07200000000063 | 37.626 | 57.703 |
| 8.07400000000063 | 37.668 | 57.642 |
| 8.07600000000063 | 37.71 | 57.581 |
| 8.07800000000063 | 37.752 | 57.52 |
| 8.08000000000063 | 37.795 | 57.46 |
| 8.08200000000064 | 37.837 | 57.399 |
| 8.08400000000064 | 37.88 | 57.339 |
| 8.08600000000064 | 37.923 | 57.278 |
| 8.08800000000064 | 37.966 | 57.218 |
| 8.09000000000064 | 38.009 | 57.158 |
| 8.09200000000064 | 38.053 | 57.098 |
| 8.09400000000064 | 38.096 | 57.038 |
| 8.09600000000064 | 38.14 | 56.978 |